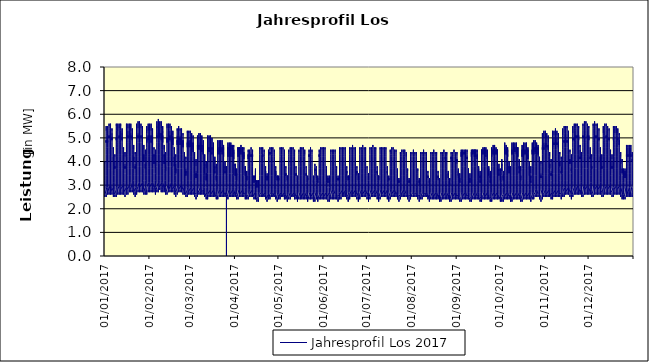
| Category | Jahresprofil Los 2017 |
|---|---|
| 01/01/2017 | 2.9 |
| 01/01/2017 | 2.8 |
| 01/01/2017 | 2.7 |
| 01/01/2017 | 2.6 |
| 01/01/2017 | 2.6 |
| 01/01/2017 | 2.5 |
| 01/01/2017 | 2.5 |
| 01/01/2017 | 2.6 |
| 01/01/2017 | 2.6 |
| 01/01/2017 | 2.8 |
| 01/01/2017 | 2.9 |
| 01/01/2017 | 3.2 |
| 01/01/2017 | 3.3 |
| 01/01/2017 | 3.3 |
| 01/01/2017 | 3.3 |
| 01/01/2017 | 3.3 |
| 01/01/2017 | 3.7 |
| 01/01/2017 | 3.9 |
| 01/01/2017 | 4 |
| 01/01/2017 | 3.9 |
| 01/01/2017 | 3.6 |
| 01/01/2017 | 3.4 |
| 01/01/2017 | 3.2 |
| 01/01/2017 | 3 |
| 01/01/2017 | 2.8 |
| 02/01/2017 | 2.6 |
| 02/01/2017 | 2.5 |
| 02/01/2017 | 2.5 |
| 02/01/2017 | 2.6 |
| 02/01/2017 | 2.8 |
| 02/01/2017 | 3.4 |
| 02/01/2017 | 3.9 |
| 02/01/2017 | 4.3 |
| 02/01/2017 | 4.6 |
| 02/01/2017 | 4.8 |
| 02/01/2017 | 4.8 |
| 02/01/2017 | 4.9 |
| 02/01/2017 | 4.8 |
| 02/01/2017 | 4.8 |
| 02/01/2017 | 4.9 |
| 02/01/2017 | 5.2 |
| 02/01/2017 | 5.5 |
| 02/01/2017 | 5.3 |
| 02/01/2017 | 5.1 |
| 02/01/2017 | 4.5 |
| 02/01/2017 | 4 |
| 02/01/2017 | 3.6 |
| 02/01/2017 | 3.3 |
| 02/01/2017 | 2.9 |
| 03/01/2017 | 2.7 |
| 03/01/2017 | 2.6 |
| 03/01/2017 | 2.6 |
| 03/01/2017 | 2.7 |
| 03/01/2017 | 2.9 |
| 03/01/2017 | 3.4 |
| 03/01/2017 | 4 |
| 03/01/2017 | 4.4 |
| 03/01/2017 | 4.6 |
| 03/01/2017 | 4.8 |
| 03/01/2017 | 4.9 |
| 03/01/2017 | 4.9 |
| 03/01/2017 | 4.9 |
| 03/01/2017 | 4.8 |
| 03/01/2017 | 4.9 |
| 03/01/2017 | 5.3 |
| 03/01/2017 | 5.5 |
| 03/01/2017 | 5.4 |
| 03/01/2017 | 5.2 |
| 03/01/2017 | 4.6 |
| 03/01/2017 | 4 |
| 03/01/2017 | 3.7 |
| 03/01/2017 | 3.3 |
| 03/01/2017 | 3 |
| 04/01/2017 | 2.7 |
| 04/01/2017 | 2.6 |
| 04/01/2017 | 2.6 |
| 04/01/2017 | 2.7 |
| 04/01/2017 | 3 |
| 04/01/2017 | 3.6 |
| 04/01/2017 | 4.3 |
| 04/01/2017 | 4.6 |
| 04/01/2017 | 4.8 |
| 04/01/2017 | 4.9 |
| 04/01/2017 | 5 |
| 04/01/2017 | 5.1 |
| 04/01/2017 | 5 |
| 04/01/2017 | 5 |
| 04/01/2017 | 5.1 |
| 04/01/2017 | 5.4 |
| 04/01/2017 | 5.6 |
| 04/01/2017 | 5.5 |
| 04/01/2017 | 5.3 |
| 04/01/2017 | 4.7 |
| 04/01/2017 | 4.1 |
| 04/01/2017 | 3.7 |
| 04/01/2017 | 3.3 |
| 04/01/2017 | 3 |
| 05/01/2017 | 2.7 |
| 05/01/2017 | 2.6 |
| 05/01/2017 | 2.6 |
| 05/01/2017 | 2.7 |
| 05/01/2017 | 3 |
| 05/01/2017 | 3.6 |
| 05/01/2017 | 4.2 |
| 05/01/2017 | 4.6 |
| 05/01/2017 | 4.8 |
| 05/01/2017 | 4.9 |
| 05/01/2017 | 5 |
| 05/01/2017 | 5 |
| 05/01/2017 | 5 |
| 05/01/2017 | 5 |
| 05/01/2017 | 5 |
| 05/01/2017 | 5.4 |
| 05/01/2017 | 5.6 |
| 05/01/2017 | 5.5 |
| 05/01/2017 | 5.3 |
| 05/01/2017 | 4.7 |
| 05/01/2017 | 4.1 |
| 05/01/2017 | 3.7 |
| 05/01/2017 | 3.3 |
| 05/01/2017 | 3 |
| 06/01/2017 | 2.7 |
| 06/01/2017 | 2.6 |
| 06/01/2017 | 2.6 |
| 06/01/2017 | 2.7 |
| 06/01/2017 | 3 |
| 06/01/2017 | 3.6 |
| 06/01/2017 | 4.2 |
| 06/01/2017 | 4.6 |
| 06/01/2017 | 4.8 |
| 06/01/2017 | 4.9 |
| 06/01/2017 | 5 |
| 06/01/2017 | 5 |
| 06/01/2017 | 4.9 |
| 06/01/2017 | 4.9 |
| 06/01/2017 | 4.9 |
| 06/01/2017 | 5.2 |
| 06/01/2017 | 5.4 |
| 06/01/2017 | 5.3 |
| 06/01/2017 | 5.1 |
| 06/01/2017 | 4.5 |
| 06/01/2017 | 4 |
| 06/01/2017 | 3.6 |
| 06/01/2017 | 3.3 |
| 06/01/2017 | 2.9 |
| 07/01/2017 | 2.7 |
| 07/01/2017 | 2.6 |
| 07/01/2017 | 2.6 |
| 07/01/2017 | 2.5 |
| 07/01/2017 | 2.6 |
| 07/01/2017 | 2.8 |
| 07/01/2017 | 3.1 |
| 07/01/2017 | 3.4 |
| 07/01/2017 | 3.8 |
| 07/01/2017 | 4 |
| 07/01/2017 | 4.2 |
| 07/01/2017 | 4.2 |
| 07/01/2017 | 4.1 |
| 07/01/2017 | 4 |
| 07/01/2017 | 4.1 |
| 07/01/2017 | 4.3 |
| 07/01/2017 | 4.6 |
| 07/01/2017 | 4.6 |
| 07/01/2017 | 4.5 |
| 07/01/2017 | 4 |
| 07/01/2017 | 3.6 |
| 07/01/2017 | 3.4 |
| 07/01/2017 | 3.1 |
| 07/01/2017 | 2.8 |
| 08/01/2017 | 2.6 |
| 08/01/2017 | 2.5 |
| 08/01/2017 | 2.5 |
| 08/01/2017 | 2.5 |
| 08/01/2017 | 2.5 |
| 08/01/2017 | 2.6 |
| 08/01/2017 | 2.8 |
| 08/01/2017 | 3 |
| 08/01/2017 | 3.3 |
| 08/01/2017 | 3.5 |
| 08/01/2017 | 3.7 |
| 08/01/2017 | 3.8 |
| 08/01/2017 | 3.7 |
| 08/01/2017 | 3.7 |
| 08/01/2017 | 3.7 |
| 08/01/2017 | 4 |
| 08/01/2017 | 4.3 |
| 08/01/2017 | 4.3 |
| 08/01/2017 | 4.2 |
| 08/01/2017 | 3.9 |
| 08/01/2017 | 3.6 |
| 08/01/2017 | 3.4 |
| 08/01/2017 | 3.1 |
| 08/01/2017 | 2.8 |
| 09/01/2017 | 2.6 |
| 09/01/2017 | 2.6 |
| 09/01/2017 | 2.5 |
| 09/01/2017 | 2.6 |
| 09/01/2017 | 2.9 |
| 09/01/2017 | 3.6 |
| 09/01/2017 | 4.2 |
| 09/01/2017 | 4.6 |
| 09/01/2017 | 4.7 |
| 09/01/2017 | 4.9 |
| 09/01/2017 | 5 |
| 09/01/2017 | 5 |
| 09/01/2017 | 5 |
| 09/01/2017 | 4.9 |
| 09/01/2017 | 5 |
| 09/01/2017 | 5.3 |
| 09/01/2017 | 5.6 |
| 09/01/2017 | 5.5 |
| 09/01/2017 | 5.3 |
| 09/01/2017 | 4.7 |
| 09/01/2017 | 4.1 |
| 09/01/2017 | 3.7 |
| 09/01/2017 | 3.3 |
| 09/01/2017 | 3 |
| 10/01/2017 | 2.7 |
| 10/01/2017 | 2.6 |
| 10/01/2017 | 2.6 |
| 10/01/2017 | 2.7 |
| 10/01/2017 | 3 |
| 10/01/2017 | 3.6 |
| 10/01/2017 | 4.3 |
| 10/01/2017 | 4.6 |
| 10/01/2017 | 4.8 |
| 10/01/2017 | 4.9 |
| 10/01/2017 | 5 |
| 10/01/2017 | 5 |
| 10/01/2017 | 5 |
| 10/01/2017 | 5 |
| 10/01/2017 | 5 |
| 10/01/2017 | 5.4 |
| 10/01/2017 | 5.6 |
| 10/01/2017 | 5.6 |
| 10/01/2017 | 5.3 |
| 10/01/2017 | 4.7 |
| 10/01/2017 | 4.2 |
| 10/01/2017 | 3.7 |
| 10/01/2017 | 3.3 |
| 10/01/2017 | 3 |
| 11/01/2017 | 2.8 |
| 11/01/2017 | 2.7 |
| 11/01/2017 | 2.6 |
| 11/01/2017 | 2.7 |
| 11/01/2017 | 3 |
| 11/01/2017 | 3.7 |
| 11/01/2017 | 4.3 |
| 11/01/2017 | 4.7 |
| 11/01/2017 | 4.9 |
| 11/01/2017 | 5 |
| 11/01/2017 | 5.1 |
| 11/01/2017 | 5.1 |
| 11/01/2017 | 5 |
| 11/01/2017 | 5 |
| 11/01/2017 | 5.1 |
| 11/01/2017 | 5.3 |
| 11/01/2017 | 5.6 |
| 11/01/2017 | 5.6 |
| 11/01/2017 | 5.4 |
| 11/01/2017 | 4.7 |
| 11/01/2017 | 4.2 |
| 11/01/2017 | 3.8 |
| 11/01/2017 | 3.3 |
| 11/01/2017 | 3 |
| 12/01/2017 | 2.8 |
| 12/01/2017 | 2.7 |
| 12/01/2017 | 2.6 |
| 12/01/2017 | 2.7 |
| 12/01/2017 | 3 |
| 12/01/2017 | 3.6 |
| 12/01/2017 | 4.3 |
| 12/01/2017 | 4.7 |
| 12/01/2017 | 4.8 |
| 12/01/2017 | 5 |
| 12/01/2017 | 5 |
| 12/01/2017 | 5.1 |
| 12/01/2017 | 5 |
| 12/01/2017 | 5 |
| 12/01/2017 | 5 |
| 12/01/2017 | 5.3 |
| 12/01/2017 | 5.6 |
| 12/01/2017 | 5.5 |
| 12/01/2017 | 5.3 |
| 12/01/2017 | 4.7 |
| 12/01/2017 | 4.2 |
| 12/01/2017 | 3.8 |
| 12/01/2017 | 3.3 |
| 12/01/2017 | 3 |
| 13/01/2017 | 2.8 |
| 13/01/2017 | 2.7 |
| 13/01/2017 | 2.6 |
| 13/01/2017 | 2.7 |
| 13/01/2017 | 3 |
| 13/01/2017 | 3.6 |
| 13/01/2017 | 4.3 |
| 13/01/2017 | 4.6 |
| 13/01/2017 | 4.8 |
| 13/01/2017 | 5 |
| 13/01/2017 | 5 |
| 13/01/2017 | 5 |
| 13/01/2017 | 4.9 |
| 13/01/2017 | 4.9 |
| 13/01/2017 | 4.9 |
| 13/01/2017 | 5.2 |
| 13/01/2017 | 5.4 |
| 13/01/2017 | 5.4 |
| 13/01/2017 | 5.1 |
| 13/01/2017 | 4.5 |
| 13/01/2017 | 4 |
| 13/01/2017 | 3.7 |
| 13/01/2017 | 3.3 |
| 13/01/2017 | 3 |
| 14/01/2017 | 2.8 |
| 14/01/2017 | 2.7 |
| 14/01/2017 | 2.6 |
| 14/01/2017 | 2.6 |
| 14/01/2017 | 2.6 |
| 14/01/2017 | 2.8 |
| 14/01/2017 | 3.1 |
| 14/01/2017 | 3.5 |
| 14/01/2017 | 3.8 |
| 14/01/2017 | 4.1 |
| 14/01/2017 | 4.2 |
| 14/01/2017 | 4.2 |
| 14/01/2017 | 4.1 |
| 14/01/2017 | 4 |
| 14/01/2017 | 4 |
| 14/01/2017 | 4.3 |
| 14/01/2017 | 4.6 |
| 14/01/2017 | 4.6 |
| 14/01/2017 | 4.5 |
| 14/01/2017 | 4.1 |
| 14/01/2017 | 3.7 |
| 14/01/2017 | 3.4 |
| 14/01/2017 | 3.1 |
| 14/01/2017 | 2.9 |
| 15/01/2017 | 2.7 |
| 15/01/2017 | 2.6 |
| 15/01/2017 | 2.5 |
| 15/01/2017 | 2.5 |
| 15/01/2017 | 2.5 |
| 15/01/2017 | 2.6 |
| 15/01/2017 | 2.8 |
| 15/01/2017 | 3.1 |
| 15/01/2017 | 3.3 |
| 15/01/2017 | 3.5 |
| 15/01/2017 | 3.7 |
| 15/01/2017 | 3.8 |
| 15/01/2017 | 3.7 |
| 15/01/2017 | 3.7 |
| 15/01/2017 | 3.7 |
| 15/01/2017 | 3.9 |
| 15/01/2017 | 4.3 |
| 15/01/2017 | 4.4 |
| 15/01/2017 | 4.2 |
| 15/01/2017 | 3.9 |
| 15/01/2017 | 3.6 |
| 15/01/2017 | 3.5 |
| 15/01/2017 | 3.2 |
| 15/01/2017 | 2.9 |
| 16/01/2017 | 2.7 |
| 16/01/2017 | 2.6 |
| 16/01/2017 | 2.6 |
| 16/01/2017 | 2.7 |
| 16/01/2017 | 3 |
| 16/01/2017 | 3.6 |
| 16/01/2017 | 4.3 |
| 16/01/2017 | 4.6 |
| 16/01/2017 | 4.8 |
| 16/01/2017 | 4.9 |
| 16/01/2017 | 5 |
| 16/01/2017 | 5 |
| 16/01/2017 | 5 |
| 16/01/2017 | 5 |
| 16/01/2017 | 5 |
| 16/01/2017 | 5.2 |
| 16/01/2017 | 5.6 |
| 16/01/2017 | 5.6 |
| 16/01/2017 | 5.3 |
| 16/01/2017 | 4.7 |
| 16/01/2017 | 4.2 |
| 16/01/2017 | 3.8 |
| 16/01/2017 | 3.3 |
| 16/01/2017 | 3 |
| 17/01/2017 | 2.8 |
| 17/01/2017 | 2.7 |
| 17/01/2017 | 2.6 |
| 17/01/2017 | 2.7 |
| 17/01/2017 | 3 |
| 17/01/2017 | 3.7 |
| 17/01/2017 | 4.3 |
| 17/01/2017 | 4.7 |
| 17/01/2017 | 4.9 |
| 17/01/2017 | 5 |
| 17/01/2017 | 5.1 |
| 17/01/2017 | 5.1 |
| 17/01/2017 | 5 |
| 17/01/2017 | 5 |
| 17/01/2017 | 5 |
| 17/01/2017 | 5.3 |
| 17/01/2017 | 5.6 |
| 17/01/2017 | 5.6 |
| 17/01/2017 | 5.4 |
| 17/01/2017 | 4.8 |
| 17/01/2017 | 4.2 |
| 17/01/2017 | 3.8 |
| 17/01/2017 | 3.4 |
| 17/01/2017 | 3 |
| 18/01/2017 | 2.8 |
| 18/01/2017 | 2.7 |
| 18/01/2017 | 2.7 |
| 18/01/2017 | 2.8 |
| 18/01/2017 | 3.1 |
| 18/01/2017 | 3.7 |
| 18/01/2017 | 4.4 |
| 18/01/2017 | 4.7 |
| 18/01/2017 | 4.9 |
| 18/01/2017 | 5 |
| 18/01/2017 | 5.1 |
| 18/01/2017 | 5.1 |
| 18/01/2017 | 5.1 |
| 18/01/2017 | 5 |
| 18/01/2017 | 5 |
| 18/01/2017 | 5.3 |
| 18/01/2017 | 5.6 |
| 18/01/2017 | 5.6 |
| 18/01/2017 | 5.4 |
| 18/01/2017 | 4.8 |
| 18/01/2017 | 4.2 |
| 18/01/2017 | 3.8 |
| 18/01/2017 | 3.4 |
| 18/01/2017 | 3 |
| 19/01/2017 | 2.8 |
| 19/01/2017 | 2.7 |
| 19/01/2017 | 2.7 |
| 19/01/2017 | 2.8 |
| 19/01/2017 | 3.1 |
| 19/01/2017 | 3.7 |
| 19/01/2017 | 4.4 |
| 19/01/2017 | 4.7 |
| 19/01/2017 | 4.9 |
| 19/01/2017 | 5 |
| 19/01/2017 | 5.1 |
| 19/01/2017 | 5.1 |
| 19/01/2017 | 5 |
| 19/01/2017 | 5 |
| 19/01/2017 | 5 |
| 19/01/2017 | 5.2 |
| 19/01/2017 | 5.6 |
| 19/01/2017 | 5.6 |
| 19/01/2017 | 5.3 |
| 19/01/2017 | 4.7 |
| 19/01/2017 | 4.2 |
| 19/01/2017 | 3.8 |
| 19/01/2017 | 3.4 |
| 19/01/2017 | 3.1 |
| 20/01/2017 | 2.8 |
| 20/01/2017 | 2.7 |
| 20/01/2017 | 2.7 |
| 20/01/2017 | 2.8 |
| 20/01/2017 | 3 |
| 20/01/2017 | 3.7 |
| 20/01/2017 | 4.3 |
| 20/01/2017 | 4.7 |
| 20/01/2017 | 4.9 |
| 20/01/2017 | 5 |
| 20/01/2017 | 5.1 |
| 20/01/2017 | 5.1 |
| 20/01/2017 | 5 |
| 20/01/2017 | 4.9 |
| 20/01/2017 | 4.9 |
| 20/01/2017 | 5.1 |
| 20/01/2017 | 5.4 |
| 20/01/2017 | 5.4 |
| 20/01/2017 | 5.1 |
| 20/01/2017 | 4.5 |
| 20/01/2017 | 4 |
| 20/01/2017 | 3.7 |
| 20/01/2017 | 3.3 |
| 20/01/2017 | 3 |
| 21/01/2017 | 2.8 |
| 21/01/2017 | 2.7 |
| 21/01/2017 | 2.6 |
| 21/01/2017 | 2.6 |
| 21/01/2017 | 2.7 |
| 21/01/2017 | 2.9 |
| 21/01/2017 | 3.2 |
| 21/01/2017 | 3.5 |
| 21/01/2017 | 3.9 |
| 21/01/2017 | 4.1 |
| 21/01/2017 | 4.2 |
| 21/01/2017 | 4.2 |
| 21/01/2017 | 4.1 |
| 21/01/2017 | 4 |
| 21/01/2017 | 4 |
| 21/01/2017 | 4.2 |
| 21/01/2017 | 4.6 |
| 21/01/2017 | 4.7 |
| 21/01/2017 | 4.5 |
| 21/01/2017 | 4.1 |
| 21/01/2017 | 3.7 |
| 21/01/2017 | 3.4 |
| 21/01/2017 | 3.2 |
| 21/01/2017 | 2.9 |
| 22/01/2017 | 2.7 |
| 22/01/2017 | 2.6 |
| 22/01/2017 | 2.6 |
| 22/01/2017 | 2.5 |
| 22/01/2017 | 2.5 |
| 22/01/2017 | 2.7 |
| 22/01/2017 | 2.9 |
| 22/01/2017 | 3.1 |
| 22/01/2017 | 3.4 |
| 22/01/2017 | 3.6 |
| 22/01/2017 | 3.8 |
| 22/01/2017 | 3.8 |
| 22/01/2017 | 3.7 |
| 22/01/2017 | 3.7 |
| 22/01/2017 | 3.7 |
| 22/01/2017 | 3.9 |
| 22/01/2017 | 4.2 |
| 22/01/2017 | 4.4 |
| 22/01/2017 | 4.3 |
| 22/01/2017 | 3.9 |
| 22/01/2017 | 3.7 |
| 22/01/2017 | 3.5 |
| 22/01/2017 | 3.2 |
| 22/01/2017 | 2.9 |
| 23/01/2017 | 2.7 |
| 23/01/2017 | 2.6 |
| 23/01/2017 | 2.6 |
| 23/01/2017 | 2.7 |
| 23/01/2017 | 3 |
| 23/01/2017 | 3.7 |
| 23/01/2017 | 4.3 |
| 23/01/2017 | 4.7 |
| 23/01/2017 | 4.9 |
| 23/01/2017 | 5 |
| 23/01/2017 | 5.1 |
| 23/01/2017 | 5.1 |
| 23/01/2017 | 5 |
| 23/01/2017 | 5 |
| 23/01/2017 | 5 |
| 23/01/2017 | 5.1 |
| 23/01/2017 | 5.5 |
| 23/01/2017 | 5.6 |
| 23/01/2017 | 5.4 |
| 23/01/2017 | 4.7 |
| 23/01/2017 | 4.2 |
| 23/01/2017 | 3.8 |
| 23/01/2017 | 3.4 |
| 23/01/2017 | 3 |
| 24/01/2017 | 2.8 |
| 24/01/2017 | 2.7 |
| 24/01/2017 | 2.7 |
| 24/01/2017 | 2.8 |
| 24/01/2017 | 3.1 |
| 24/01/2017 | 3.8 |
| 24/01/2017 | 4.4 |
| 24/01/2017 | 4.8 |
| 24/01/2017 | 4.9 |
| 24/01/2017 | 5.1 |
| 24/01/2017 | 5.1 |
| 24/01/2017 | 5.1 |
| 24/01/2017 | 5 |
| 24/01/2017 | 5 |
| 24/01/2017 | 5 |
| 24/01/2017 | 5.2 |
| 24/01/2017 | 5.6 |
| 24/01/2017 | 5.7 |
| 24/01/2017 | 5.4 |
| 24/01/2017 | 4.8 |
| 24/01/2017 | 4.2 |
| 24/01/2017 | 3.8 |
| 24/01/2017 | 3.4 |
| 24/01/2017 | 3.1 |
| 25/01/2017 | 2.8 |
| 25/01/2017 | 2.7 |
| 25/01/2017 | 2.7 |
| 25/01/2017 | 2.8 |
| 25/01/2017 | 3.1 |
| 25/01/2017 | 3.8 |
| 25/01/2017 | 4.5 |
| 25/01/2017 | 4.8 |
| 25/01/2017 | 5 |
| 25/01/2017 | 5.1 |
| 25/01/2017 | 5.2 |
| 25/01/2017 | 5.2 |
| 25/01/2017 | 5.1 |
| 25/01/2017 | 5 |
| 25/01/2017 | 5 |
| 25/01/2017 | 5.2 |
| 25/01/2017 | 5.6 |
| 25/01/2017 | 5.7 |
| 25/01/2017 | 5.4 |
| 25/01/2017 | 4.8 |
| 25/01/2017 | 4.2 |
| 25/01/2017 | 3.8 |
| 25/01/2017 | 3.4 |
| 25/01/2017 | 3.1 |
| 26/01/2017 | 2.9 |
| 26/01/2017 | 2.7 |
| 26/01/2017 | 2.7 |
| 26/01/2017 | 2.8 |
| 26/01/2017 | 3.1 |
| 26/01/2017 | 3.8 |
| 26/01/2017 | 4.4 |
| 26/01/2017 | 4.8 |
| 26/01/2017 | 5 |
| 26/01/2017 | 5.1 |
| 26/01/2017 | 5.1 |
| 26/01/2017 | 5.1 |
| 26/01/2017 | 5 |
| 26/01/2017 | 5 |
| 26/01/2017 | 5 |
| 26/01/2017 | 5.1 |
| 26/01/2017 | 5.5 |
| 26/01/2017 | 5.6 |
| 26/01/2017 | 5.4 |
| 26/01/2017 | 4.8 |
| 26/01/2017 | 4.2 |
| 26/01/2017 | 3.8 |
| 26/01/2017 | 3.4 |
| 26/01/2017 | 3.1 |
| 27/01/2017 | 2.9 |
| 27/01/2017 | 2.7 |
| 27/01/2017 | 2.7 |
| 27/01/2017 | 2.8 |
| 27/01/2017 | 3.1 |
| 27/01/2017 | 3.8 |
| 27/01/2017 | 4.4 |
| 27/01/2017 | 4.8 |
| 27/01/2017 | 5 |
| 27/01/2017 | 5.1 |
| 27/01/2017 | 5.1 |
| 27/01/2017 | 5.1 |
| 27/01/2017 | 5 |
| 27/01/2017 | 4.9 |
| 27/01/2017 | 4.9 |
| 27/01/2017 | 5 |
| 27/01/2017 | 5.4 |
| 27/01/2017 | 5.5 |
| 27/01/2017 | 5.2 |
| 27/01/2017 | 4.6 |
| 27/01/2017 | 4.1 |
| 27/01/2017 | 3.7 |
| 27/01/2017 | 3.4 |
| 27/01/2017 | 3.1 |
| 28/01/2017 | 2.8 |
| 28/01/2017 | 2.7 |
| 28/01/2017 | 2.7 |
| 28/01/2017 | 2.6 |
| 28/01/2017 | 2.7 |
| 28/01/2017 | 2.9 |
| 28/01/2017 | 3.2 |
| 28/01/2017 | 3.6 |
| 28/01/2017 | 3.9 |
| 28/01/2017 | 4.2 |
| 28/01/2017 | 4.3 |
| 28/01/2017 | 4.3 |
| 28/01/2017 | 4.1 |
| 28/01/2017 | 4 |
| 28/01/2017 | 4 |
| 28/01/2017 | 4.1 |
| 28/01/2017 | 4.6 |
| 28/01/2017 | 4.7 |
| 28/01/2017 | 4.5 |
| 28/01/2017 | 4.1 |
| 28/01/2017 | 3.7 |
| 28/01/2017 | 3.5 |
| 28/01/2017 | 3.2 |
| 28/01/2017 | 2.9 |
| 29/01/2017 | 2.7 |
| 29/01/2017 | 2.6 |
| 29/01/2017 | 2.6 |
| 29/01/2017 | 2.6 |
| 29/01/2017 | 2.6 |
| 29/01/2017 | 2.7 |
| 29/01/2017 | 2.9 |
| 29/01/2017 | 3.2 |
| 29/01/2017 | 3.4 |
| 29/01/2017 | 3.6 |
| 29/01/2017 | 3.8 |
| 29/01/2017 | 3.9 |
| 29/01/2017 | 3.8 |
| 29/01/2017 | 3.7 |
| 29/01/2017 | 3.7 |
| 29/01/2017 | 3.8 |
| 29/01/2017 | 4.2 |
| 29/01/2017 | 4.5 |
| 29/01/2017 | 4.3 |
| 29/01/2017 | 4 |
| 29/01/2017 | 3.7 |
| 29/01/2017 | 3.5 |
| 29/01/2017 | 3.2 |
| 29/01/2017 | 3 |
| 30/01/2017 | 2.7 |
| 30/01/2017 | 2.6 |
| 30/01/2017 | 2.6 |
| 30/01/2017 | 2.7 |
| 30/01/2017 | 3 |
| 30/01/2017 | 3.6 |
| 30/01/2017 | 4.2 |
| 30/01/2017 | 4.6 |
| 30/01/2017 | 4.8 |
| 30/01/2017 | 5 |
| 30/01/2017 | 5 |
| 30/01/2017 | 5 |
| 30/01/2017 | 4.9 |
| 30/01/2017 | 4.9 |
| 30/01/2017 | 4.8 |
| 30/01/2017 | 4.9 |
| 30/01/2017 | 5.4 |
| 30/01/2017 | 5.5 |
| 30/01/2017 | 5.2 |
| 30/01/2017 | 4.6 |
| 30/01/2017 | 4.1 |
| 30/01/2017 | 3.8 |
| 30/01/2017 | 3.4 |
| 30/01/2017 | 3.1 |
| 31/01/2017 | 2.9 |
| 31/01/2017 | 2.7 |
| 31/01/2017 | 2.7 |
| 31/01/2017 | 2.8 |
| 31/01/2017 | 3.1 |
| 31/01/2017 | 3.7 |
| 31/01/2017 | 4.3 |
| 31/01/2017 | 4.7 |
| 31/01/2017 | 4.9 |
| 31/01/2017 | 5 |
| 31/01/2017 | 5.1 |
| 31/01/2017 | 5 |
| 31/01/2017 | 5 |
| 31/01/2017 | 4.9 |
| 31/01/2017 | 4.9 |
| 31/01/2017 | 5 |
| 31/01/2017 | 5.5 |
| 31/01/2017 | 5.6 |
| 31/01/2017 | 5.3 |
| 31/01/2017 | 4.7 |
| 31/01/2017 | 4.2 |
| 31/01/2017 | 3.8 |
| 31/01/2017 | 3.4 |
| 31/01/2017 | 3.1 |
| 01/02/2017 | 2.9 |
| 01/02/2017 | 2.8 |
| 01/02/2017 | 2.7 |
| 01/02/2017 | 2.8 |
| 01/02/2017 | 3.1 |
| 01/02/2017 | 3.7 |
| 01/02/2017 | 4.3 |
| 01/02/2017 | 4.7 |
| 01/02/2017 | 4.9 |
| 01/02/2017 | 5.1 |
| 01/02/2017 | 5.1 |
| 01/02/2017 | 5.1 |
| 01/02/2017 | 5 |
| 01/02/2017 | 4.9 |
| 01/02/2017 | 4.9 |
| 01/02/2017 | 5 |
| 01/02/2017 | 5.5 |
| 01/02/2017 | 5.6 |
| 01/02/2017 | 5.3 |
| 01/02/2017 | 4.7 |
| 01/02/2017 | 4.2 |
| 01/02/2017 | 3.8 |
| 01/02/2017 | 3.4 |
| 01/02/2017 | 3.1 |
| 02/02/2017 | 2.9 |
| 02/02/2017 | 2.8 |
| 02/02/2017 | 2.7 |
| 02/02/2017 | 2.8 |
| 02/02/2017 | 3.1 |
| 02/02/2017 | 3.7 |
| 02/02/2017 | 4.3 |
| 02/02/2017 | 4.7 |
| 02/02/2017 | 4.9 |
| 02/02/2017 | 5.1 |
| 02/02/2017 | 5.1 |
| 02/02/2017 | 5.1 |
| 02/02/2017 | 5 |
| 02/02/2017 | 4.9 |
| 02/02/2017 | 4.8 |
| 02/02/2017 | 4.9 |
| 02/02/2017 | 5.4 |
| 02/02/2017 | 5.6 |
| 02/02/2017 | 5.3 |
| 02/02/2017 | 4.7 |
| 02/02/2017 | 4.2 |
| 02/02/2017 | 3.8 |
| 02/02/2017 | 3.4 |
| 02/02/2017 | 3.1 |
| 03/02/2017 | 2.9 |
| 03/02/2017 | 2.8 |
| 03/02/2017 | 2.7 |
| 03/02/2017 | 2.8 |
| 03/02/2017 | 3.1 |
| 03/02/2017 | 3.7 |
| 03/02/2017 | 4.3 |
| 03/02/2017 | 4.7 |
| 03/02/2017 | 4.9 |
| 03/02/2017 | 5.1 |
| 03/02/2017 | 5.1 |
| 03/02/2017 | 5.1 |
| 03/02/2017 | 4.9 |
| 03/02/2017 | 4.8 |
| 03/02/2017 | 4.7 |
| 03/02/2017 | 4.8 |
| 03/02/2017 | 5.3 |
| 03/02/2017 | 5.4 |
| 03/02/2017 | 5.1 |
| 03/02/2017 | 4.5 |
| 03/02/2017 | 4 |
| 03/02/2017 | 3.7 |
| 03/02/2017 | 3.4 |
| 03/02/2017 | 3.1 |
| 04/02/2017 | 2.9 |
| 04/02/2017 | 2.8 |
| 04/02/2017 | 2.7 |
| 04/02/2017 | 2.7 |
| 04/02/2017 | 2.7 |
| 04/02/2017 | 2.9 |
| 04/02/2017 | 3.1 |
| 04/02/2017 | 3.5 |
| 04/02/2017 | 3.9 |
| 04/02/2017 | 4.2 |
| 04/02/2017 | 4.3 |
| 04/02/2017 | 4.2 |
| 04/02/2017 | 4.1 |
| 04/02/2017 | 3.9 |
| 04/02/2017 | 3.9 |
| 04/02/2017 | 4 |
| 04/02/2017 | 4.4 |
| 04/02/2017 | 4.6 |
| 04/02/2017 | 4.5 |
| 04/02/2017 | 4 |
| 04/02/2017 | 3.7 |
| 04/02/2017 | 3.5 |
| 04/02/2017 | 3.2 |
| 04/02/2017 | 3 |
| 05/02/2017 | 2.8 |
| 05/02/2017 | 2.7 |
| 05/02/2017 | 2.6 |
| 05/02/2017 | 2.6 |
| 05/02/2017 | 2.6 |
| 05/02/2017 | 2.7 |
| 05/02/2017 | 2.9 |
| 05/02/2017 | 3.2 |
| 05/02/2017 | 3.5 |
| 05/02/2017 | 3.7 |
| 05/02/2017 | 3.8 |
| 05/02/2017 | 3.9 |
| 05/02/2017 | 3.8 |
| 05/02/2017 | 3.7 |
| 05/02/2017 | 3.7 |
| 05/02/2017 | 3.7 |
| 05/02/2017 | 4.2 |
| 05/02/2017 | 4.5 |
| 05/02/2017 | 4.3 |
| 05/02/2017 | 4 |
| 05/02/2017 | 3.7 |
| 05/02/2017 | 3.5 |
| 05/02/2017 | 3.2 |
| 05/02/2017 | 3 |
| 06/02/2017 | 2.8 |
| 06/02/2017 | 2.7 |
| 06/02/2017 | 2.7 |
| 06/02/2017 | 2.8 |
| 06/02/2017 | 3.1 |
| 06/02/2017 | 3.8 |
| 06/02/2017 | 4.5 |
| 06/02/2017 | 4.8 |
| 06/02/2017 | 5 |
| 06/02/2017 | 5.1 |
| 06/02/2017 | 5.1 |
| 06/02/2017 | 5.1 |
| 06/02/2017 | 5 |
| 06/02/2017 | 5 |
| 06/02/2017 | 5 |
| 06/02/2017 | 5 |
| 06/02/2017 | 5.5 |
| 06/02/2017 | 5.7 |
| 06/02/2017 | 5.4 |
| 06/02/2017 | 4.8 |
| 06/02/2017 | 4.3 |
| 06/02/2017 | 3.8 |
| 06/02/2017 | 3.4 |
| 06/02/2017 | 3.1 |
| 07/02/2017 | 2.9 |
| 07/02/2017 | 2.8 |
| 07/02/2017 | 2.7 |
| 07/02/2017 | 2.9 |
| 07/02/2017 | 3.2 |
| 07/02/2017 | 3.9 |
| 07/02/2017 | 4.5 |
| 07/02/2017 | 4.9 |
| 07/02/2017 | 5.1 |
| 07/02/2017 | 5.1 |
| 07/02/2017 | 5.2 |
| 07/02/2017 | 5.2 |
| 07/02/2017 | 5.1 |
| 07/02/2017 | 5 |
| 07/02/2017 | 5 |
| 07/02/2017 | 5 |
| 07/02/2017 | 5.6 |
| 07/02/2017 | 5.8 |
| 07/02/2017 | 5.5 |
| 07/02/2017 | 4.8 |
| 07/02/2017 | 4.3 |
| 07/02/2017 | 3.9 |
| 07/02/2017 | 3.4 |
| 07/02/2017 | 3.1 |
| 08/02/2017 | 2.9 |
| 08/02/2017 | 2.8 |
| 08/02/2017 | 2.8 |
| 08/02/2017 | 2.9 |
| 08/02/2017 | 3.2 |
| 08/02/2017 | 3.9 |
| 08/02/2017 | 4.6 |
| 08/02/2017 | 4.9 |
| 08/02/2017 | 5.1 |
| 08/02/2017 | 5.2 |
| 08/02/2017 | 5.2 |
| 08/02/2017 | 5.2 |
| 08/02/2017 | 5.1 |
| 08/02/2017 | 5 |
| 08/02/2017 | 5 |
| 08/02/2017 | 5 |
| 08/02/2017 | 5.5 |
| 08/02/2017 | 5.7 |
| 08/02/2017 | 5.5 |
| 08/02/2017 | 4.8 |
| 08/02/2017 | 4.3 |
| 08/02/2017 | 3.9 |
| 08/02/2017 | 3.4 |
| 08/02/2017 | 3.1 |
| 09/02/2017 | 2.9 |
| 09/02/2017 | 2.8 |
| 09/02/2017 | 2.7 |
| 09/02/2017 | 2.8 |
| 09/02/2017 | 3.2 |
| 09/02/2017 | 3.9 |
| 09/02/2017 | 4.5 |
| 09/02/2017 | 4.9 |
| 09/02/2017 | 5 |
| 09/02/2017 | 5.1 |
| 09/02/2017 | 5.2 |
| 09/02/2017 | 5.1 |
| 09/02/2017 | 5 |
| 09/02/2017 | 5 |
| 09/02/2017 | 4.9 |
| 09/02/2017 | 5 |
| 09/02/2017 | 5.5 |
| 09/02/2017 | 5.7 |
| 09/02/2017 | 5.4 |
| 09/02/2017 | 4.8 |
| 09/02/2017 | 4.2 |
| 09/02/2017 | 3.8 |
| 09/02/2017 | 3.4 |
| 09/02/2017 | 3.1 |
| 10/02/2017 | 2.9 |
| 10/02/2017 | 2.8 |
| 10/02/2017 | 2.7 |
| 10/02/2017 | 2.8 |
| 10/02/2017 | 3.1 |
| 10/02/2017 | 3.8 |
| 10/02/2017 | 4.5 |
| 10/02/2017 | 4.8 |
| 10/02/2017 | 5 |
| 10/02/2017 | 5.1 |
| 10/02/2017 | 5.1 |
| 10/02/2017 | 5.1 |
| 10/02/2017 | 5 |
| 10/02/2017 | 4.9 |
| 10/02/2017 | 4.8 |
| 10/02/2017 | 4.8 |
| 10/02/2017 | 5.3 |
| 10/02/2017 | 5.5 |
| 10/02/2017 | 5.2 |
| 10/02/2017 | 4.6 |
| 10/02/2017 | 4.1 |
| 10/02/2017 | 3.7 |
| 10/02/2017 | 3.4 |
| 10/02/2017 | 3.1 |
| 11/02/2017 | 2.9 |
| 11/02/2017 | 2.7 |
| 11/02/2017 | 2.7 |
| 11/02/2017 | 2.7 |
| 11/02/2017 | 2.7 |
| 11/02/2017 | 3 |
| 11/02/2017 | 3.3 |
| 11/02/2017 | 3.6 |
| 11/02/2017 | 4 |
| 11/02/2017 | 4.2 |
| 11/02/2017 | 4.3 |
| 11/02/2017 | 4.2 |
| 11/02/2017 | 4.1 |
| 11/02/2017 | 4 |
| 11/02/2017 | 3.9 |
| 11/02/2017 | 4 |
| 11/02/2017 | 4.4 |
| 11/02/2017 | 4.7 |
| 11/02/2017 | 4.5 |
| 11/02/2017 | 4.1 |
| 11/02/2017 | 3.7 |
| 11/02/2017 | 3.5 |
| 11/02/2017 | 3.2 |
| 11/02/2017 | 2.9 |
| 12/02/2017 | 2.7 |
| 12/02/2017 | 2.6 |
| 12/02/2017 | 2.6 |
| 12/02/2017 | 2.6 |
| 12/02/2017 | 2.6 |
| 12/02/2017 | 2.7 |
| 12/02/2017 | 2.9 |
| 12/02/2017 | 3.2 |
| 12/02/2017 | 3.4 |
| 12/02/2017 | 3.6 |
| 12/02/2017 | 3.8 |
| 12/02/2017 | 3.8 |
| 12/02/2017 | 3.7 |
| 12/02/2017 | 3.6 |
| 12/02/2017 | 3.6 |
| 12/02/2017 | 3.6 |
| 12/02/2017 | 4.1 |
| 12/02/2017 | 4.4 |
| 12/02/2017 | 4.3 |
| 12/02/2017 | 3.9 |
| 12/02/2017 | 3.7 |
| 12/02/2017 | 3.5 |
| 12/02/2017 | 3.2 |
| 12/02/2017 | 2.9 |
| 13/02/2017 | 2.7 |
| 13/02/2017 | 2.6 |
| 13/02/2017 | 2.6 |
| 13/02/2017 | 2.7 |
| 13/02/2017 | 3 |
| 13/02/2017 | 3.8 |
| 13/02/2017 | 4.4 |
| 13/02/2017 | 4.7 |
| 13/02/2017 | 4.9 |
| 13/02/2017 | 5 |
| 13/02/2017 | 5 |
| 13/02/2017 | 5 |
| 13/02/2017 | 4.9 |
| 13/02/2017 | 4.9 |
| 13/02/2017 | 4.8 |
| 13/02/2017 | 4.9 |
| 13/02/2017 | 5.3 |
| 13/02/2017 | 5.6 |
| 13/02/2017 | 5.4 |
| 13/02/2017 | 4.7 |
| 13/02/2017 | 4.2 |
| 13/02/2017 | 3.8 |
| 13/02/2017 | 3.3 |
| 13/02/2017 | 3 |
| 14/02/2017 | 2.8 |
| 14/02/2017 | 2.7 |
| 14/02/2017 | 2.7 |
| 14/02/2017 | 2.8 |
| 14/02/2017 | 3.1 |
| 14/02/2017 | 3.8 |
| 14/02/2017 | 4.4 |
| 14/02/2017 | 4.8 |
| 14/02/2017 | 5 |
| 14/02/2017 | 5 |
| 14/02/2017 | 5.1 |
| 14/02/2017 | 5 |
| 14/02/2017 | 5 |
| 14/02/2017 | 4.9 |
| 14/02/2017 | 4.8 |
| 14/02/2017 | 4.9 |
| 14/02/2017 | 5.4 |
| 14/02/2017 | 5.6 |
| 14/02/2017 | 5.4 |
| 14/02/2017 | 4.8 |
| 14/02/2017 | 4.2 |
| 14/02/2017 | 3.8 |
| 14/02/2017 | 3.4 |
| 14/02/2017 | 3.1 |
| 15/02/2017 | 2.8 |
| 15/02/2017 | 2.7 |
| 15/02/2017 | 2.7 |
| 15/02/2017 | 2.8 |
| 15/02/2017 | 3.1 |
| 15/02/2017 | 3.8 |
| 15/02/2017 | 4.4 |
| 15/02/2017 | 4.8 |
| 15/02/2017 | 5 |
| 15/02/2017 | 5.1 |
| 15/02/2017 | 5.1 |
| 15/02/2017 | 5.1 |
| 15/02/2017 | 5 |
| 15/02/2017 | 4.9 |
| 15/02/2017 | 4.9 |
| 15/02/2017 | 4.9 |
| 15/02/2017 | 5.3 |
| 15/02/2017 | 5.6 |
| 15/02/2017 | 5.4 |
| 15/02/2017 | 4.8 |
| 15/02/2017 | 4.2 |
| 15/02/2017 | 3.8 |
| 15/02/2017 | 3.4 |
| 15/02/2017 | 3.1 |
| 16/02/2017 | 2.8 |
| 16/02/2017 | 2.7 |
| 16/02/2017 | 2.7 |
| 16/02/2017 | 2.8 |
| 16/02/2017 | 3.1 |
| 16/02/2017 | 3.8 |
| 16/02/2017 | 4.4 |
| 16/02/2017 | 4.8 |
| 16/02/2017 | 4.9 |
| 16/02/2017 | 5 |
| 16/02/2017 | 5.1 |
| 16/02/2017 | 5 |
| 16/02/2017 | 4.9 |
| 16/02/2017 | 4.9 |
| 16/02/2017 | 4.8 |
| 16/02/2017 | 4.8 |
| 16/02/2017 | 5.2 |
| 16/02/2017 | 5.5 |
| 16/02/2017 | 5.3 |
| 16/02/2017 | 4.7 |
| 16/02/2017 | 4.2 |
| 16/02/2017 | 3.8 |
| 16/02/2017 | 3.3 |
| 16/02/2017 | 3 |
| 17/02/2017 | 2.8 |
| 17/02/2017 | 2.7 |
| 17/02/2017 | 2.7 |
| 17/02/2017 | 2.8 |
| 17/02/2017 | 3.1 |
| 17/02/2017 | 3.7 |
| 17/02/2017 | 4.4 |
| 17/02/2017 | 4.7 |
| 17/02/2017 | 4.9 |
| 17/02/2017 | 5 |
| 17/02/2017 | 5 |
| 17/02/2017 | 5 |
| 17/02/2017 | 4.9 |
| 17/02/2017 | 4.8 |
| 17/02/2017 | 4.7 |
| 17/02/2017 | 4.7 |
| 17/02/2017 | 5.1 |
| 17/02/2017 | 5.3 |
| 17/02/2017 | 5.1 |
| 17/02/2017 | 4.5 |
| 17/02/2017 | 4 |
| 17/02/2017 | 3.6 |
| 17/02/2017 | 3.3 |
| 17/02/2017 | 3 |
| 18/02/2017 | 2.8 |
| 18/02/2017 | 2.7 |
| 18/02/2017 | 2.6 |
| 18/02/2017 | 2.6 |
| 18/02/2017 | 2.7 |
| 18/02/2017 | 2.9 |
| 18/02/2017 | 3.2 |
| 18/02/2017 | 3.5 |
| 18/02/2017 | 3.9 |
| 18/02/2017 | 4.1 |
| 18/02/2017 | 4.2 |
| 18/02/2017 | 4.1 |
| 18/02/2017 | 4 |
| 18/02/2017 | 3.9 |
| 18/02/2017 | 3.8 |
| 18/02/2017 | 3.9 |
| 18/02/2017 | 4.2 |
| 18/02/2017 | 4.6 |
| 18/02/2017 | 4.5 |
| 18/02/2017 | 4.1 |
| 18/02/2017 | 3.6 |
| 18/02/2017 | 3.4 |
| 18/02/2017 | 3.1 |
| 18/02/2017 | 2.9 |
| 19/02/2017 | 2.7 |
| 19/02/2017 | 2.6 |
| 19/02/2017 | 2.5 |
| 19/02/2017 | 2.5 |
| 19/02/2017 | 2.6 |
| 19/02/2017 | 2.7 |
| 19/02/2017 | 2.8 |
| 19/02/2017 | 3.1 |
| 19/02/2017 | 3.4 |
| 19/02/2017 | 3.5 |
| 19/02/2017 | 3.7 |
| 19/02/2017 | 3.7 |
| 19/02/2017 | 3.6 |
| 19/02/2017 | 3.5 |
| 19/02/2017 | 3.5 |
| 19/02/2017 | 3.5 |
| 19/02/2017 | 3.9 |
| 19/02/2017 | 4.3 |
| 19/02/2017 | 4.2 |
| 19/02/2017 | 3.9 |
| 19/02/2017 | 3.6 |
| 19/02/2017 | 3.4 |
| 19/02/2017 | 3.1 |
| 19/02/2017 | 2.9 |
| 20/02/2017 | 2.7 |
| 20/02/2017 | 2.6 |
| 20/02/2017 | 2.6 |
| 20/02/2017 | 2.7 |
| 20/02/2017 | 3 |
| 20/02/2017 | 3.7 |
| 20/02/2017 | 4.3 |
| 20/02/2017 | 4.6 |
| 20/02/2017 | 4.8 |
| 20/02/2017 | 4.9 |
| 20/02/2017 | 4.9 |
| 20/02/2017 | 4.9 |
| 20/02/2017 | 4.8 |
| 20/02/2017 | 4.8 |
| 20/02/2017 | 4.7 |
| 20/02/2017 | 4.7 |
| 20/02/2017 | 5.1 |
| 20/02/2017 | 5.4 |
| 20/02/2017 | 5.3 |
| 20/02/2017 | 4.7 |
| 20/02/2017 | 4.1 |
| 20/02/2017 | 3.7 |
| 20/02/2017 | 3.3 |
| 20/02/2017 | 3 |
| 21/02/2017 | 2.8 |
| 21/02/2017 | 2.7 |
| 21/02/2017 | 2.7 |
| 21/02/2017 | 2.8 |
| 21/02/2017 | 3.1 |
| 21/02/2017 | 3.7 |
| 21/02/2017 | 4.3 |
| 21/02/2017 | 4.7 |
| 21/02/2017 | 4.8 |
| 21/02/2017 | 4.9 |
| 21/02/2017 | 5 |
| 21/02/2017 | 4.9 |
| 21/02/2017 | 4.8 |
| 21/02/2017 | 4.8 |
| 21/02/2017 | 4.7 |
| 21/02/2017 | 4.8 |
| 21/02/2017 | 5.1 |
| 21/02/2017 | 5.5 |
| 21/02/2017 | 5.3 |
| 21/02/2017 | 4.7 |
| 21/02/2017 | 4.1 |
| 21/02/2017 | 3.7 |
| 21/02/2017 | 3.3 |
| 21/02/2017 | 3 |
| 22/02/2017 | 2.8 |
| 22/02/2017 | 2.7 |
| 22/02/2017 | 2.7 |
| 22/02/2017 | 2.8 |
| 22/02/2017 | 3.1 |
| 22/02/2017 | 3.7 |
| 22/02/2017 | 4.3 |
| 22/02/2017 | 4.7 |
| 22/02/2017 | 4.9 |
| 22/02/2017 | 5 |
| 22/02/2017 | 5 |
| 22/02/2017 | 5 |
| 22/02/2017 | 4.9 |
| 22/02/2017 | 4.8 |
| 22/02/2017 | 4.7 |
| 22/02/2017 | 4.7 |
| 22/02/2017 | 5.1 |
| 22/02/2017 | 5.4 |
| 22/02/2017 | 5.3 |
| 22/02/2017 | 4.7 |
| 22/02/2017 | 4.1 |
| 22/02/2017 | 3.7 |
| 22/02/2017 | 3.3 |
| 22/02/2017 | 3 |
| 23/02/2017 | 2.8 |
| 23/02/2017 | 2.7 |
| 23/02/2017 | 2.7 |
| 23/02/2017 | 2.8 |
| 23/02/2017 | 3.1 |
| 23/02/2017 | 3.7 |
| 23/02/2017 | 4.3 |
| 23/02/2017 | 4.7 |
| 23/02/2017 | 4.8 |
| 23/02/2017 | 4.9 |
| 23/02/2017 | 4.9 |
| 23/02/2017 | 4.9 |
| 23/02/2017 | 4.8 |
| 23/02/2017 | 4.7 |
| 23/02/2017 | 4.7 |
| 23/02/2017 | 4.7 |
| 23/02/2017 | 5 |
| 23/02/2017 | 5.4 |
| 23/02/2017 | 5.3 |
| 23/02/2017 | 4.7 |
| 23/02/2017 | 4.1 |
| 23/02/2017 | 3.7 |
| 23/02/2017 | 3.3 |
| 23/02/2017 | 3 |
| 24/02/2017 | 2.8 |
| 24/02/2017 | 2.7 |
| 24/02/2017 | 2.6 |
| 24/02/2017 | 2.7 |
| 24/02/2017 | 3 |
| 24/02/2017 | 3.7 |
| 24/02/2017 | 4.3 |
| 24/02/2017 | 4.6 |
| 24/02/2017 | 4.8 |
| 24/02/2017 | 4.9 |
| 24/02/2017 | 4.9 |
| 24/02/2017 | 4.9 |
| 24/02/2017 | 4.7 |
| 24/02/2017 | 4.6 |
| 24/02/2017 | 4.6 |
| 24/02/2017 | 4.6 |
| 24/02/2017 | 4.9 |
| 24/02/2017 | 5.2 |
| 24/02/2017 | 5.1 |
| 24/02/2017 | 4.5 |
| 24/02/2017 | 3.9 |
| 24/02/2017 | 3.6 |
| 24/02/2017 | 3.2 |
| 24/02/2017 | 2.9 |
| 25/02/2017 | 2.7 |
| 25/02/2017 | 2.6 |
| 25/02/2017 | 2.6 |
| 25/02/2017 | 2.6 |
| 25/02/2017 | 2.7 |
| 25/02/2017 | 2.8 |
| 25/02/2017 | 3.1 |
| 25/02/2017 | 3.5 |
| 25/02/2017 | 3.8 |
| 25/02/2017 | 4 |
| 25/02/2017 | 4.1 |
| 25/02/2017 | 4 |
| 25/02/2017 | 3.9 |
| 25/02/2017 | 3.8 |
| 25/02/2017 | 3.7 |
| 25/02/2017 | 3.7 |
| 25/02/2017 | 4 |
| 25/02/2017 | 4.4 |
| 25/02/2017 | 4.4 |
| 25/02/2017 | 4 |
| 25/02/2017 | 3.6 |
| 25/02/2017 | 3.3 |
| 25/02/2017 | 3 |
| 25/02/2017 | 2.8 |
| 26/02/2017 | 2.6 |
| 26/02/2017 | 2.5 |
| 26/02/2017 | 2.5 |
| 26/02/2017 | 2.5 |
| 26/02/2017 | 2.5 |
| 26/02/2017 | 2.6 |
| 26/02/2017 | 2.8 |
| 26/02/2017 | 3 |
| 26/02/2017 | 3.3 |
| 26/02/2017 | 3.4 |
| 26/02/2017 | 3.6 |
| 26/02/2017 | 3.6 |
| 26/02/2017 | 3.5 |
| 26/02/2017 | 3.4 |
| 26/02/2017 | 3.4 |
| 26/02/2017 | 3.4 |
| 26/02/2017 | 3.7 |
| 26/02/2017 | 4.2 |
| 26/02/2017 | 4.1 |
| 26/02/2017 | 3.8 |
| 26/02/2017 | 3.5 |
| 26/02/2017 | 3.3 |
| 26/02/2017 | 3 |
| 26/02/2017 | 2.8 |
| 27/02/2017 | 2.6 |
| 27/02/2017 | 2.5 |
| 27/02/2017 | 2.5 |
| 27/02/2017 | 2.6 |
| 27/02/2017 | 2.9 |
| 27/02/2017 | 3.6 |
| 27/02/2017 | 4.2 |
| 27/02/2017 | 4.5 |
| 27/02/2017 | 4.7 |
| 27/02/2017 | 4.8 |
| 27/02/2017 | 4.8 |
| 27/02/2017 | 4.8 |
| 27/02/2017 | 4.7 |
| 27/02/2017 | 4.7 |
| 27/02/2017 | 4.6 |
| 27/02/2017 | 4.6 |
| 27/02/2017 | 4.9 |
| 27/02/2017 | 5.3 |
| 27/02/2017 | 5.2 |
| 27/02/2017 | 4.6 |
| 27/02/2017 | 4 |
| 27/02/2017 | 3.6 |
| 27/02/2017 | 3.2 |
| 27/02/2017 | 2.9 |
| 28/02/2017 | 2.7 |
| 28/02/2017 | 2.6 |
| 28/02/2017 | 2.6 |
| 28/02/2017 | 2.7 |
| 28/02/2017 | 3 |
| 28/02/2017 | 3.6 |
| 28/02/2017 | 4.2 |
| 28/02/2017 | 4.6 |
| 28/02/2017 | 4.7 |
| 28/02/2017 | 4.8 |
| 28/02/2017 | 4.8 |
| 28/02/2017 | 4.8 |
| 28/02/2017 | 4.7 |
| 28/02/2017 | 4.7 |
| 28/02/2017 | 4.6 |
| 28/02/2017 | 4.6 |
| 28/02/2017 | 4.9 |
| 28/02/2017 | 5.3 |
| 28/02/2017 | 5.2 |
| 28/02/2017 | 4.6 |
| 28/02/2017 | 4 |
| 28/02/2017 | 3.6 |
| 28/02/2017 | 3.2 |
| 28/02/2017 | 2.9 |
| 01/03/2017 | 2.7 |
| 01/03/2017 | 2.6 |
| 01/03/2017 | 2.6 |
| 01/03/2017 | 2.7 |
| 01/03/2017 | 3 |
| 01/03/2017 | 3.7 |
| 01/03/2017 | 4.2 |
| 01/03/2017 | 4.6 |
| 01/03/2017 | 4.8 |
| 01/03/2017 | 4.8 |
| 01/03/2017 | 4.9 |
| 01/03/2017 | 4.8 |
| 01/03/2017 | 4.8 |
| 01/03/2017 | 4.7 |
| 01/03/2017 | 4.6 |
| 01/03/2017 | 4.6 |
| 01/03/2017 | 4.9 |
| 01/03/2017 | 5.3 |
| 01/03/2017 | 5.2 |
| 01/03/2017 | 4.6 |
| 01/03/2017 | 4 |
| 01/03/2017 | 3.6 |
| 01/03/2017 | 3.2 |
| 01/03/2017 | 2.9 |
| 02/03/2017 | 2.7 |
| 02/03/2017 | 2.6 |
| 02/03/2017 | 2.6 |
| 02/03/2017 | 2.7 |
| 02/03/2017 | 3 |
| 02/03/2017 | 3.6 |
| 02/03/2017 | 4.2 |
| 02/03/2017 | 4.6 |
| 02/03/2017 | 4.7 |
| 02/03/2017 | 4.8 |
| 02/03/2017 | 4.8 |
| 02/03/2017 | 4.8 |
| 02/03/2017 | 4.7 |
| 02/03/2017 | 4.6 |
| 02/03/2017 | 4.6 |
| 02/03/2017 | 4.5 |
| 02/03/2017 | 4.8 |
| 02/03/2017 | 5.2 |
| 02/03/2017 | 5.2 |
| 02/03/2017 | 4.6 |
| 02/03/2017 | 4 |
| 02/03/2017 | 3.6 |
| 02/03/2017 | 3.2 |
| 02/03/2017 | 2.9 |
| 03/03/2017 | 2.7 |
| 03/03/2017 | 2.6 |
| 03/03/2017 | 2.6 |
| 03/03/2017 | 2.7 |
| 03/03/2017 | 3 |
| 03/03/2017 | 3.6 |
| 03/03/2017 | 4.2 |
| 03/03/2017 | 4.5 |
| 03/03/2017 | 4.7 |
| 03/03/2017 | 4.8 |
| 03/03/2017 | 4.8 |
| 03/03/2017 | 4.8 |
| 03/03/2017 | 4.6 |
| 03/03/2017 | 4.5 |
| 03/03/2017 | 4.4 |
| 03/03/2017 | 4.4 |
| 03/03/2017 | 4.7 |
| 03/03/2017 | 5.1 |
| 03/03/2017 | 5 |
| 03/03/2017 | 4.4 |
| 03/03/2017 | 3.8 |
| 03/03/2017 | 3.5 |
| 03/03/2017 | 3.1 |
| 03/03/2017 | 2.9 |
| 04/03/2017 | 2.7 |
| 04/03/2017 | 2.6 |
| 04/03/2017 | 2.5 |
| 04/03/2017 | 2.5 |
| 04/03/2017 | 2.6 |
| 04/03/2017 | 2.8 |
| 04/03/2017 | 3 |
| 04/03/2017 | 3.4 |
| 04/03/2017 | 3.7 |
| 04/03/2017 | 3.9 |
| 04/03/2017 | 4 |
| 04/03/2017 | 3.9 |
| 04/03/2017 | 3.8 |
| 04/03/2017 | 3.7 |
| 04/03/2017 | 3.6 |
| 04/03/2017 | 3.6 |
| 04/03/2017 | 3.9 |
| 04/03/2017 | 4.3 |
| 04/03/2017 | 4.4 |
| 04/03/2017 | 3.9 |
| 04/03/2017 | 3.5 |
| 04/03/2017 | 3.2 |
| 04/03/2017 | 3 |
| 04/03/2017 | 2.7 |
| 05/03/2017 | 2.6 |
| 05/03/2017 | 2.5 |
| 05/03/2017 | 2.5 |
| 05/03/2017 | 2.4 |
| 05/03/2017 | 2.5 |
| 05/03/2017 | 2.6 |
| 05/03/2017 | 2.7 |
| 05/03/2017 | 2.9 |
| 05/03/2017 | 3.2 |
| 05/03/2017 | 3.4 |
| 05/03/2017 | 3.5 |
| 05/03/2017 | 3.5 |
| 05/03/2017 | 3.4 |
| 05/03/2017 | 3.4 |
| 05/03/2017 | 3.3 |
| 05/03/2017 | 3.3 |
| 05/03/2017 | 3.6 |
| 05/03/2017 | 4 |
| 05/03/2017 | 4.1 |
| 05/03/2017 | 3.8 |
| 05/03/2017 | 3.5 |
| 05/03/2017 | 3.3 |
| 05/03/2017 | 3 |
| 05/03/2017 | 2.7 |
| 06/03/2017 | 2.6 |
| 06/03/2017 | 2.5 |
| 06/03/2017 | 2.5 |
| 06/03/2017 | 2.6 |
| 06/03/2017 | 2.9 |
| 06/03/2017 | 3.5 |
| 06/03/2017 | 4.1 |
| 06/03/2017 | 4.4 |
| 06/03/2017 | 4.6 |
| 06/03/2017 | 4.7 |
| 06/03/2017 | 4.7 |
| 06/03/2017 | 4.7 |
| 06/03/2017 | 4.6 |
| 06/03/2017 | 4.6 |
| 06/03/2017 | 4.5 |
| 06/03/2017 | 4.5 |
| 06/03/2017 | 4.7 |
| 06/03/2017 | 5.1 |
| 06/03/2017 | 5.1 |
| 06/03/2017 | 4.5 |
| 06/03/2017 | 4 |
| 06/03/2017 | 3.5 |
| 06/03/2017 | 3.1 |
| 06/03/2017 | 2.8 |
| 07/03/2017 | 2.7 |
| 07/03/2017 | 2.6 |
| 07/03/2017 | 2.6 |
| 07/03/2017 | 2.7 |
| 07/03/2017 | 3 |
| 07/03/2017 | 3.6 |
| 07/03/2017 | 4.1 |
| 07/03/2017 | 4.5 |
| 07/03/2017 | 4.6 |
| 07/03/2017 | 4.7 |
| 07/03/2017 | 4.7 |
| 07/03/2017 | 4.7 |
| 07/03/2017 | 4.6 |
| 07/03/2017 | 4.6 |
| 07/03/2017 | 4.5 |
| 07/03/2017 | 4.5 |
| 07/03/2017 | 4.7 |
| 07/03/2017 | 5.2 |
| 07/03/2017 | 5.2 |
| 07/03/2017 | 4.6 |
| 07/03/2017 | 4 |
| 07/03/2017 | 3.5 |
| 07/03/2017 | 3.1 |
| 07/03/2017 | 2.9 |
| 08/03/2017 | 2.7 |
| 08/03/2017 | 2.6 |
| 08/03/2017 | 2.6 |
| 08/03/2017 | 2.7 |
| 08/03/2017 | 3 |
| 08/03/2017 | 3.6 |
| 08/03/2017 | 4.1 |
| 08/03/2017 | 4.5 |
| 08/03/2017 | 4.7 |
| 08/03/2017 | 4.7 |
| 08/03/2017 | 4.8 |
| 08/03/2017 | 4.7 |
| 08/03/2017 | 4.7 |
| 08/03/2017 | 4.6 |
| 08/03/2017 | 4.5 |
| 08/03/2017 | 4.5 |
| 08/03/2017 | 4.7 |
| 08/03/2017 | 5.2 |
| 08/03/2017 | 5.2 |
| 08/03/2017 | 4.6 |
| 08/03/2017 | 4 |
| 08/03/2017 | 3.5 |
| 08/03/2017 | 3.1 |
| 08/03/2017 | 2.9 |
| 09/03/2017 | 2.7 |
| 09/03/2017 | 2.6 |
| 09/03/2017 | 2.6 |
| 09/03/2017 | 2.7 |
| 09/03/2017 | 3 |
| 09/03/2017 | 3.6 |
| 09/03/2017 | 4.1 |
| 09/03/2017 | 4.5 |
| 09/03/2017 | 4.6 |
| 09/03/2017 | 4.7 |
| 09/03/2017 | 4.7 |
| 09/03/2017 | 4.7 |
| 09/03/2017 | 4.6 |
| 09/03/2017 | 4.5 |
| 09/03/2017 | 4.4 |
| 09/03/2017 | 4.4 |
| 09/03/2017 | 4.6 |
| 09/03/2017 | 5.1 |
| 09/03/2017 | 5.1 |
| 09/03/2017 | 4.5 |
| 09/03/2017 | 3.9 |
| 09/03/2017 | 3.5 |
| 09/03/2017 | 3.1 |
| 09/03/2017 | 2.8 |
| 10/03/2017 | 2.7 |
| 10/03/2017 | 2.6 |
| 10/03/2017 | 2.6 |
| 10/03/2017 | 2.7 |
| 10/03/2017 | 2.9 |
| 10/03/2017 | 3.5 |
| 10/03/2017 | 4.1 |
| 10/03/2017 | 4.4 |
| 10/03/2017 | 4.6 |
| 10/03/2017 | 4.7 |
| 10/03/2017 | 4.7 |
| 10/03/2017 | 4.6 |
| 10/03/2017 | 4.5 |
| 10/03/2017 | 4.4 |
| 10/03/2017 | 4.3 |
| 10/03/2017 | 4.3 |
| 10/03/2017 | 4.5 |
| 10/03/2017 | 4.9 |
| 10/03/2017 | 4.9 |
| 10/03/2017 | 4.3 |
| 10/03/2017 | 3.8 |
| 10/03/2017 | 3.4 |
| 10/03/2017 | 3.1 |
| 10/03/2017 | 2.8 |
| 11/03/2017 | 2.6 |
| 11/03/2017 | 2.5 |
| 11/03/2017 | 2.5 |
| 11/03/2017 | 2.5 |
| 11/03/2017 | 2.6 |
| 11/03/2017 | 2.7 |
| 11/03/2017 | 2.9 |
| 11/03/2017 | 3.3 |
| 11/03/2017 | 3.6 |
| 11/03/2017 | 3.8 |
| 11/03/2017 | 3.9 |
| 11/03/2017 | 3.8 |
| 11/03/2017 | 3.7 |
| 11/03/2017 | 3.6 |
| 11/03/2017 | 3.5 |
| 11/03/2017 | 3.5 |
| 11/03/2017 | 3.7 |
| 11/03/2017 | 4.2 |
| 11/03/2017 | 4.3 |
| 11/03/2017 | 3.9 |
| 11/03/2017 | 3.4 |
| 11/03/2017 | 3.2 |
| 11/03/2017 | 2.9 |
| 11/03/2017 | 2.7 |
| 12/03/2017 | 2.5 |
| 12/03/2017 | 2.5 |
| 12/03/2017 | 2.4 |
| 12/03/2017 | 2.4 |
| 12/03/2017 | 2.4 |
| 12/03/2017 | 2.5 |
| 12/03/2017 | 2.6 |
| 12/03/2017 | 2.9 |
| 12/03/2017 | 3.1 |
| 12/03/2017 | 3.3 |
| 12/03/2017 | 3.4 |
| 12/03/2017 | 3.5 |
| 12/03/2017 | 3.4 |
| 12/03/2017 | 3.3 |
| 12/03/2017 | 3.2 |
| 12/03/2017 | 3.2 |
| 12/03/2017 | 3.4 |
| 12/03/2017 | 3.9 |
| 12/03/2017 | 4 |
| 12/03/2017 | 3.7 |
| 12/03/2017 | 3.4 |
| 12/03/2017 | 3.2 |
| 12/03/2017 | 2.9 |
| 12/03/2017 | 2.7 |
| 13/03/2017 | 2.5 |
| 13/03/2017 | 2.5 |
| 13/03/2017 | 2.4 |
| 13/03/2017 | 2.6 |
| 13/03/2017 | 2.9 |
| 13/03/2017 | 3.5 |
| 13/03/2017 | 4 |
| 13/03/2017 | 4.3 |
| 13/03/2017 | 4.5 |
| 13/03/2017 | 4.6 |
| 13/03/2017 | 4.6 |
| 13/03/2017 | 4.6 |
| 13/03/2017 | 4.5 |
| 13/03/2017 | 4.4 |
| 13/03/2017 | 4.4 |
| 13/03/2017 | 4.3 |
| 13/03/2017 | 4.5 |
| 13/03/2017 | 5 |
| 13/03/2017 | 5.1 |
| 13/03/2017 | 4.5 |
| 13/03/2017 | 3.9 |
| 13/03/2017 | 3.5 |
| 13/03/2017 | 3.1 |
| 13/03/2017 | 2.8 |
| 14/03/2017 | 2.6 |
| 14/03/2017 | 2.5 |
| 14/03/2017 | 2.5 |
| 14/03/2017 | 2.6 |
| 14/03/2017 | 2.9 |
| 14/03/2017 | 3.5 |
| 14/03/2017 | 4 |
| 14/03/2017 | 4.4 |
| 14/03/2017 | 4.5 |
| 14/03/2017 | 4.6 |
| 14/03/2017 | 4.6 |
| 14/03/2017 | 4.6 |
| 14/03/2017 | 4.5 |
| 14/03/2017 | 4.4 |
| 14/03/2017 | 4.4 |
| 14/03/2017 | 4.4 |
| 14/03/2017 | 4.5 |
| 14/03/2017 | 5 |
| 14/03/2017 | 5.1 |
| 14/03/2017 | 4.5 |
| 14/03/2017 | 3.9 |
| 14/03/2017 | 3.5 |
| 14/03/2017 | 3.1 |
| 14/03/2017 | 2.8 |
| 15/03/2017 | 2.6 |
| 15/03/2017 | 2.5 |
| 15/03/2017 | 2.5 |
| 15/03/2017 | 2.6 |
| 15/03/2017 | 2.9 |
| 15/03/2017 | 3.5 |
| 15/03/2017 | 4 |
| 15/03/2017 | 4.4 |
| 15/03/2017 | 4.6 |
| 15/03/2017 | 4.6 |
| 15/03/2017 | 4.6 |
| 15/03/2017 | 4.6 |
| 15/03/2017 | 4.5 |
| 15/03/2017 | 4.5 |
| 15/03/2017 | 4.4 |
| 15/03/2017 | 4.3 |
| 15/03/2017 | 4.5 |
| 15/03/2017 | 5 |
| 15/03/2017 | 5.1 |
| 15/03/2017 | 4.5 |
| 15/03/2017 | 3.9 |
| 15/03/2017 | 3.5 |
| 15/03/2017 | 3.1 |
| 15/03/2017 | 2.8 |
| 16/03/2017 | 2.6 |
| 16/03/2017 | 2.5 |
| 16/03/2017 | 2.5 |
| 16/03/2017 | 2.6 |
| 16/03/2017 | 2.9 |
| 16/03/2017 | 3.5 |
| 16/03/2017 | 4 |
| 16/03/2017 | 4.4 |
| 16/03/2017 | 4.5 |
| 16/03/2017 | 4.6 |
| 16/03/2017 | 4.6 |
| 16/03/2017 | 4.6 |
| 16/03/2017 | 4.5 |
| 16/03/2017 | 4.4 |
| 16/03/2017 | 4.3 |
| 16/03/2017 | 4.3 |
| 16/03/2017 | 4.4 |
| 16/03/2017 | 5 |
| 16/03/2017 | 5 |
| 16/03/2017 | 4.5 |
| 16/03/2017 | 3.9 |
| 16/03/2017 | 3.4 |
| 16/03/2017 | 3.1 |
| 16/03/2017 | 2.8 |
| 17/03/2017 | 2.6 |
| 17/03/2017 | 2.5 |
| 17/03/2017 | 2.5 |
| 17/03/2017 | 2.6 |
| 17/03/2017 | 2.9 |
| 17/03/2017 | 3.5 |
| 17/03/2017 | 4 |
| 17/03/2017 | 4.3 |
| 17/03/2017 | 4.5 |
| 17/03/2017 | 4.6 |
| 17/03/2017 | 4.6 |
| 17/03/2017 | 4.6 |
| 17/03/2017 | 4.4 |
| 17/03/2017 | 4.3 |
| 17/03/2017 | 4.2 |
| 17/03/2017 | 4.2 |
| 17/03/2017 | 4.3 |
| 17/03/2017 | 4.8 |
| 17/03/2017 | 4.8 |
| 17/03/2017 | 4.3 |
| 17/03/2017 | 3.7 |
| 17/03/2017 | 3.3 |
| 17/03/2017 | 3 |
| 17/03/2017 | 2.8 |
| 18/03/2017 | 2.6 |
| 18/03/2017 | 2.5 |
| 18/03/2017 | 2.5 |
| 18/03/2017 | 2.5 |
| 18/03/2017 | 2.5 |
| 18/03/2017 | 2.7 |
| 18/03/2017 | 2.9 |
| 18/03/2017 | 3.2 |
| 18/03/2017 | 3.6 |
| 18/03/2017 | 3.7 |
| 18/03/2017 | 3.8 |
| 18/03/2017 | 3.8 |
| 18/03/2017 | 3.7 |
| 18/03/2017 | 3.6 |
| 18/03/2017 | 3.5 |
| 18/03/2017 | 3.5 |
| 18/03/2017 | 3.6 |
| 18/03/2017 | 4.1 |
| 18/03/2017 | 4.2 |
| 18/03/2017 | 3.8 |
| 18/03/2017 | 3.4 |
| 18/03/2017 | 3.1 |
| 18/03/2017 | 2.9 |
| 18/03/2017 | 2.6 |
| 19/03/2017 | 2.5 |
| 19/03/2017 | 2.4 |
| 19/03/2017 | 2.4 |
| 19/03/2017 | 2.4 |
| 19/03/2017 | 2.4 |
| 19/03/2017 | 2.5 |
| 19/03/2017 | 2.6 |
| 19/03/2017 | 2.8 |
| 19/03/2017 | 3.1 |
| 19/03/2017 | 3.2 |
| 19/03/2017 | 3.4 |
| 19/03/2017 | 3.4 |
| 19/03/2017 | 3.3 |
| 19/03/2017 | 3.2 |
| 19/03/2017 | 3.2 |
| 19/03/2017 | 3.2 |
| 19/03/2017 | 3.4 |
| 19/03/2017 | 3.8 |
| 19/03/2017 | 3.9 |
| 19/03/2017 | 3.7 |
| 19/03/2017 | 3.4 |
| 19/03/2017 | 3.1 |
| 19/03/2017 | 2.9 |
| 19/03/2017 | 2.6 |
| 20/03/2017 | 2.5 |
| 20/03/2017 | 2.4 |
| 20/03/2017 | 2.4 |
| 20/03/2017 | 2.5 |
| 20/03/2017 | 2.8 |
| 20/03/2017 | 3.4 |
| 20/03/2017 | 3.9 |
| 20/03/2017 | 4.3 |
| 20/03/2017 | 4.4 |
| 20/03/2017 | 4.5 |
| 20/03/2017 | 4.5 |
| 20/03/2017 | 4.5 |
| 20/03/2017 | 4.5 |
| 20/03/2017 | 4.4 |
| 20/03/2017 | 4.3 |
| 20/03/2017 | 4.3 |
| 20/03/2017 | 4.4 |
| 20/03/2017 | 4.9 |
| 20/03/2017 | 4.9 |
| 20/03/2017 | 4.4 |
| 20/03/2017 | 3.8 |
| 20/03/2017 | 3.4 |
| 20/03/2017 | 3 |
| 20/03/2017 | 2.8 |
| 21/03/2017 | 2.6 |
| 21/03/2017 | 2.5 |
| 21/03/2017 | 2.5 |
| 21/03/2017 | 2.6 |
| 21/03/2017 | 2.9 |
| 21/03/2017 | 3.5 |
| 21/03/2017 | 4 |
| 21/03/2017 | 4.3 |
| 21/03/2017 | 4.5 |
| 21/03/2017 | 4.6 |
| 21/03/2017 | 4.6 |
| 21/03/2017 | 4.5 |
| 21/03/2017 | 4.5 |
| 21/03/2017 | 4.4 |
| 21/03/2017 | 4.3 |
| 21/03/2017 | 4.4 |
| 21/03/2017 | 4.5 |
| 21/03/2017 | 4.9 |
| 21/03/2017 | 4.9 |
| 21/03/2017 | 4.4 |
| 21/03/2017 | 3.9 |
| 21/03/2017 | 3.4 |
| 21/03/2017 | 3 |
| 21/03/2017 | 2.8 |
| 22/03/2017 | 2.6 |
| 22/03/2017 | 2.5 |
| 22/03/2017 | 2.5 |
| 22/03/2017 | 2.6 |
| 22/03/2017 | 2.9 |
| 22/03/2017 | 3.5 |
| 22/03/2017 | 4 |
| 22/03/2017 | 4.4 |
| 22/03/2017 | 4.5 |
| 22/03/2017 | 4.6 |
| 22/03/2017 | 4.6 |
| 22/03/2017 | 4.6 |
| 22/03/2017 | 4.5 |
| 22/03/2017 | 4.5 |
| 22/03/2017 | 4.4 |
| 22/03/2017 | 4.4 |
| 22/03/2017 | 4.5 |
| 22/03/2017 | 4.9 |
| 22/03/2017 | 4.9 |
| 22/03/2017 | 4.4 |
| 22/03/2017 | 3.9 |
| 22/03/2017 | 3.4 |
| 22/03/2017 | 3 |
| 22/03/2017 | 2.8 |
| 23/03/2017 | 2.6 |
| 23/03/2017 | 2.5 |
| 23/03/2017 | 2.5 |
| 23/03/2017 | 2.6 |
| 23/03/2017 | 2.9 |
| 23/03/2017 | 3.5 |
| 23/03/2017 | 4 |
| 23/03/2017 | 4.3 |
| 23/03/2017 | 4.5 |
| 23/03/2017 | 4.6 |
| 23/03/2017 | 4.6 |
| 23/03/2017 | 4.6 |
| 23/03/2017 | 4.5 |
| 23/03/2017 | 4.4 |
| 23/03/2017 | 4.3 |
| 23/03/2017 | 4.3 |
| 23/03/2017 | 4.5 |
| 23/03/2017 | 4.8 |
| 23/03/2017 | 4.9 |
| 23/03/2017 | 4.4 |
| 23/03/2017 | 3.9 |
| 23/03/2017 | 3.4 |
| 23/03/2017 | 3 |
| 23/03/2017 | 2.8 |
| 24/03/2017 | 2.6 |
| 24/03/2017 | 2.5 |
| 24/03/2017 | 2.5 |
| 24/03/2017 | 2.6 |
| 24/03/2017 | 2.9 |
| 24/03/2017 | 3.4 |
| 24/03/2017 | 3.9 |
| 24/03/2017 | 4.3 |
| 24/03/2017 | 4.5 |
| 24/03/2017 | 4.6 |
| 24/03/2017 | 4.6 |
| 24/03/2017 | 4.5 |
| 24/03/2017 | 4.4 |
| 24/03/2017 | 4.3 |
| 24/03/2017 | 4.2 |
| 24/03/2017 | 4.2 |
| 24/03/2017 | 4.4 |
| 24/03/2017 | 4.7 |
| 24/03/2017 | 4.7 |
| 24/03/2017 | 4.2 |
| 24/03/2017 | 3.7 |
| 24/03/2017 | 3.3 |
| 24/03/2017 | 3 |
| 24/03/2017 | 2.7 |
| 25/03/2017 | 2.6 |
| 25/03/2017 | 2.5 |
| 25/03/2017 | 2.5 |
| 25/03/2017 | 2.5 |
| 25/03/2017 | 2.5 |
| 25/03/2017 | 2.7 |
| 25/03/2017 | 2.9 |
| 25/03/2017 | 3.2 |
| 25/03/2017 | 3.5 |
| 25/03/2017 | 3.7 |
| 25/03/2017 | 3.8 |
| 25/03/2017 | 3.7 |
| 25/03/2017 | 3.6 |
| 25/03/2017 | 3.5 |
| 25/03/2017 | 3.5 |
| 25/03/2017 | 3.5 |
| 25/03/2017 | 3.6 |
| 25/03/2017 | 4 |
| 25/03/2017 | 4 |
| 25/03/2017 | 3.8 |
| 25/03/2017 | 3.4 |
| 25/03/2017 | 3.1 |
| 25/03/2017 | 2.8 |
| 25/03/2017 | 2.7 |
| 26/03/2017 | 2.5 |
| 26/03/2017 | 0 |
| 26/03/2017 | 2.4 |
| 26/03/2017 | 2.4 |
| 26/03/2017 | 2.4 |
| 26/03/2017 | 2.5 |
| 26/03/2017 | 2.6 |
| 26/03/2017 | 2.9 |
| 26/03/2017 | 3.1 |
| 26/03/2017 | 3.3 |
| 26/03/2017 | 3.4 |
| 26/03/2017 | 3.5 |
| 26/03/2017 | 3.4 |
| 26/03/2017 | 3.3 |
| 26/03/2017 | 3.2 |
| 26/03/2017 | 3.2 |
| 26/03/2017 | 3.2 |
| 26/03/2017 | 3.6 |
| 26/03/2017 | 3.8 |
| 26/03/2017 | 3.7 |
| 26/03/2017 | 3.4 |
| 26/03/2017 | 3.2 |
| 26/03/2017 | 2.9 |
| 26/03/2017 | 2.7 |
| 27/03/2017 | 2.5 |
| 27/03/2017 | 2.4 |
| 27/03/2017 | 2.4 |
| 27/03/2017 | 2.5 |
| 27/03/2017 | 2.8 |
| 27/03/2017 | 3.4 |
| 27/03/2017 | 4 |
| 27/03/2017 | 4.3 |
| 27/03/2017 | 4.5 |
| 27/03/2017 | 4.6 |
| 27/03/2017 | 4.6 |
| 27/03/2017 | 4.6 |
| 27/03/2017 | 4.5 |
| 27/03/2017 | 4.4 |
| 27/03/2017 | 4.4 |
| 27/03/2017 | 4.3 |
| 27/03/2017 | 4.2 |
| 27/03/2017 | 4.6 |
| 27/03/2017 | 4.8 |
| 27/03/2017 | 4.5 |
| 27/03/2017 | 3.9 |
| 27/03/2017 | 3.5 |
| 27/03/2017 | 3.1 |
| 27/03/2017 | 2.8 |
| 28/03/2017 | 2.6 |
| 28/03/2017 | 2.5 |
| 28/03/2017 | 2.5 |
| 28/03/2017 | 2.6 |
| 28/03/2017 | 2.9 |
| 28/03/2017 | 3.5 |
| 28/03/2017 | 4 |
| 28/03/2017 | 4.4 |
| 28/03/2017 | 4.5 |
| 28/03/2017 | 4.6 |
| 28/03/2017 | 4.7 |
| 28/03/2017 | 4.7 |
| 28/03/2017 | 4.6 |
| 28/03/2017 | 4.5 |
| 28/03/2017 | 4.4 |
| 28/03/2017 | 4.3 |
| 28/03/2017 | 4.2 |
| 28/03/2017 | 4.6 |
| 28/03/2017 | 4.8 |
| 28/03/2017 | 4.5 |
| 28/03/2017 | 4 |
| 28/03/2017 | 3.5 |
| 28/03/2017 | 3.1 |
| 28/03/2017 | 2.8 |
| 29/03/2017 | 2.6 |
| 29/03/2017 | 2.5 |
| 29/03/2017 | 2.5 |
| 29/03/2017 | 2.6 |
| 29/03/2017 | 2.9 |
| 29/03/2017 | 3.5 |
| 29/03/2017 | 4 |
| 29/03/2017 | 4.4 |
| 29/03/2017 | 4.6 |
| 29/03/2017 | 4.7 |
| 29/03/2017 | 4.7 |
| 29/03/2017 | 4.7 |
| 29/03/2017 | 4.6 |
| 29/03/2017 | 4.5 |
| 29/03/2017 | 4.4 |
| 29/03/2017 | 4.3 |
| 29/03/2017 | 4.2 |
| 29/03/2017 | 4.6 |
| 29/03/2017 | 4.8 |
| 29/03/2017 | 4.5 |
| 29/03/2017 | 4 |
| 29/03/2017 | 3.5 |
| 29/03/2017 | 3.1 |
| 29/03/2017 | 2.8 |
| 30/03/2017 | 2.6 |
| 30/03/2017 | 2.5 |
| 30/03/2017 | 2.5 |
| 30/03/2017 | 2.6 |
| 30/03/2017 | 2.9 |
| 30/03/2017 | 3.5 |
| 30/03/2017 | 4 |
| 30/03/2017 | 4.4 |
| 30/03/2017 | 4.5 |
| 30/03/2017 | 4.6 |
| 30/03/2017 | 4.7 |
| 30/03/2017 | 4.7 |
| 30/03/2017 | 4.6 |
| 30/03/2017 | 4.5 |
| 30/03/2017 | 4.4 |
| 30/03/2017 | 4.3 |
| 30/03/2017 | 4.2 |
| 30/03/2017 | 4.6 |
| 30/03/2017 | 4.7 |
| 30/03/2017 | 4.5 |
| 30/03/2017 | 3.9 |
| 30/03/2017 | 3.5 |
| 30/03/2017 | 3.1 |
| 30/03/2017 | 2.8 |
| 31/03/2017 | 2.6 |
| 31/03/2017 | 2.5 |
| 31/03/2017 | 2.5 |
| 31/03/2017 | 2.6 |
| 31/03/2017 | 2.9 |
| 31/03/2017 | 3.4 |
| 31/03/2017 | 4 |
| 31/03/2017 | 4.3 |
| 31/03/2017 | 4.5 |
| 31/03/2017 | 4.6 |
| 31/03/2017 | 4.7 |
| 31/03/2017 | 4.6 |
| 31/03/2017 | 4.5 |
| 31/03/2017 | 4.4 |
| 31/03/2017 | 4.3 |
| 31/03/2017 | 4.2 |
| 31/03/2017 | 4.1 |
| 31/03/2017 | 4.4 |
| 31/03/2017 | 4.5 |
| 31/03/2017 | 4.3 |
| 31/03/2017 | 3.8 |
| 31/03/2017 | 3.4 |
| 31/03/2017 | 3.1 |
| 31/03/2017 | 2.8 |
| 01/04/2017 | 2.6 |
| 01/04/2017 | 2.5 |
| 01/04/2017 | 2.5 |
| 01/04/2017 | 2.5 |
| 01/04/2017 | 2.5 |
| 01/04/2017 | 2.7 |
| 01/04/2017 | 2.9 |
| 01/04/2017 | 3.2 |
| 01/04/2017 | 3.6 |
| 01/04/2017 | 3.8 |
| 01/04/2017 | 3.9 |
| 01/04/2017 | 3.8 |
| 01/04/2017 | 3.7 |
| 01/04/2017 | 3.6 |
| 01/04/2017 | 3.5 |
| 01/04/2017 | 3.4 |
| 01/04/2017 | 3.4 |
| 01/04/2017 | 3.7 |
| 01/04/2017 | 3.9 |
| 01/04/2017 | 3.8 |
| 01/04/2017 | 3.5 |
| 01/04/2017 | 3.2 |
| 01/04/2017 | 2.9 |
| 01/04/2017 | 2.6 |
| 02/04/2017 | 2.5 |
| 02/04/2017 | 2.4 |
| 02/04/2017 | 2.4 |
| 02/04/2017 | 2.4 |
| 02/04/2017 | 2.4 |
| 02/04/2017 | 2.5 |
| 02/04/2017 | 2.6 |
| 02/04/2017 | 2.8 |
| 02/04/2017 | 3.1 |
| 02/04/2017 | 3.3 |
| 02/04/2017 | 3.4 |
| 02/04/2017 | 3.5 |
| 02/04/2017 | 3.4 |
| 02/04/2017 | 3.3 |
| 02/04/2017 | 3.2 |
| 02/04/2017 | 3.2 |
| 02/04/2017 | 3.2 |
| 02/04/2017 | 3.5 |
| 02/04/2017 | 3.7 |
| 02/04/2017 | 3.7 |
| 02/04/2017 | 3.4 |
| 02/04/2017 | 3.2 |
| 02/04/2017 | 2.9 |
| 02/04/2017 | 2.7 |
| 03/04/2017 | 2.5 |
| 03/04/2017 | 2.4 |
| 03/04/2017 | 2.4 |
| 03/04/2017 | 2.5 |
| 03/04/2017 | 2.8 |
| 03/04/2017 | 3.4 |
| 03/04/2017 | 3.9 |
| 03/04/2017 | 4.3 |
| 03/04/2017 | 4.4 |
| 03/04/2017 | 4.6 |
| 03/04/2017 | 4.6 |
| 03/04/2017 | 4.6 |
| 03/04/2017 | 4.5 |
| 03/04/2017 | 4.4 |
| 03/04/2017 | 4.4 |
| 03/04/2017 | 4.3 |
| 03/04/2017 | 4.2 |
| 03/04/2017 | 4.5 |
| 03/04/2017 | 4.6 |
| 03/04/2017 | 4.4 |
| 03/04/2017 | 3.9 |
| 03/04/2017 | 3.5 |
| 03/04/2017 | 3.1 |
| 03/04/2017 | 2.8 |
| 04/04/2017 | 2.6 |
| 04/04/2017 | 2.5 |
| 04/04/2017 | 2.5 |
| 04/04/2017 | 2.6 |
| 04/04/2017 | 2.9 |
| 04/04/2017 | 3.4 |
| 04/04/2017 | 4 |
| 04/04/2017 | 4.3 |
| 04/04/2017 | 4.5 |
| 04/04/2017 | 4.6 |
| 04/04/2017 | 4.6 |
| 04/04/2017 | 4.6 |
| 04/04/2017 | 4.5 |
| 04/04/2017 | 4.4 |
| 04/04/2017 | 4.4 |
| 04/04/2017 | 4.3 |
| 04/04/2017 | 4.3 |
| 04/04/2017 | 4.5 |
| 04/04/2017 | 4.6 |
| 04/04/2017 | 4.5 |
| 04/04/2017 | 4 |
| 04/04/2017 | 3.5 |
| 04/04/2017 | 3.1 |
| 04/04/2017 | 2.8 |
| 05/04/2017 | 2.6 |
| 05/04/2017 | 2.5 |
| 05/04/2017 | 2.5 |
| 05/04/2017 | 2.6 |
| 05/04/2017 | 2.9 |
| 05/04/2017 | 3.5 |
| 05/04/2017 | 4 |
| 05/04/2017 | 4.4 |
| 05/04/2017 | 4.5 |
| 05/04/2017 | 4.6 |
| 05/04/2017 | 4.7 |
| 05/04/2017 | 4.7 |
| 05/04/2017 | 4.6 |
| 05/04/2017 | 4.5 |
| 05/04/2017 | 4.4 |
| 05/04/2017 | 4.3 |
| 05/04/2017 | 4.3 |
| 05/04/2017 | 4.5 |
| 05/04/2017 | 4.6 |
| 05/04/2017 | 4.4 |
| 05/04/2017 | 4 |
| 05/04/2017 | 3.5 |
| 05/04/2017 | 3.1 |
| 05/04/2017 | 2.8 |
| 06/04/2017 | 2.6 |
| 06/04/2017 | 2.5 |
| 06/04/2017 | 2.5 |
| 06/04/2017 | 2.6 |
| 06/04/2017 | 2.9 |
| 06/04/2017 | 3.4 |
| 06/04/2017 | 4 |
| 06/04/2017 | 4.3 |
| 06/04/2017 | 4.5 |
| 06/04/2017 | 4.6 |
| 06/04/2017 | 4.6 |
| 06/04/2017 | 4.6 |
| 06/04/2017 | 4.5 |
| 06/04/2017 | 4.4 |
| 06/04/2017 | 4.4 |
| 06/04/2017 | 4.3 |
| 06/04/2017 | 4.2 |
| 06/04/2017 | 4.5 |
| 06/04/2017 | 4.6 |
| 06/04/2017 | 4.4 |
| 06/04/2017 | 3.9 |
| 06/04/2017 | 3.5 |
| 06/04/2017 | 3.1 |
| 06/04/2017 | 2.8 |
| 07/04/2017 | 2.6 |
| 07/04/2017 | 2.5 |
| 07/04/2017 | 2.5 |
| 07/04/2017 | 2.6 |
| 07/04/2017 | 2.9 |
| 07/04/2017 | 3.4 |
| 07/04/2017 | 3.9 |
| 07/04/2017 | 4.3 |
| 07/04/2017 | 4.5 |
| 07/04/2017 | 4.6 |
| 07/04/2017 | 4.6 |
| 07/04/2017 | 4.6 |
| 07/04/2017 | 4.5 |
| 07/04/2017 | 4.4 |
| 07/04/2017 | 4.3 |
| 07/04/2017 | 4.2 |
| 07/04/2017 | 4.1 |
| 07/04/2017 | 4.3 |
| 07/04/2017 | 4.4 |
| 07/04/2017 | 4.2 |
| 07/04/2017 | 3.8 |
| 07/04/2017 | 3.4 |
| 07/04/2017 | 3 |
| 07/04/2017 | 2.7 |
| 08/04/2017 | 2.6 |
| 08/04/2017 | 2.5 |
| 08/04/2017 | 2.4 |
| 08/04/2017 | 2.5 |
| 08/04/2017 | 2.5 |
| 08/04/2017 | 2.6 |
| 08/04/2017 | 2.9 |
| 08/04/2017 | 3.2 |
| 08/04/2017 | 3.5 |
| 08/04/2017 | 3.8 |
| 08/04/2017 | 3.8 |
| 08/04/2017 | 3.8 |
| 08/04/2017 | 3.7 |
| 08/04/2017 | 3.6 |
| 08/04/2017 | 3.5 |
| 08/04/2017 | 3.4 |
| 08/04/2017 | 3.4 |
| 08/04/2017 | 3.6 |
| 08/04/2017 | 3.8 |
| 08/04/2017 | 3.8 |
| 08/04/2017 | 3.5 |
| 08/04/2017 | 3.1 |
| 08/04/2017 | 2.9 |
| 08/04/2017 | 2.6 |
| 09/04/2017 | 2.5 |
| 09/04/2017 | 2.4 |
| 09/04/2017 | 2.4 |
| 09/04/2017 | 2.4 |
| 09/04/2017 | 2.4 |
| 09/04/2017 | 2.4 |
| 09/04/2017 | 2.6 |
| 09/04/2017 | 2.8 |
| 09/04/2017 | 3.1 |
| 09/04/2017 | 3.2 |
| 09/04/2017 | 3.4 |
| 09/04/2017 | 3.4 |
| 09/04/2017 | 3.4 |
| 09/04/2017 | 3.2 |
| 09/04/2017 | 3.2 |
| 09/04/2017 | 3.2 |
| 09/04/2017 | 3.2 |
| 09/04/2017 | 3.4 |
| 09/04/2017 | 3.5 |
| 09/04/2017 | 3.6 |
| 09/04/2017 | 3.4 |
| 09/04/2017 | 3.2 |
| 09/04/2017 | 2.9 |
| 09/04/2017 | 2.6 |
| 10/04/2017 | 2.5 |
| 10/04/2017 | 2.4 |
| 10/04/2017 | 2.4 |
| 10/04/2017 | 2.5 |
| 10/04/2017 | 2.8 |
| 10/04/2017 | 3.2 |
| 10/04/2017 | 3.7 |
| 10/04/2017 | 4.1 |
| 10/04/2017 | 4.3 |
| 10/04/2017 | 4.4 |
| 10/04/2017 | 4.5 |
| 10/04/2017 | 4.5 |
| 10/04/2017 | 4.4 |
| 10/04/2017 | 4.3 |
| 10/04/2017 | 4.2 |
| 10/04/2017 | 4.2 |
| 10/04/2017 | 4.1 |
| 10/04/2017 | 4.3 |
| 10/04/2017 | 4.3 |
| 10/04/2017 | 4.2 |
| 10/04/2017 | 3.8 |
| 10/04/2017 | 3.4 |
| 10/04/2017 | 3 |
| 10/04/2017 | 2.7 |
| 11/04/2017 | 2.6 |
| 11/04/2017 | 2.5 |
| 11/04/2017 | 2.5 |
| 11/04/2017 | 2.6 |
| 11/04/2017 | 2.8 |
| 11/04/2017 | 3.3 |
| 11/04/2017 | 3.7 |
| 11/04/2017 | 4.1 |
| 11/04/2017 | 4.3 |
| 11/04/2017 | 4.5 |
| 11/04/2017 | 4.5 |
| 11/04/2017 | 4.5 |
| 11/04/2017 | 4.4 |
| 11/04/2017 | 4.3 |
| 11/04/2017 | 4.2 |
| 11/04/2017 | 4.2 |
| 11/04/2017 | 4.2 |
| 11/04/2017 | 4.3 |
| 11/04/2017 | 4.4 |
| 11/04/2017 | 4.3 |
| 11/04/2017 | 3.9 |
| 11/04/2017 | 3.4 |
| 11/04/2017 | 3 |
| 11/04/2017 | 2.8 |
| 12/04/2017 | 2.6 |
| 12/04/2017 | 2.5 |
| 12/04/2017 | 2.5 |
| 12/04/2017 | 2.6 |
| 12/04/2017 | 2.8 |
| 12/04/2017 | 3.3 |
| 12/04/2017 | 3.8 |
| 12/04/2017 | 4.2 |
| 12/04/2017 | 4.4 |
| 12/04/2017 | 4.5 |
| 12/04/2017 | 4.6 |
| 12/04/2017 | 4.6 |
| 12/04/2017 | 4.5 |
| 12/04/2017 | 4.4 |
| 12/04/2017 | 4.3 |
| 12/04/2017 | 4.2 |
| 12/04/2017 | 4.2 |
| 12/04/2017 | 4.3 |
| 12/04/2017 | 4.3 |
| 12/04/2017 | 4.2 |
| 12/04/2017 | 3.9 |
| 12/04/2017 | 3.4 |
| 12/04/2017 | 3 |
| 12/04/2017 | 2.8 |
| 13/04/2017 | 2.6 |
| 13/04/2017 | 2.5 |
| 13/04/2017 | 2.5 |
| 13/04/2017 | 2.6 |
| 13/04/2017 | 2.8 |
| 13/04/2017 | 3.3 |
| 13/04/2017 | 3.8 |
| 13/04/2017 | 4.1 |
| 13/04/2017 | 4.3 |
| 13/04/2017 | 4.5 |
| 13/04/2017 | 4.5 |
| 13/04/2017 | 4.5 |
| 13/04/2017 | 4.4 |
| 13/04/2017 | 4.3 |
| 13/04/2017 | 4.2 |
| 13/04/2017 | 4.2 |
| 13/04/2017 | 4.2 |
| 13/04/2017 | 4.2 |
| 13/04/2017 | 4.3 |
| 13/04/2017 | 4.2 |
| 13/04/2017 | 3.8 |
| 13/04/2017 | 3.4 |
| 13/04/2017 | 3 |
| 13/04/2017 | 2.7 |
| 14/04/2017 | 2.5 |
| 14/04/2017 | 2.4 |
| 14/04/2017 | 2.4 |
| 14/04/2017 | 2.4 |
| 14/04/2017 | 2.4 |
| 14/04/2017 | 2.4 |
| 14/04/2017 | 2.5 |
| 14/04/2017 | 2.8 |
| 14/04/2017 | 3.1 |
| 14/04/2017 | 3.3 |
| 14/04/2017 | 3.4 |
| 14/04/2017 | 3.4 |
| 14/04/2017 | 3.3 |
| 14/04/2017 | 3.2 |
| 14/04/2017 | 3.1 |
| 14/04/2017 | 3.1 |
| 14/04/2017 | 3.1 |
| 14/04/2017 | 3.2 |
| 14/04/2017 | 3.3 |
| 14/04/2017 | 3.4 |
| 14/04/2017 | 3.2 |
| 14/04/2017 | 3 |
| 14/04/2017 | 2.8 |
| 14/04/2017 | 2.7 |
| 15/04/2017 | 2.5 |
| 15/04/2017 | 2.5 |
| 15/04/2017 | 2.4 |
| 15/04/2017 | 2.4 |
| 15/04/2017 | 2.5 |
| 15/04/2017 | 2.5 |
| 15/04/2017 | 2.7 |
| 15/04/2017 | 3.1 |
| 15/04/2017 | 3.4 |
| 15/04/2017 | 3.7 |
| 15/04/2017 | 3.7 |
| 15/04/2017 | 3.7 |
| 15/04/2017 | 3.6 |
| 15/04/2017 | 3.5 |
| 15/04/2017 | 3.4 |
| 15/04/2017 | 3.4 |
| 15/04/2017 | 3.4 |
| 15/04/2017 | 3.5 |
| 15/04/2017 | 3.6 |
| 15/04/2017 | 3.6 |
| 15/04/2017 | 3.4 |
| 15/04/2017 | 3.1 |
| 15/04/2017 | 2.8 |
| 15/04/2017 | 2.5 |
| 16/04/2017 | 2.4 |
| 16/04/2017 | 2.3 |
| 16/04/2017 | 2.3 |
| 16/04/2017 | 2.3 |
| 16/04/2017 | 2.3 |
| 16/04/2017 | 2.4 |
| 16/04/2017 | 2.5 |
| 16/04/2017 | 2.7 |
| 16/04/2017 | 3 |
| 16/04/2017 | 3.1 |
| 16/04/2017 | 3.2 |
| 16/04/2017 | 3.2 |
| 16/04/2017 | 3.1 |
| 16/04/2017 | 3 |
| 16/04/2017 | 2.9 |
| 16/04/2017 | 2.9 |
| 16/04/2017 | 2.9 |
| 16/04/2017 | 3.1 |
| 16/04/2017 | 3.2 |
| 16/04/2017 | 3.2 |
| 16/04/2017 | 3.1 |
| 16/04/2017 | 3 |
| 16/04/2017 | 2.7 |
| 16/04/2017 | 2.5 |
| 17/04/2017 | 2.4 |
| 17/04/2017 | 2.3 |
| 17/04/2017 | 2.3 |
| 17/04/2017 | 2.3 |
| 17/04/2017 | 2.3 |
| 17/04/2017 | 2.4 |
| 17/04/2017 | 2.5 |
| 17/04/2017 | 2.7 |
| 17/04/2017 | 3 |
| 17/04/2017 | 3.1 |
| 17/04/2017 | 3.2 |
| 17/04/2017 | 3.2 |
| 17/04/2017 | 3.1 |
| 17/04/2017 | 3 |
| 17/04/2017 | 2.9 |
| 17/04/2017 | 2.9 |
| 17/04/2017 | 3 |
| 17/04/2017 | 3.1 |
| 17/04/2017 | 3.2 |
| 17/04/2017 | 3.2 |
| 17/04/2017 | 3.1 |
| 17/04/2017 | 2.9 |
| 17/04/2017 | 2.7 |
| 17/04/2017 | 2.7 |
| 18/04/2017 | 2.5 |
| 18/04/2017 | 2.5 |
| 18/04/2017 | 2.5 |
| 18/04/2017 | 2.6 |
| 18/04/2017 | 2.8 |
| 18/04/2017 | 3.4 |
| 18/04/2017 | 3.9 |
| 18/04/2017 | 4.3 |
| 18/04/2017 | 4.4 |
| 18/04/2017 | 4.5 |
| 18/04/2017 | 4.5 |
| 18/04/2017 | 4.6 |
| 18/04/2017 | 4.5 |
| 18/04/2017 | 4.4 |
| 18/04/2017 | 4.4 |
| 18/04/2017 | 4.3 |
| 18/04/2017 | 4.3 |
| 18/04/2017 | 4.3 |
| 18/04/2017 | 4.3 |
| 18/04/2017 | 4.3 |
| 18/04/2017 | 3.9 |
| 18/04/2017 | 3.4 |
| 18/04/2017 | 3 |
| 18/04/2017 | 2.7 |
| 19/04/2017 | 2.6 |
| 19/04/2017 | 2.5 |
| 19/04/2017 | 2.5 |
| 19/04/2017 | 2.6 |
| 19/04/2017 | 2.9 |
| 19/04/2017 | 3.4 |
| 19/04/2017 | 3.9 |
| 19/04/2017 | 4.3 |
| 19/04/2017 | 4.5 |
| 19/04/2017 | 4.6 |
| 19/04/2017 | 4.6 |
| 19/04/2017 | 4.6 |
| 19/04/2017 | 4.5 |
| 19/04/2017 | 4.5 |
| 19/04/2017 | 4.4 |
| 19/04/2017 | 4.3 |
| 19/04/2017 | 4.3 |
| 19/04/2017 | 4.3 |
| 19/04/2017 | 4.3 |
| 19/04/2017 | 4.3 |
| 19/04/2017 | 3.9 |
| 19/04/2017 | 3.4 |
| 19/04/2017 | 3 |
| 19/04/2017 | 2.7 |
| 20/04/2017 | 2.6 |
| 20/04/2017 | 2.5 |
| 20/04/2017 | 2.5 |
| 20/04/2017 | 2.6 |
| 20/04/2017 | 2.8 |
| 20/04/2017 | 3.4 |
| 20/04/2017 | 3.9 |
| 20/04/2017 | 4.3 |
| 20/04/2017 | 4.4 |
| 20/04/2017 | 4.5 |
| 20/04/2017 | 4.6 |
| 20/04/2017 | 4.6 |
| 20/04/2017 | 4.5 |
| 20/04/2017 | 4.4 |
| 20/04/2017 | 4.3 |
| 20/04/2017 | 4.3 |
| 20/04/2017 | 4.3 |
| 20/04/2017 | 4.2 |
| 20/04/2017 | 4.3 |
| 20/04/2017 | 4.2 |
| 20/04/2017 | 3.9 |
| 20/04/2017 | 3.4 |
| 20/04/2017 | 3 |
| 20/04/2017 | 2.7 |
| 21/04/2017 | 2.5 |
| 21/04/2017 | 2.5 |
| 21/04/2017 | 2.5 |
| 21/04/2017 | 2.6 |
| 21/04/2017 | 2.8 |
| 21/04/2017 | 3.3 |
| 21/04/2017 | 3.9 |
| 21/04/2017 | 4.2 |
| 21/04/2017 | 4.4 |
| 21/04/2017 | 4.5 |
| 21/04/2017 | 4.5 |
| 21/04/2017 | 4.5 |
| 21/04/2017 | 4.4 |
| 21/04/2017 | 4.3 |
| 21/04/2017 | 4.2 |
| 21/04/2017 | 4.2 |
| 21/04/2017 | 4.2 |
| 21/04/2017 | 4.1 |
| 21/04/2017 | 4.1 |
| 21/04/2017 | 4.1 |
| 21/04/2017 | 3.8 |
| 21/04/2017 | 3.3 |
| 21/04/2017 | 3 |
| 21/04/2017 | 2.7 |
| 22/04/2017 | 2.5 |
| 22/04/2017 | 2.5 |
| 22/04/2017 | 2.4 |
| 22/04/2017 | 2.4 |
| 22/04/2017 | 2.5 |
| 22/04/2017 | 2.6 |
| 22/04/2017 | 2.8 |
| 22/04/2017 | 3.2 |
| 22/04/2017 | 3.5 |
| 22/04/2017 | 3.7 |
| 22/04/2017 | 3.8 |
| 22/04/2017 | 3.8 |
| 22/04/2017 | 3.7 |
| 22/04/2017 | 3.5 |
| 22/04/2017 | 3.5 |
| 22/04/2017 | 3.5 |
| 22/04/2017 | 3.5 |
| 22/04/2017 | 3.5 |
| 22/04/2017 | 3.6 |
| 22/04/2017 | 3.6 |
| 22/04/2017 | 3.4 |
| 22/04/2017 | 3.1 |
| 22/04/2017 | 2.8 |
| 22/04/2017 | 2.6 |
| 23/04/2017 | 2.4 |
| 23/04/2017 | 2.4 |
| 23/04/2017 | 2.3 |
| 23/04/2017 | 2.3 |
| 23/04/2017 | 2.4 |
| 23/04/2017 | 2.4 |
| 23/04/2017 | 2.5 |
| 23/04/2017 | 2.8 |
| 23/04/2017 | 3 |
| 23/04/2017 | 3.2 |
| 23/04/2017 | 3.3 |
| 23/04/2017 | 3.4 |
| 23/04/2017 | 3.3 |
| 23/04/2017 | 3.2 |
| 23/04/2017 | 3.2 |
| 23/04/2017 | 3.2 |
| 23/04/2017 | 3.2 |
| 23/04/2017 | 3.3 |
| 23/04/2017 | 3.3 |
| 23/04/2017 | 3.5 |
| 23/04/2017 | 3.4 |
| 23/04/2017 | 3.1 |
| 23/04/2017 | 2.9 |
| 23/04/2017 | 2.6 |
| 24/04/2017 | 2.4 |
| 24/04/2017 | 2.4 |
| 24/04/2017 | 2.4 |
| 24/04/2017 | 2.5 |
| 24/04/2017 | 2.8 |
| 24/04/2017 | 3.3 |
| 24/04/2017 | 3.8 |
| 24/04/2017 | 4.2 |
| 24/04/2017 | 4.4 |
| 24/04/2017 | 4.5 |
| 24/04/2017 | 4.5 |
| 24/04/2017 | 4.5 |
| 24/04/2017 | 4.5 |
| 24/04/2017 | 4.4 |
| 24/04/2017 | 4.3 |
| 24/04/2017 | 4.3 |
| 24/04/2017 | 4.3 |
| 24/04/2017 | 4.2 |
| 24/04/2017 | 4.2 |
| 24/04/2017 | 4.2 |
| 24/04/2017 | 3.9 |
| 24/04/2017 | 3.4 |
| 24/04/2017 | 3 |
| 24/04/2017 | 2.7 |
| 25/04/2017 | 2.5 |
| 25/04/2017 | 2.5 |
| 25/04/2017 | 2.4 |
| 25/04/2017 | 2.6 |
| 25/04/2017 | 2.8 |
| 25/04/2017 | 3.3 |
| 25/04/2017 | 3.9 |
| 25/04/2017 | 4.2 |
| 25/04/2017 | 4.4 |
| 25/04/2017 | 4.5 |
| 25/04/2017 | 4.5 |
| 25/04/2017 | 4.6 |
| 25/04/2017 | 4.5 |
| 25/04/2017 | 4.4 |
| 25/04/2017 | 4.3 |
| 25/04/2017 | 4.3 |
| 25/04/2017 | 4.4 |
| 25/04/2017 | 4.3 |
| 25/04/2017 | 4.3 |
| 25/04/2017 | 4.2 |
| 25/04/2017 | 3.9 |
| 25/04/2017 | 3.4 |
| 25/04/2017 | 3 |
| 25/04/2017 | 2.7 |
| 26/04/2017 | 2.6 |
| 26/04/2017 | 2.5 |
| 26/04/2017 | 2.5 |
| 26/04/2017 | 2.6 |
| 26/04/2017 | 2.8 |
| 26/04/2017 | 3.4 |
| 26/04/2017 | 3.9 |
| 26/04/2017 | 4.3 |
| 26/04/2017 | 4.4 |
| 26/04/2017 | 4.5 |
| 26/04/2017 | 4.6 |
| 26/04/2017 | 4.6 |
| 26/04/2017 | 4.5 |
| 26/04/2017 | 4.5 |
| 26/04/2017 | 4.4 |
| 26/04/2017 | 4.3 |
| 26/04/2017 | 4.3 |
| 26/04/2017 | 4.3 |
| 26/04/2017 | 4.3 |
| 26/04/2017 | 4.2 |
| 26/04/2017 | 3.9 |
| 26/04/2017 | 3.4 |
| 26/04/2017 | 3 |
| 26/04/2017 | 2.7 |
| 27/04/2017 | 2.6 |
| 27/04/2017 | 2.5 |
| 27/04/2017 | 2.5 |
| 27/04/2017 | 2.6 |
| 27/04/2017 | 2.8 |
| 27/04/2017 | 3.3 |
| 27/04/2017 | 3.9 |
| 27/04/2017 | 4.2 |
| 27/04/2017 | 4.4 |
| 27/04/2017 | 4.5 |
| 27/04/2017 | 4.5 |
| 27/04/2017 | 4.6 |
| 27/04/2017 | 4.5 |
| 27/04/2017 | 4.4 |
| 27/04/2017 | 4.3 |
| 27/04/2017 | 4.3 |
| 27/04/2017 | 4.3 |
| 27/04/2017 | 4.2 |
| 27/04/2017 | 4.2 |
| 27/04/2017 | 4.2 |
| 27/04/2017 | 3.9 |
| 27/04/2017 | 3.4 |
| 27/04/2017 | 3 |
| 27/04/2017 | 2.7 |
| 28/04/2017 | 2.5 |
| 28/04/2017 | 2.5 |
| 28/04/2017 | 2.5 |
| 28/04/2017 | 2.6 |
| 28/04/2017 | 2.8 |
| 28/04/2017 | 3.3 |
| 28/04/2017 | 3.8 |
| 28/04/2017 | 4.2 |
| 28/04/2017 | 4.4 |
| 28/04/2017 | 4.5 |
| 28/04/2017 | 4.5 |
| 28/04/2017 | 4.5 |
| 28/04/2017 | 4.4 |
| 28/04/2017 | 4.3 |
| 28/04/2017 | 4.2 |
| 28/04/2017 | 4.2 |
| 28/04/2017 | 4.2 |
| 28/04/2017 | 4.1 |
| 28/04/2017 | 4.1 |
| 28/04/2017 | 4 |
| 28/04/2017 | 3.7 |
| 28/04/2017 | 3.3 |
| 28/04/2017 | 3 |
| 28/04/2017 | 2.7 |
| 29/04/2017 | 2.5 |
| 29/04/2017 | 2.4 |
| 29/04/2017 | 2.4 |
| 29/04/2017 | 2.4 |
| 29/04/2017 | 2.5 |
| 29/04/2017 | 2.6 |
| 29/04/2017 | 2.8 |
| 29/04/2017 | 3.2 |
| 29/04/2017 | 3.5 |
| 29/04/2017 | 3.7 |
| 29/04/2017 | 3.8 |
| 29/04/2017 | 3.8 |
| 29/04/2017 | 3.7 |
| 29/04/2017 | 3.5 |
| 29/04/2017 | 3.5 |
| 29/04/2017 | 3.4 |
| 29/04/2017 | 3.5 |
| 29/04/2017 | 3.5 |
| 29/04/2017 | 3.5 |
| 29/04/2017 | 3.6 |
| 29/04/2017 | 3.4 |
| 29/04/2017 | 3.1 |
| 29/04/2017 | 2.8 |
| 29/04/2017 | 2.6 |
| 30/04/2017 | 2.4 |
| 30/04/2017 | 2.4 |
| 30/04/2017 | 2.3 |
| 30/04/2017 | 2.3 |
| 30/04/2017 | 2.3 |
| 30/04/2017 | 2.4 |
| 30/04/2017 | 2.5 |
| 30/04/2017 | 2.8 |
| 30/04/2017 | 3 |
| 30/04/2017 | 3.2 |
| 30/04/2017 | 3.3 |
| 30/04/2017 | 3.4 |
| 30/04/2017 | 3.3 |
| 30/04/2017 | 3.2 |
| 30/04/2017 | 3.2 |
| 30/04/2017 | 3.2 |
| 30/04/2017 | 3.2 |
| 30/04/2017 | 3.3 |
| 30/04/2017 | 3.3 |
| 30/04/2017 | 3.4 |
| 30/04/2017 | 3.3 |
| 30/04/2017 | 3.1 |
| 30/04/2017 | 2.9 |
| 30/04/2017 | 2.7 |
| 01/05/2017 | 2.5 |
| 01/05/2017 | 2.4 |
| 01/05/2017 | 2.4 |
| 01/05/2017 | 2.4 |
| 01/05/2017 | 2.4 |
| 01/05/2017 | 2.5 |
| 01/05/2017 | 2.6 |
| 01/05/2017 | 2.9 |
| 01/05/2017 | 3.1 |
| 01/05/2017 | 3.3 |
| 01/05/2017 | 3.4 |
| 01/05/2017 | 3.4 |
| 01/05/2017 | 3.3 |
| 01/05/2017 | 3.2 |
| 01/05/2017 | 3.2 |
| 01/05/2017 | 3.2 |
| 01/05/2017 | 3.2 |
| 01/05/2017 | 3.2 |
| 01/05/2017 | 3.3 |
| 01/05/2017 | 3.3 |
| 01/05/2017 | 3.2 |
| 01/05/2017 | 3 |
| 01/05/2017 | 2.8 |
| 01/05/2017 | 2.7 |
| 02/05/2017 | 2.5 |
| 02/05/2017 | 2.4 |
| 02/05/2017 | 2.4 |
| 02/05/2017 | 2.6 |
| 02/05/2017 | 2.8 |
| 02/05/2017 | 3.3 |
| 02/05/2017 | 3.9 |
| 02/05/2017 | 4.2 |
| 02/05/2017 | 4.4 |
| 02/05/2017 | 4.5 |
| 02/05/2017 | 4.5 |
| 02/05/2017 | 4.6 |
| 02/05/2017 | 4.5 |
| 02/05/2017 | 4.4 |
| 02/05/2017 | 4.4 |
| 02/05/2017 | 4.3 |
| 02/05/2017 | 4.3 |
| 02/05/2017 | 4.3 |
| 02/05/2017 | 4.3 |
| 02/05/2017 | 4.2 |
| 02/05/2017 | 3.9 |
| 02/05/2017 | 3.4 |
| 02/05/2017 | 3 |
| 02/05/2017 | 2.7 |
| 03/05/2017 | 2.5 |
| 03/05/2017 | 2.5 |
| 03/05/2017 | 2.5 |
| 03/05/2017 | 2.6 |
| 03/05/2017 | 2.8 |
| 03/05/2017 | 3.3 |
| 03/05/2017 | 3.9 |
| 03/05/2017 | 4.3 |
| 03/05/2017 | 4.4 |
| 03/05/2017 | 4.5 |
| 03/05/2017 | 4.6 |
| 03/05/2017 | 4.6 |
| 03/05/2017 | 4.5 |
| 03/05/2017 | 4.5 |
| 03/05/2017 | 4.4 |
| 03/05/2017 | 4.3 |
| 03/05/2017 | 4.3 |
| 03/05/2017 | 4.3 |
| 03/05/2017 | 4.3 |
| 03/05/2017 | 4.1 |
| 03/05/2017 | 3.9 |
| 03/05/2017 | 3.4 |
| 03/05/2017 | 3 |
| 03/05/2017 | 2.7 |
| 04/05/2017 | 2.5 |
| 04/05/2017 | 2.5 |
| 04/05/2017 | 2.5 |
| 04/05/2017 | 2.6 |
| 04/05/2017 | 2.8 |
| 04/05/2017 | 3.3 |
| 04/05/2017 | 3.9 |
| 04/05/2017 | 4.2 |
| 04/05/2017 | 4.4 |
| 04/05/2017 | 4.5 |
| 04/05/2017 | 4.5 |
| 04/05/2017 | 4.6 |
| 04/05/2017 | 4.5 |
| 04/05/2017 | 4.4 |
| 04/05/2017 | 4.3 |
| 04/05/2017 | 4.3 |
| 04/05/2017 | 4.3 |
| 04/05/2017 | 4.3 |
| 04/05/2017 | 4.2 |
| 04/05/2017 | 4.1 |
| 04/05/2017 | 3.8 |
| 04/05/2017 | 3.4 |
| 04/05/2017 | 3 |
| 04/05/2017 | 2.7 |
| 05/05/2017 | 2.5 |
| 05/05/2017 | 2.5 |
| 05/05/2017 | 2.4 |
| 05/05/2017 | 2.6 |
| 05/05/2017 | 2.8 |
| 05/05/2017 | 3.3 |
| 05/05/2017 | 3.8 |
| 05/05/2017 | 4.2 |
| 05/05/2017 | 4.4 |
| 05/05/2017 | 4.5 |
| 05/05/2017 | 4.5 |
| 05/05/2017 | 4.5 |
| 05/05/2017 | 4.4 |
| 05/05/2017 | 4.3 |
| 05/05/2017 | 4.2 |
| 05/05/2017 | 4.2 |
| 05/05/2017 | 4.2 |
| 05/05/2017 | 4.1 |
| 05/05/2017 | 4.1 |
| 05/05/2017 | 3.9 |
| 05/05/2017 | 3.7 |
| 05/05/2017 | 3.3 |
| 05/05/2017 | 3 |
| 05/05/2017 | 2.7 |
| 06/05/2017 | 2.5 |
| 06/05/2017 | 2.4 |
| 06/05/2017 | 2.4 |
| 06/05/2017 | 2.4 |
| 06/05/2017 | 2.5 |
| 06/05/2017 | 2.6 |
| 06/05/2017 | 2.8 |
| 06/05/2017 | 3.1 |
| 06/05/2017 | 3.5 |
| 06/05/2017 | 3.7 |
| 06/05/2017 | 3.8 |
| 06/05/2017 | 3.8 |
| 06/05/2017 | 3.7 |
| 06/05/2017 | 3.5 |
| 06/05/2017 | 3.5 |
| 06/05/2017 | 3.4 |
| 06/05/2017 | 3.5 |
| 06/05/2017 | 3.5 |
| 06/05/2017 | 3.5 |
| 06/05/2017 | 3.5 |
| 06/05/2017 | 3.4 |
| 06/05/2017 | 3.1 |
| 06/05/2017 | 2.8 |
| 06/05/2017 | 2.6 |
| 07/05/2017 | 2.4 |
| 07/05/2017 | 2.4 |
| 07/05/2017 | 2.3 |
| 07/05/2017 | 2.3 |
| 07/05/2017 | 2.3 |
| 07/05/2017 | 2.4 |
| 07/05/2017 | 2.5 |
| 07/05/2017 | 2.7 |
| 07/05/2017 | 3 |
| 07/05/2017 | 3.2 |
| 07/05/2017 | 3.3 |
| 07/05/2017 | 3.4 |
| 07/05/2017 | 3.3 |
| 07/05/2017 | 3.2 |
| 07/05/2017 | 3.2 |
| 07/05/2017 | 3.2 |
| 07/05/2017 | 3.2 |
| 07/05/2017 | 3.3 |
| 07/05/2017 | 3.3 |
| 07/05/2017 | 3.4 |
| 07/05/2017 | 3.3 |
| 07/05/2017 | 3.1 |
| 07/05/2017 | 2.8 |
| 07/05/2017 | 2.6 |
| 08/05/2017 | 2.4 |
| 08/05/2017 | 2.4 |
| 08/05/2017 | 2.4 |
| 08/05/2017 | 2.5 |
| 08/05/2017 | 2.7 |
| 08/05/2017 | 3.3 |
| 08/05/2017 | 3.8 |
| 08/05/2017 | 4.2 |
| 08/05/2017 | 4.3 |
| 08/05/2017 | 4.4 |
| 08/05/2017 | 4.5 |
| 08/05/2017 | 4.5 |
| 08/05/2017 | 4.5 |
| 08/05/2017 | 4.4 |
| 08/05/2017 | 4.3 |
| 08/05/2017 | 4.3 |
| 08/05/2017 | 4.3 |
| 08/05/2017 | 4.2 |
| 08/05/2017 | 4.2 |
| 08/05/2017 | 4.1 |
| 08/05/2017 | 3.8 |
| 08/05/2017 | 3.4 |
| 08/05/2017 | 3 |
| 08/05/2017 | 2.7 |
| 09/05/2017 | 2.5 |
| 09/05/2017 | 2.4 |
| 09/05/2017 | 2.4 |
| 09/05/2017 | 2.5 |
| 09/05/2017 | 2.8 |
| 09/05/2017 | 3.3 |
| 09/05/2017 | 3.8 |
| 09/05/2017 | 4.2 |
| 09/05/2017 | 4.4 |
| 09/05/2017 | 4.5 |
| 09/05/2017 | 4.5 |
| 09/05/2017 | 4.6 |
| 09/05/2017 | 4.5 |
| 09/05/2017 | 4.4 |
| 09/05/2017 | 4.4 |
| 09/05/2017 | 4.3 |
| 09/05/2017 | 4.3 |
| 09/05/2017 | 4.3 |
| 09/05/2017 | 4.3 |
| 09/05/2017 | 4.1 |
| 09/05/2017 | 3.8 |
| 09/05/2017 | 3.4 |
| 09/05/2017 | 3 |
| 09/05/2017 | 2.7 |
| 10/05/2017 | 2.5 |
| 10/05/2017 | 2.5 |
| 10/05/2017 | 2.5 |
| 10/05/2017 | 2.6 |
| 10/05/2017 | 2.8 |
| 10/05/2017 | 3.3 |
| 10/05/2017 | 3.9 |
| 10/05/2017 | 4.2 |
| 10/05/2017 | 4.4 |
| 10/05/2017 | 4.5 |
| 10/05/2017 | 4.6 |
| 10/05/2017 | 4.6 |
| 10/05/2017 | 4.5 |
| 10/05/2017 | 4.5 |
| 10/05/2017 | 4.4 |
| 10/05/2017 | 4.3 |
| 10/05/2017 | 4.3 |
| 10/05/2017 | 4.3 |
| 10/05/2017 | 4.3 |
| 10/05/2017 | 4.1 |
| 10/05/2017 | 3.8 |
| 10/05/2017 | 3.4 |
| 10/05/2017 | 3 |
| 10/05/2017 | 2.7 |
| 11/05/2017 | 2.5 |
| 11/05/2017 | 2.5 |
| 11/05/2017 | 2.5 |
| 11/05/2017 | 2.6 |
| 11/05/2017 | 2.8 |
| 11/05/2017 | 3.3 |
| 11/05/2017 | 3.9 |
| 11/05/2017 | 4.2 |
| 11/05/2017 | 4.4 |
| 11/05/2017 | 4.5 |
| 11/05/2017 | 4.5 |
| 11/05/2017 | 4.6 |
| 11/05/2017 | 4.5 |
| 11/05/2017 | 4.4 |
| 11/05/2017 | 4.3 |
| 11/05/2017 | 4.3 |
| 11/05/2017 | 4.3 |
| 11/05/2017 | 4.3 |
| 11/05/2017 | 4.2 |
| 11/05/2017 | 4 |
| 11/05/2017 | 3.8 |
| 11/05/2017 | 3.4 |
| 11/05/2017 | 3 |
| 11/05/2017 | 2.7 |
| 12/05/2017 | 2.5 |
| 12/05/2017 | 2.5 |
| 12/05/2017 | 2.4 |
| 12/05/2017 | 2.5 |
| 12/05/2017 | 2.8 |
| 12/05/2017 | 3.3 |
| 12/05/2017 | 3.8 |
| 12/05/2017 | 4.2 |
| 12/05/2017 | 4.4 |
| 12/05/2017 | 4.5 |
| 12/05/2017 | 4.5 |
| 12/05/2017 | 4.5 |
| 12/05/2017 | 4.4 |
| 12/05/2017 | 4.3 |
| 12/05/2017 | 4.2 |
| 12/05/2017 | 4.2 |
| 12/05/2017 | 4.2 |
| 12/05/2017 | 4.1 |
| 12/05/2017 | 4.1 |
| 12/05/2017 | 3.9 |
| 12/05/2017 | 3.6 |
| 12/05/2017 | 3.3 |
| 12/05/2017 | 3 |
| 12/05/2017 | 2.7 |
| 13/05/2017 | 2.5 |
| 13/05/2017 | 2.4 |
| 13/05/2017 | 2.4 |
| 13/05/2017 | 2.4 |
| 13/05/2017 | 2.4 |
| 13/05/2017 | 2.5 |
| 13/05/2017 | 2.8 |
| 13/05/2017 | 3.1 |
| 13/05/2017 | 3.5 |
| 13/05/2017 | 3.7 |
| 13/05/2017 | 3.8 |
| 13/05/2017 | 3.8 |
| 13/05/2017 | 3.7 |
| 13/05/2017 | 3.5 |
| 13/05/2017 | 3.5 |
| 13/05/2017 | 3.4 |
| 13/05/2017 | 3.5 |
| 13/05/2017 | 3.5 |
| 13/05/2017 | 3.5 |
| 13/05/2017 | 3.4 |
| 13/05/2017 | 3.3 |
| 13/05/2017 | 3.1 |
| 13/05/2017 | 2.8 |
| 13/05/2017 | 2.6 |
| 14/05/2017 | 2.4 |
| 14/05/2017 | 2.4 |
| 14/05/2017 | 2.3 |
| 14/05/2017 | 2.3 |
| 14/05/2017 | 2.3 |
| 14/05/2017 | 2.3 |
| 14/05/2017 | 2.5 |
| 14/05/2017 | 2.7 |
| 14/05/2017 | 3 |
| 14/05/2017 | 3.2 |
| 14/05/2017 | 3.3 |
| 14/05/2017 | 3.4 |
| 14/05/2017 | 3.3 |
| 14/05/2017 | 3.2 |
| 14/05/2017 | 3.2 |
| 14/05/2017 | 3.2 |
| 14/05/2017 | 3.2 |
| 14/05/2017 | 3.3 |
| 14/05/2017 | 3.3 |
| 14/05/2017 | 3.3 |
| 14/05/2017 | 3.3 |
| 14/05/2017 | 3.1 |
| 14/05/2017 | 2.8 |
| 14/05/2017 | 2.6 |
| 15/05/2017 | 2.4 |
| 15/05/2017 | 2.4 |
| 15/05/2017 | 2.4 |
| 15/05/2017 | 2.5 |
| 15/05/2017 | 2.7 |
| 15/05/2017 | 3.2 |
| 15/05/2017 | 3.8 |
| 15/05/2017 | 4.1 |
| 15/05/2017 | 4.3 |
| 15/05/2017 | 4.4 |
| 15/05/2017 | 4.5 |
| 15/05/2017 | 4.5 |
| 15/05/2017 | 4.5 |
| 15/05/2017 | 4.4 |
| 15/05/2017 | 4.3 |
| 15/05/2017 | 4.3 |
| 15/05/2017 | 4.3 |
| 15/05/2017 | 4.3 |
| 15/05/2017 | 4.2 |
| 15/05/2017 | 4 |
| 15/05/2017 | 3.8 |
| 15/05/2017 | 3.4 |
| 15/05/2017 | 3 |
| 15/05/2017 | 2.7 |
| 16/05/2017 | 2.5 |
| 16/05/2017 | 2.4 |
| 16/05/2017 | 2.4 |
| 16/05/2017 | 2.5 |
| 16/05/2017 | 2.8 |
| 16/05/2017 | 3.3 |
| 16/05/2017 | 3.8 |
| 16/05/2017 | 4.2 |
| 16/05/2017 | 4.4 |
| 16/05/2017 | 4.5 |
| 16/05/2017 | 4.5 |
| 16/05/2017 | 4.6 |
| 16/05/2017 | 4.5 |
| 16/05/2017 | 4.4 |
| 16/05/2017 | 4.4 |
| 16/05/2017 | 4.3 |
| 16/05/2017 | 4.3 |
| 16/05/2017 | 4.3 |
| 16/05/2017 | 4.2 |
| 16/05/2017 | 4 |
| 16/05/2017 | 3.8 |
| 16/05/2017 | 3.4 |
| 16/05/2017 | 3 |
| 16/05/2017 | 2.7 |
| 17/05/2017 | 2.5 |
| 17/05/2017 | 2.5 |
| 17/05/2017 | 2.4 |
| 17/05/2017 | 2.6 |
| 17/05/2017 | 2.8 |
| 17/05/2017 | 3.3 |
| 17/05/2017 | 3.9 |
| 17/05/2017 | 4.2 |
| 17/05/2017 | 4.4 |
| 17/05/2017 | 4.5 |
| 17/05/2017 | 4.6 |
| 17/05/2017 | 4.6 |
| 17/05/2017 | 4.5 |
| 17/05/2017 | 4.5 |
| 17/05/2017 | 4.4 |
| 17/05/2017 | 4.3 |
| 17/05/2017 | 4.3 |
| 17/05/2017 | 4.3 |
| 17/05/2017 | 4.3 |
| 17/05/2017 | 4 |
| 17/05/2017 | 3.8 |
| 17/05/2017 | 3.4 |
| 17/05/2017 | 3 |
| 17/05/2017 | 2.7 |
| 18/05/2017 | 2.5 |
| 18/05/2017 | 2.5 |
| 18/05/2017 | 2.4 |
| 18/05/2017 | 2.5 |
| 18/05/2017 | 2.8 |
| 18/05/2017 | 3.3 |
| 18/05/2017 | 3.8 |
| 18/05/2017 | 4.2 |
| 18/05/2017 | 4.4 |
| 18/05/2017 | 4.5 |
| 18/05/2017 | 4.6 |
| 18/05/2017 | 4.6 |
| 18/05/2017 | 4.5 |
| 18/05/2017 | 4.4 |
| 18/05/2017 | 4.3 |
| 18/05/2017 | 4.3 |
| 18/05/2017 | 4.3 |
| 18/05/2017 | 4.3 |
| 18/05/2017 | 4.2 |
| 18/05/2017 | 4 |
| 18/05/2017 | 3.7 |
| 18/05/2017 | 3.4 |
| 18/05/2017 | 3 |
| 18/05/2017 | 2.7 |
| 19/05/2017 | 2.5 |
| 19/05/2017 | 2.5 |
| 19/05/2017 | 2.4 |
| 19/05/2017 | 2.5 |
| 19/05/2017 | 2.7 |
| 19/05/2017 | 3.3 |
| 19/05/2017 | 3.8 |
| 19/05/2017 | 4.2 |
| 19/05/2017 | 4.4 |
| 19/05/2017 | 4.5 |
| 19/05/2017 | 4.5 |
| 19/05/2017 | 4.5 |
| 19/05/2017 | 4.5 |
| 19/05/2017 | 4.3 |
| 19/05/2017 | 4.2 |
| 19/05/2017 | 4.2 |
| 19/05/2017 | 4.1 |
| 19/05/2017 | 4.1 |
| 19/05/2017 | 4 |
| 19/05/2017 | 3.8 |
| 19/05/2017 | 3.6 |
| 19/05/2017 | 3.3 |
| 19/05/2017 | 3 |
| 19/05/2017 | 2.7 |
| 20/05/2017 | 2.5 |
| 20/05/2017 | 2.4 |
| 20/05/2017 | 2.4 |
| 20/05/2017 | 2.4 |
| 20/05/2017 | 2.4 |
| 20/05/2017 | 2.5 |
| 20/05/2017 | 2.8 |
| 20/05/2017 | 3.1 |
| 20/05/2017 | 3.4 |
| 20/05/2017 | 3.7 |
| 20/05/2017 | 3.8 |
| 20/05/2017 | 3.8 |
| 20/05/2017 | 3.7 |
| 20/05/2017 | 3.6 |
| 20/05/2017 | 3.5 |
| 20/05/2017 | 3.4 |
| 20/05/2017 | 3.5 |
| 20/05/2017 | 3.5 |
| 20/05/2017 | 3.5 |
| 20/05/2017 | 3.4 |
| 20/05/2017 | 3.3 |
| 20/05/2017 | 3.1 |
| 20/05/2017 | 2.8 |
| 20/05/2017 | 2.6 |
| 21/05/2017 | 2.4 |
| 21/05/2017 | 2.4 |
| 21/05/2017 | 2.3 |
| 21/05/2017 | 2.3 |
| 21/05/2017 | 2.3 |
| 21/05/2017 | 2.3 |
| 21/05/2017 | 2.5 |
| 21/05/2017 | 2.7 |
| 21/05/2017 | 3 |
| 21/05/2017 | 3.2 |
| 21/05/2017 | 3.3 |
| 21/05/2017 | 3.4 |
| 21/05/2017 | 3.3 |
| 21/05/2017 | 3.2 |
| 21/05/2017 | 3.2 |
| 21/05/2017 | 3.2 |
| 21/05/2017 | 3.2 |
| 21/05/2017 | 3.3 |
| 21/05/2017 | 3.3 |
| 21/05/2017 | 3.3 |
| 21/05/2017 | 3.2 |
| 21/05/2017 | 3.1 |
| 21/05/2017 | 2.8 |
| 21/05/2017 | 2.6 |
| 22/05/2017 | 2.4 |
| 22/05/2017 | 2.4 |
| 22/05/2017 | 2.4 |
| 22/05/2017 | 2.5 |
| 22/05/2017 | 2.7 |
| 22/05/2017 | 3.2 |
| 22/05/2017 | 3.8 |
| 22/05/2017 | 4.1 |
| 22/05/2017 | 4.3 |
| 22/05/2017 | 4.4 |
| 22/05/2017 | 4.5 |
| 22/05/2017 | 4.5 |
| 22/05/2017 | 4.5 |
| 22/05/2017 | 4.4 |
| 22/05/2017 | 4.3 |
| 22/05/2017 | 4.2 |
| 22/05/2017 | 4.2 |
| 22/05/2017 | 4.3 |
| 22/05/2017 | 4.2 |
| 22/05/2017 | 3.9 |
| 22/05/2017 | 3.7 |
| 22/05/2017 | 3.4 |
| 22/05/2017 | 3 |
| 22/05/2017 | 2.7 |
| 23/05/2017 | 2.5 |
| 23/05/2017 | 2.4 |
| 23/05/2017 | 2.4 |
| 23/05/2017 | 2.5 |
| 23/05/2017 | 2.7 |
| 23/05/2017 | 3.3 |
| 23/05/2017 | 3.8 |
| 23/05/2017 | 4.2 |
| 23/05/2017 | 4.4 |
| 23/05/2017 | 4.5 |
| 23/05/2017 | 4.5 |
| 23/05/2017 | 4.6 |
| 23/05/2017 | 4.5 |
| 23/05/2017 | 4.4 |
| 23/05/2017 | 4.4 |
| 23/05/2017 | 4.3 |
| 23/05/2017 | 4.3 |
| 23/05/2017 | 4.3 |
| 23/05/2017 | 4.2 |
| 23/05/2017 | 4 |
| 23/05/2017 | 3.7 |
| 23/05/2017 | 3.4 |
| 23/05/2017 | 3 |
| 23/05/2017 | 2.7 |
| 24/05/2017 | 2.5 |
| 24/05/2017 | 2.5 |
| 24/05/2017 | 2.4 |
| 24/05/2017 | 2.5 |
| 24/05/2017 | 2.7 |
| 24/05/2017 | 3.1 |
| 24/05/2017 | 3.7 |
| 24/05/2017 | 4.1 |
| 24/05/2017 | 4.3 |
| 24/05/2017 | 4.5 |
| 24/05/2017 | 4.5 |
| 24/05/2017 | 4.5 |
| 24/05/2017 | 4.4 |
| 24/05/2017 | 4.3 |
| 24/05/2017 | 4.3 |
| 24/05/2017 | 4.2 |
| 24/05/2017 | 4.2 |
| 24/05/2017 | 4.2 |
| 24/05/2017 | 4.1 |
| 24/05/2017 | 3.8 |
| 24/05/2017 | 3.6 |
| 24/05/2017 | 3.4 |
| 24/05/2017 | 3 |
| 24/05/2017 | 2.7 |
| 25/05/2017 | 2.5 |
| 25/05/2017 | 2.4 |
| 25/05/2017 | 2.4 |
| 25/05/2017 | 2.4 |
| 25/05/2017 | 2.3 |
| 25/05/2017 | 2.4 |
| 25/05/2017 | 2.6 |
| 25/05/2017 | 2.8 |
| 25/05/2017 | 3.1 |
| 25/05/2017 | 3.3 |
| 25/05/2017 | 3.4 |
| 25/05/2017 | 3.4 |
| 25/05/2017 | 3.4 |
| 25/05/2017 | 3.3 |
| 25/05/2017 | 3.2 |
| 25/05/2017 | 3.1 |
| 25/05/2017 | 3.1 |
| 25/05/2017 | 3.2 |
| 25/05/2017 | 3.2 |
| 25/05/2017 | 3.1 |
| 25/05/2017 | 3.1 |
| 25/05/2017 | 3 |
| 25/05/2017 | 2.8 |
| 25/05/2017 | 2.6 |
| 26/05/2017 | 2.4 |
| 26/05/2017 | 2.3 |
| 26/05/2017 | 2.3 |
| 26/05/2017 | 2.4 |
| 26/05/2017 | 2.5 |
| 26/05/2017 | 2.7 |
| 26/05/2017 | 3 |
| 26/05/2017 | 3.4 |
| 26/05/2017 | 3.7 |
| 26/05/2017 | 3.8 |
| 26/05/2017 | 3.9 |
| 26/05/2017 | 3.9 |
| 26/05/2017 | 3.8 |
| 26/05/2017 | 3.7 |
| 26/05/2017 | 3.6 |
| 26/05/2017 | 3.6 |
| 26/05/2017 | 3.7 |
| 26/05/2017 | 3.7 |
| 26/05/2017 | 3.7 |
| 26/05/2017 | 3.5 |
| 26/05/2017 | 3.4 |
| 26/05/2017 | 3.2 |
| 26/05/2017 | 2.9 |
| 26/05/2017 | 2.7 |
| 27/05/2017 | 2.5 |
| 27/05/2017 | 2.4 |
| 27/05/2017 | 2.4 |
| 27/05/2017 | 2.4 |
| 27/05/2017 | 2.4 |
| 27/05/2017 | 2.5 |
| 27/05/2017 | 2.8 |
| 27/05/2017 | 3.1 |
| 27/05/2017 | 3.4 |
| 27/05/2017 | 3.7 |
| 27/05/2017 | 3.8 |
| 27/05/2017 | 3.8 |
| 27/05/2017 | 3.7 |
| 27/05/2017 | 3.6 |
| 27/05/2017 | 3.5 |
| 27/05/2017 | 3.4 |
| 27/05/2017 | 3.4 |
| 27/05/2017 | 3.5 |
| 27/05/2017 | 3.5 |
| 27/05/2017 | 3.3 |
| 27/05/2017 | 3.2 |
| 27/05/2017 | 3.1 |
| 27/05/2017 | 2.8 |
| 27/05/2017 | 2.6 |
| 28/05/2017 | 2.4 |
| 28/05/2017 | 2.4 |
| 28/05/2017 | 2.3 |
| 28/05/2017 | 2.3 |
| 28/05/2017 | 2.3 |
| 28/05/2017 | 2.3 |
| 28/05/2017 | 2.5 |
| 28/05/2017 | 2.7 |
| 28/05/2017 | 3 |
| 28/05/2017 | 3.2 |
| 28/05/2017 | 3.3 |
| 28/05/2017 | 3.4 |
| 28/05/2017 | 3.3 |
| 28/05/2017 | 3.2 |
| 28/05/2017 | 3.2 |
| 28/05/2017 | 3.1 |
| 28/05/2017 | 3.2 |
| 28/05/2017 | 3.3 |
| 28/05/2017 | 3.3 |
| 28/05/2017 | 3.2 |
| 28/05/2017 | 3.2 |
| 28/05/2017 | 3.1 |
| 28/05/2017 | 2.8 |
| 28/05/2017 | 2.6 |
| 29/05/2017 | 2.4 |
| 29/05/2017 | 2.4 |
| 29/05/2017 | 2.4 |
| 29/05/2017 | 2.5 |
| 29/05/2017 | 2.7 |
| 29/05/2017 | 3.2 |
| 29/05/2017 | 3.7 |
| 29/05/2017 | 4.1 |
| 29/05/2017 | 4.3 |
| 29/05/2017 | 4.4 |
| 29/05/2017 | 4.5 |
| 29/05/2017 | 4.5 |
| 29/05/2017 | 4.5 |
| 29/05/2017 | 4.4 |
| 29/05/2017 | 4.3 |
| 29/05/2017 | 4.2 |
| 29/05/2017 | 4.2 |
| 29/05/2017 | 4.3 |
| 29/05/2017 | 4.2 |
| 29/05/2017 | 3.9 |
| 29/05/2017 | 3.7 |
| 29/05/2017 | 3.4 |
| 29/05/2017 | 3 |
| 29/05/2017 | 2.7 |
| 30/05/2017 | 2.5 |
| 30/05/2017 | 2.4 |
| 30/05/2017 | 2.4 |
| 30/05/2017 | 2.5 |
| 30/05/2017 | 2.7 |
| 30/05/2017 | 3.3 |
| 30/05/2017 | 3.8 |
| 30/05/2017 | 4.2 |
| 30/05/2017 | 4.4 |
| 30/05/2017 | 4.5 |
| 30/05/2017 | 4.5 |
| 30/05/2017 | 4.6 |
| 30/05/2017 | 4.5 |
| 30/05/2017 | 4.4 |
| 30/05/2017 | 4.4 |
| 30/05/2017 | 4.3 |
| 30/05/2017 | 4.3 |
| 30/05/2017 | 4.3 |
| 30/05/2017 | 4.2 |
| 30/05/2017 | 3.9 |
| 30/05/2017 | 3.7 |
| 30/05/2017 | 3.4 |
| 30/05/2017 | 3 |
| 30/05/2017 | 2.7 |
| 31/05/2017 | 2.5 |
| 31/05/2017 | 2.5 |
| 31/05/2017 | 2.4 |
| 31/05/2017 | 2.5 |
| 31/05/2017 | 2.7 |
| 31/05/2017 | 3.3 |
| 31/05/2017 | 3.8 |
| 31/05/2017 | 4.2 |
| 31/05/2017 | 4.4 |
| 31/05/2017 | 4.5 |
| 31/05/2017 | 4.6 |
| 31/05/2017 | 4.6 |
| 31/05/2017 | 4.6 |
| 31/05/2017 | 4.5 |
| 31/05/2017 | 4.4 |
| 31/05/2017 | 4.3 |
| 31/05/2017 | 4.3 |
| 31/05/2017 | 4.3 |
| 31/05/2017 | 4.2 |
| 31/05/2017 | 3.9 |
| 31/05/2017 | 3.7 |
| 31/05/2017 | 3.4 |
| 31/05/2017 | 3 |
| 31/05/2017 | 2.7 |
| 01/06/2017 | 2.5 |
| 01/06/2017 | 2.5 |
| 01/06/2017 | 2.4 |
| 01/06/2017 | 2.5 |
| 01/06/2017 | 2.7 |
| 01/06/2017 | 3.3 |
| 01/06/2017 | 3.8 |
| 01/06/2017 | 4.2 |
| 01/06/2017 | 4.4 |
| 01/06/2017 | 4.5 |
| 01/06/2017 | 4.6 |
| 01/06/2017 | 4.6 |
| 01/06/2017 | 4.5 |
| 01/06/2017 | 4.4 |
| 01/06/2017 | 4.4 |
| 01/06/2017 | 4.3 |
| 01/06/2017 | 4.3 |
| 01/06/2017 | 4.3 |
| 01/06/2017 | 4.2 |
| 01/06/2017 | 3.9 |
| 01/06/2017 | 3.7 |
| 01/06/2017 | 3.4 |
| 01/06/2017 | 3 |
| 01/06/2017 | 2.7 |
| 02/06/2017 | 2.5 |
| 02/06/2017 | 2.5 |
| 02/06/2017 | 2.4 |
| 02/06/2017 | 2.5 |
| 02/06/2017 | 2.7 |
| 02/06/2017 | 3.2 |
| 02/06/2017 | 3.8 |
| 02/06/2017 | 4.2 |
| 02/06/2017 | 4.4 |
| 02/06/2017 | 4.5 |
| 02/06/2017 | 4.6 |
| 02/06/2017 | 4.6 |
| 02/06/2017 | 4.5 |
| 02/06/2017 | 4.4 |
| 02/06/2017 | 4.3 |
| 02/06/2017 | 4.2 |
| 02/06/2017 | 4.2 |
| 02/06/2017 | 4.2 |
| 02/06/2017 | 4 |
| 02/06/2017 | 3.7 |
| 02/06/2017 | 3.5 |
| 02/06/2017 | 3.3 |
| 02/06/2017 | 3 |
| 02/06/2017 | 2.7 |
| 03/06/2017 | 2.5 |
| 03/06/2017 | 2.4 |
| 03/06/2017 | 2.4 |
| 03/06/2017 | 2.4 |
| 03/06/2017 | 2.4 |
| 03/06/2017 | 2.5 |
| 03/06/2017 | 2.8 |
| 03/06/2017 | 3.1 |
| 03/06/2017 | 3.4 |
| 03/06/2017 | 3.7 |
| 03/06/2017 | 3.8 |
| 03/06/2017 | 3.8 |
| 03/06/2017 | 3.7 |
| 03/06/2017 | 3.6 |
| 03/06/2017 | 3.5 |
| 03/06/2017 | 3.5 |
| 03/06/2017 | 3.5 |
| 03/06/2017 | 3.5 |
| 03/06/2017 | 3.5 |
| 03/06/2017 | 3.3 |
| 03/06/2017 | 3.2 |
| 03/06/2017 | 3.1 |
| 03/06/2017 | 2.9 |
| 03/06/2017 | 2.7 |
| 04/06/2017 | 2.5 |
| 04/06/2017 | 2.4 |
| 04/06/2017 | 2.3 |
| 04/06/2017 | 2.3 |
| 04/06/2017 | 2.3 |
| 04/06/2017 | 2.4 |
| 04/06/2017 | 2.6 |
| 04/06/2017 | 2.9 |
| 04/06/2017 | 3.1 |
| 04/06/2017 | 3.2 |
| 04/06/2017 | 3.3 |
| 04/06/2017 | 3.4 |
| 04/06/2017 | 3.3 |
| 04/06/2017 | 3.2 |
| 04/06/2017 | 3.1 |
| 04/06/2017 | 3.1 |
| 04/06/2017 | 3.2 |
| 04/06/2017 | 3.3 |
| 04/06/2017 | 3.3 |
| 04/06/2017 | 3.3 |
| 04/06/2017 | 3.2 |
| 04/06/2017 | 3.2 |
| 04/06/2017 | 2.9 |
| 04/06/2017 | 2.7 |
| 05/06/2017 | 2.5 |
| 05/06/2017 | 2.4 |
| 05/06/2017 | 2.3 |
| 05/06/2017 | 2.3 |
| 05/06/2017 | 2.3 |
| 05/06/2017 | 2.4 |
| 05/06/2017 | 2.6 |
| 05/06/2017 | 2.9 |
| 05/06/2017 | 3.1 |
| 05/06/2017 | 3.2 |
| 05/06/2017 | 3.3 |
| 05/06/2017 | 3.4 |
| 05/06/2017 | 3.3 |
| 05/06/2017 | 3.2 |
| 05/06/2017 | 3.2 |
| 05/06/2017 | 3.1 |
| 05/06/2017 | 3.2 |
| 05/06/2017 | 3.3 |
| 05/06/2017 | 3.3 |
| 05/06/2017 | 3.3 |
| 05/06/2017 | 3.2 |
| 05/06/2017 | 3.2 |
| 05/06/2017 | 2.9 |
| 05/06/2017 | 2.7 |
| 06/06/2017 | 2.5 |
| 06/06/2017 | 2.4 |
| 06/06/2017 | 2.4 |
| 06/06/2017 | 2.5 |
| 06/06/2017 | 2.7 |
| 06/06/2017 | 3.1 |
| 06/06/2017 | 3.6 |
| 06/06/2017 | 4 |
| 06/06/2017 | 4.3 |
| 06/06/2017 | 4.4 |
| 06/06/2017 | 4.5 |
| 06/06/2017 | 4.5 |
| 06/06/2017 | 4.4 |
| 06/06/2017 | 4.3 |
| 06/06/2017 | 4.3 |
| 06/06/2017 | 4.2 |
| 06/06/2017 | 4.2 |
| 06/06/2017 | 4.2 |
| 06/06/2017 | 4.1 |
| 06/06/2017 | 3.8 |
| 06/06/2017 | 3.6 |
| 06/06/2017 | 3.4 |
| 06/06/2017 | 3 |
| 06/06/2017 | 2.8 |
| 07/06/2017 | 2.6 |
| 07/06/2017 | 2.5 |
| 07/06/2017 | 2.4 |
| 07/06/2017 | 2.5 |
| 07/06/2017 | 2.7 |
| 07/06/2017 | 3.1 |
| 07/06/2017 | 3.7 |
| 07/06/2017 | 4.1 |
| 07/06/2017 | 4.3 |
| 07/06/2017 | 4.5 |
| 07/06/2017 | 4.5 |
| 07/06/2017 | 4.5 |
| 07/06/2017 | 4.5 |
| 07/06/2017 | 4.4 |
| 07/06/2017 | 4.3 |
| 07/06/2017 | 4.2 |
| 07/06/2017 | 4.2 |
| 07/06/2017 | 4.2 |
| 07/06/2017 | 4.1 |
| 07/06/2017 | 3.8 |
| 07/06/2017 | 3.6 |
| 07/06/2017 | 3.4 |
| 07/06/2017 | 3 |
| 07/06/2017 | 2.8 |
| 08/06/2017 | 2.6 |
| 08/06/2017 | 2.5 |
| 08/06/2017 | 2.4 |
| 08/06/2017 | 2.5 |
| 08/06/2017 | 2.7 |
| 08/06/2017 | 3.1 |
| 08/06/2017 | 3.6 |
| 08/06/2017 | 4 |
| 08/06/2017 | 4.3 |
| 08/06/2017 | 4.4 |
| 08/06/2017 | 4.5 |
| 08/06/2017 | 4.5 |
| 08/06/2017 | 4.4 |
| 08/06/2017 | 4.3 |
| 08/06/2017 | 4.3 |
| 08/06/2017 | 4.2 |
| 08/06/2017 | 4.2 |
| 08/06/2017 | 4.2 |
| 08/06/2017 | 4.1 |
| 08/06/2017 | 3.8 |
| 08/06/2017 | 3.6 |
| 08/06/2017 | 3.4 |
| 08/06/2017 | 3 |
| 08/06/2017 | 2.8 |
| 09/06/2017 | 2.6 |
| 09/06/2017 | 2.5 |
| 09/06/2017 | 2.4 |
| 09/06/2017 | 2.5 |
| 09/06/2017 | 2.7 |
| 09/06/2017 | 3.1 |
| 09/06/2017 | 3.6 |
| 09/06/2017 | 4 |
| 09/06/2017 | 4.3 |
| 09/06/2017 | 4.5 |
| 09/06/2017 | 4.5 |
| 09/06/2017 | 4.5 |
| 09/06/2017 | 4.4 |
| 09/06/2017 | 4.3 |
| 09/06/2017 | 4.2 |
| 09/06/2017 | 4.1 |
| 09/06/2017 | 4.1 |
| 09/06/2017 | 4.1 |
| 09/06/2017 | 3.9 |
| 09/06/2017 | 3.7 |
| 09/06/2017 | 3.5 |
| 09/06/2017 | 3.3 |
| 09/06/2017 | 3 |
| 09/06/2017 | 2.7 |
| 10/06/2017 | 2.6 |
| 10/06/2017 | 2.5 |
| 10/06/2017 | 2.4 |
| 10/06/2017 | 2.4 |
| 10/06/2017 | 2.4 |
| 10/06/2017 | 2.5 |
| 10/06/2017 | 2.8 |
| 10/06/2017 | 3.1 |
| 10/06/2017 | 3.4 |
| 10/06/2017 | 3.7 |
| 10/06/2017 | 3.8 |
| 10/06/2017 | 3.8 |
| 10/06/2017 | 3.7 |
| 10/06/2017 | 3.6 |
| 10/06/2017 | 3.5 |
| 10/06/2017 | 3.5 |
| 10/06/2017 | 3.5 |
| 10/06/2017 | 3.5 |
| 10/06/2017 | 3.5 |
| 10/06/2017 | 3.4 |
| 10/06/2017 | 3.2 |
| 10/06/2017 | 3.1 |
| 10/06/2017 | 2.9 |
| 10/06/2017 | 2.6 |
| 11/06/2017 | 2.5 |
| 11/06/2017 | 2.4 |
| 11/06/2017 | 2.3 |
| 11/06/2017 | 2.3 |
| 11/06/2017 | 2.3 |
| 11/06/2017 | 2.3 |
| 11/06/2017 | 2.5 |
| 11/06/2017 | 2.7 |
| 11/06/2017 | 3 |
| 11/06/2017 | 3.2 |
| 11/06/2017 | 3.4 |
| 11/06/2017 | 3.4 |
| 11/06/2017 | 3.4 |
| 11/06/2017 | 3.3 |
| 11/06/2017 | 3.2 |
| 11/06/2017 | 3.2 |
| 11/06/2017 | 3.2 |
| 11/06/2017 | 3.3 |
| 11/06/2017 | 3.3 |
| 11/06/2017 | 3.2 |
| 11/06/2017 | 3.2 |
| 11/06/2017 | 3.1 |
| 11/06/2017 | 2.9 |
| 11/06/2017 | 2.6 |
| 12/06/2017 | 2.5 |
| 12/06/2017 | 2.4 |
| 12/06/2017 | 2.4 |
| 12/06/2017 | 2.5 |
| 12/06/2017 | 2.7 |
| 12/06/2017 | 3.2 |
| 12/06/2017 | 3.8 |
| 12/06/2017 | 4.1 |
| 12/06/2017 | 4.3 |
| 12/06/2017 | 4.5 |
| 12/06/2017 | 4.5 |
| 12/06/2017 | 4.6 |
| 12/06/2017 | 4.5 |
| 12/06/2017 | 4.5 |
| 12/06/2017 | 4.4 |
| 12/06/2017 | 4.3 |
| 12/06/2017 | 4.3 |
| 12/06/2017 | 4.3 |
| 12/06/2017 | 4.2 |
| 12/06/2017 | 3.9 |
| 12/06/2017 | 3.7 |
| 12/06/2017 | 3.4 |
| 12/06/2017 | 3 |
| 12/06/2017 | 2.8 |
| 13/06/2017 | 2.6 |
| 13/06/2017 | 2.5 |
| 13/06/2017 | 2.4 |
| 13/06/2017 | 2.5 |
| 13/06/2017 | 2.7 |
| 13/06/2017 | 3.3 |
| 13/06/2017 | 3.8 |
| 13/06/2017 | 4.2 |
| 13/06/2017 | 4.4 |
| 13/06/2017 | 4.5 |
| 13/06/2017 | 4.6 |
| 13/06/2017 | 4.6 |
| 13/06/2017 | 4.6 |
| 13/06/2017 | 4.5 |
| 13/06/2017 | 4.4 |
| 13/06/2017 | 4.4 |
| 13/06/2017 | 4.4 |
| 13/06/2017 | 4.4 |
| 13/06/2017 | 4.3 |
| 13/06/2017 | 4 |
| 13/06/2017 | 3.7 |
| 13/06/2017 | 3.4 |
| 13/06/2017 | 3.1 |
| 13/06/2017 | 2.8 |
| 14/06/2017 | 2.6 |
| 14/06/2017 | 2.5 |
| 14/06/2017 | 2.5 |
| 14/06/2017 | 2.5 |
| 14/06/2017 | 2.7 |
| 14/06/2017 | 3.3 |
| 14/06/2017 | 3.8 |
| 14/06/2017 | 4.2 |
| 14/06/2017 | 4.4 |
| 14/06/2017 | 4.6 |
| 14/06/2017 | 4.6 |
| 14/06/2017 | 4.6 |
| 14/06/2017 | 4.6 |
| 14/06/2017 | 4.5 |
| 14/06/2017 | 4.5 |
| 14/06/2017 | 4.4 |
| 14/06/2017 | 4.4 |
| 14/06/2017 | 4.4 |
| 14/06/2017 | 4.3 |
| 14/06/2017 | 4 |
| 14/06/2017 | 3.7 |
| 14/06/2017 | 3.4 |
| 14/06/2017 | 3.1 |
| 14/06/2017 | 2.8 |
| 15/06/2017 | 2.6 |
| 15/06/2017 | 2.5 |
| 15/06/2017 | 2.5 |
| 15/06/2017 | 2.5 |
| 15/06/2017 | 2.7 |
| 15/06/2017 | 3.3 |
| 15/06/2017 | 3.8 |
| 15/06/2017 | 4.2 |
| 15/06/2017 | 4.4 |
| 15/06/2017 | 4.5 |
| 15/06/2017 | 4.6 |
| 15/06/2017 | 4.6 |
| 15/06/2017 | 4.6 |
| 15/06/2017 | 4.5 |
| 15/06/2017 | 4.4 |
| 15/06/2017 | 4.3 |
| 15/06/2017 | 4.3 |
| 15/06/2017 | 4.3 |
| 15/06/2017 | 4.2 |
| 15/06/2017 | 3.9 |
| 15/06/2017 | 3.7 |
| 15/06/2017 | 3.4 |
| 15/06/2017 | 3.1 |
| 15/06/2017 | 2.8 |
| 16/06/2017 | 2.6 |
| 16/06/2017 | 2.5 |
| 16/06/2017 | 2.5 |
| 16/06/2017 | 2.5 |
| 16/06/2017 | 2.7 |
| 16/06/2017 | 3.2 |
| 16/06/2017 | 3.8 |
| 16/06/2017 | 4.2 |
| 16/06/2017 | 4.4 |
| 16/06/2017 | 4.5 |
| 16/06/2017 | 4.6 |
| 16/06/2017 | 4.6 |
| 16/06/2017 | 4.5 |
| 16/06/2017 | 4.4 |
| 16/06/2017 | 4.3 |
| 16/06/2017 | 4.2 |
| 16/06/2017 | 4.2 |
| 16/06/2017 | 4.2 |
| 16/06/2017 | 4.1 |
| 16/06/2017 | 3.8 |
| 16/06/2017 | 3.5 |
| 16/06/2017 | 3.3 |
| 16/06/2017 | 3 |
| 16/06/2017 | 2.8 |
| 17/06/2017 | 2.6 |
| 17/06/2017 | 2.5 |
| 17/06/2017 | 2.4 |
| 17/06/2017 | 2.4 |
| 17/06/2017 | 2.4 |
| 17/06/2017 | 2.5 |
| 17/06/2017 | 2.8 |
| 17/06/2017 | 3.1 |
| 17/06/2017 | 3.5 |
| 17/06/2017 | 3.7 |
| 17/06/2017 | 3.8 |
| 17/06/2017 | 3.8 |
| 17/06/2017 | 3.7 |
| 17/06/2017 | 3.6 |
| 17/06/2017 | 3.6 |
| 17/06/2017 | 3.5 |
| 17/06/2017 | 3.5 |
| 17/06/2017 | 3.6 |
| 17/06/2017 | 3.6 |
| 17/06/2017 | 3.4 |
| 17/06/2017 | 3.2 |
| 17/06/2017 | 3.1 |
| 17/06/2017 | 2.9 |
| 17/06/2017 | 2.6 |
| 18/06/2017 | 2.5 |
| 18/06/2017 | 2.4 |
| 18/06/2017 | 2.3 |
| 18/06/2017 | 2.3 |
| 18/06/2017 | 2.3 |
| 18/06/2017 | 2.3 |
| 18/06/2017 | 2.5 |
| 18/06/2017 | 2.7 |
| 18/06/2017 | 3 |
| 18/06/2017 | 3.2 |
| 18/06/2017 | 3.4 |
| 18/06/2017 | 3.4 |
| 18/06/2017 | 3.4 |
| 18/06/2017 | 3.3 |
| 18/06/2017 | 3.2 |
| 18/06/2017 | 3.2 |
| 18/06/2017 | 3.3 |
| 18/06/2017 | 3.4 |
| 18/06/2017 | 3.3 |
| 18/06/2017 | 3.3 |
| 18/06/2017 | 3.2 |
| 18/06/2017 | 3.2 |
| 18/06/2017 | 2.9 |
| 18/06/2017 | 2.7 |
| 19/06/2017 | 2.5 |
| 19/06/2017 | 2.4 |
| 19/06/2017 | 2.4 |
| 19/06/2017 | 2.5 |
| 19/06/2017 | 2.7 |
| 19/06/2017 | 3.2 |
| 19/06/2017 | 3.8 |
| 19/06/2017 | 4.1 |
| 19/06/2017 | 4.3 |
| 19/06/2017 | 4.5 |
| 19/06/2017 | 4.5 |
| 19/06/2017 | 4.6 |
| 19/06/2017 | 4.5 |
| 19/06/2017 | 4.5 |
| 19/06/2017 | 4.4 |
| 19/06/2017 | 4.3 |
| 19/06/2017 | 4.3 |
| 19/06/2017 | 4.3 |
| 19/06/2017 | 4.2 |
| 19/06/2017 | 3.9 |
| 19/06/2017 | 3.7 |
| 19/06/2017 | 3.4 |
| 19/06/2017 | 3.1 |
| 19/06/2017 | 2.8 |
| 20/06/2017 | 2.6 |
| 20/06/2017 | 2.5 |
| 20/06/2017 | 2.5 |
| 20/06/2017 | 2.5 |
| 20/06/2017 | 2.7 |
| 20/06/2017 | 3.3 |
| 20/06/2017 | 3.8 |
| 20/06/2017 | 4.2 |
| 20/06/2017 | 4.4 |
| 20/06/2017 | 4.5 |
| 20/06/2017 | 4.6 |
| 20/06/2017 | 4.6 |
| 20/06/2017 | 4.6 |
| 20/06/2017 | 4.5 |
| 20/06/2017 | 4.4 |
| 20/06/2017 | 4.4 |
| 20/06/2017 | 4.4 |
| 20/06/2017 | 4.4 |
| 20/06/2017 | 4.3 |
| 20/06/2017 | 4 |
| 20/06/2017 | 3.7 |
| 20/06/2017 | 3.4 |
| 20/06/2017 | 3.1 |
| 20/06/2017 | 2.8 |
| 21/06/2017 | 2.6 |
| 21/06/2017 | 2.5 |
| 21/06/2017 | 2.5 |
| 21/06/2017 | 2.6 |
| 21/06/2017 | 2.8 |
| 21/06/2017 | 3.3 |
| 21/06/2017 | 3.8 |
| 21/06/2017 | 4.2 |
| 21/06/2017 | 4.4 |
| 21/06/2017 | 4.6 |
| 21/06/2017 | 4.6 |
| 21/06/2017 | 4.7 |
| 21/06/2017 | 4.6 |
| 21/06/2017 | 4.5 |
| 21/06/2017 | 4.5 |
| 21/06/2017 | 4.4 |
| 21/06/2017 | 4.4 |
| 21/06/2017 | 4.4 |
| 21/06/2017 | 4.3 |
| 21/06/2017 | 4 |
| 21/06/2017 | 3.7 |
| 21/06/2017 | 3.5 |
| 21/06/2017 | 3.1 |
| 21/06/2017 | 2.8 |
| 22/06/2017 | 2.6 |
| 22/06/2017 | 2.5 |
| 22/06/2017 | 2.5 |
| 22/06/2017 | 2.6 |
| 22/06/2017 | 2.7 |
| 22/06/2017 | 3.3 |
| 22/06/2017 | 3.8 |
| 22/06/2017 | 4.2 |
| 22/06/2017 | 4.4 |
| 22/06/2017 | 4.5 |
| 22/06/2017 | 4.6 |
| 22/06/2017 | 4.6 |
| 22/06/2017 | 4.6 |
| 22/06/2017 | 4.5 |
| 22/06/2017 | 4.4 |
| 22/06/2017 | 4.4 |
| 22/06/2017 | 4.4 |
| 22/06/2017 | 4.3 |
| 22/06/2017 | 4.3 |
| 22/06/2017 | 3.9 |
| 22/06/2017 | 3.7 |
| 22/06/2017 | 3.5 |
| 22/06/2017 | 3.1 |
| 22/06/2017 | 2.8 |
| 23/06/2017 | 2.6 |
| 23/06/2017 | 2.5 |
| 23/06/2017 | 2.5 |
| 23/06/2017 | 2.5 |
| 23/06/2017 | 2.7 |
| 23/06/2017 | 3.2 |
| 23/06/2017 | 3.8 |
| 23/06/2017 | 4.2 |
| 23/06/2017 | 4.4 |
| 23/06/2017 | 4.6 |
| 23/06/2017 | 4.6 |
| 23/06/2017 | 4.6 |
| 23/06/2017 | 4.5 |
| 23/06/2017 | 4.4 |
| 23/06/2017 | 4.3 |
| 23/06/2017 | 4.3 |
| 23/06/2017 | 4.2 |
| 23/06/2017 | 4.2 |
| 23/06/2017 | 4.1 |
| 23/06/2017 | 3.8 |
| 23/06/2017 | 3.5 |
| 23/06/2017 | 3.4 |
| 23/06/2017 | 3.1 |
| 23/06/2017 | 2.8 |
| 24/06/2017 | 2.6 |
| 24/06/2017 | 2.5 |
| 24/06/2017 | 2.4 |
| 24/06/2017 | 2.4 |
| 24/06/2017 | 2.4 |
| 24/06/2017 | 2.5 |
| 24/06/2017 | 2.8 |
| 24/06/2017 | 3.1 |
| 24/06/2017 | 3.5 |
| 24/06/2017 | 3.7 |
| 24/06/2017 | 3.8 |
| 24/06/2017 | 3.8 |
| 24/06/2017 | 3.7 |
| 24/06/2017 | 3.6 |
| 24/06/2017 | 3.6 |
| 24/06/2017 | 3.5 |
| 24/06/2017 | 3.5 |
| 24/06/2017 | 3.6 |
| 24/06/2017 | 3.6 |
| 24/06/2017 | 3.4 |
| 24/06/2017 | 3.2 |
| 24/06/2017 | 3.1 |
| 24/06/2017 | 2.9 |
| 24/06/2017 | 2.7 |
| 25/06/2017 | 2.5 |
| 25/06/2017 | 2.4 |
| 25/06/2017 | 2.4 |
| 25/06/2017 | 2.3 |
| 25/06/2017 | 2.3 |
| 25/06/2017 | 2.3 |
| 25/06/2017 | 2.5 |
| 25/06/2017 | 2.7 |
| 25/06/2017 | 3 |
| 25/06/2017 | 3.2 |
| 25/06/2017 | 3.4 |
| 25/06/2017 | 3.5 |
| 25/06/2017 | 3.4 |
| 25/06/2017 | 3.3 |
| 25/06/2017 | 3.3 |
| 25/06/2017 | 3.2 |
| 25/06/2017 | 3.3 |
| 25/06/2017 | 3.4 |
| 25/06/2017 | 3.4 |
| 25/06/2017 | 3.3 |
| 25/06/2017 | 3.2 |
| 25/06/2017 | 3.2 |
| 25/06/2017 | 2.9 |
| 25/06/2017 | 2.7 |
| 26/06/2017 | 2.5 |
| 26/06/2017 | 2.4 |
| 26/06/2017 | 2.4 |
| 26/06/2017 | 2.5 |
| 26/06/2017 | 2.7 |
| 26/06/2017 | 3.2 |
| 26/06/2017 | 3.8 |
| 26/06/2017 | 4.1 |
| 26/06/2017 | 4.3 |
| 26/06/2017 | 4.5 |
| 26/06/2017 | 4.6 |
| 26/06/2017 | 4.6 |
| 26/06/2017 | 4.6 |
| 26/06/2017 | 4.5 |
| 26/06/2017 | 4.4 |
| 26/06/2017 | 4.4 |
| 26/06/2017 | 4.4 |
| 26/06/2017 | 4.3 |
| 26/06/2017 | 4.3 |
| 26/06/2017 | 3.9 |
| 26/06/2017 | 3.7 |
| 26/06/2017 | 3.4 |
| 26/06/2017 | 3.1 |
| 26/06/2017 | 2.8 |
| 27/06/2017 | 2.6 |
| 27/06/2017 | 2.5 |
| 27/06/2017 | 2.5 |
| 27/06/2017 | 2.5 |
| 27/06/2017 | 2.7 |
| 27/06/2017 | 3.3 |
| 27/06/2017 | 3.8 |
| 27/06/2017 | 4.2 |
| 27/06/2017 | 4.4 |
| 27/06/2017 | 4.5 |
| 27/06/2017 | 4.6 |
| 27/06/2017 | 4.6 |
| 27/06/2017 | 4.6 |
| 27/06/2017 | 4.5 |
| 27/06/2017 | 4.5 |
| 27/06/2017 | 4.4 |
| 27/06/2017 | 4.4 |
| 27/06/2017 | 4.4 |
| 27/06/2017 | 4.3 |
| 27/06/2017 | 4 |
| 27/06/2017 | 3.7 |
| 27/06/2017 | 3.5 |
| 27/06/2017 | 3.1 |
| 27/06/2017 | 2.8 |
| 28/06/2017 | 2.6 |
| 28/06/2017 | 2.5 |
| 28/06/2017 | 2.5 |
| 28/06/2017 | 2.6 |
| 28/06/2017 | 2.8 |
| 28/06/2017 | 3.3 |
| 28/06/2017 | 3.8 |
| 28/06/2017 | 4.2 |
| 28/06/2017 | 4.4 |
| 28/06/2017 | 4.6 |
| 28/06/2017 | 4.6 |
| 28/06/2017 | 4.7 |
| 28/06/2017 | 4.6 |
| 28/06/2017 | 4.6 |
| 28/06/2017 | 4.5 |
| 28/06/2017 | 4.4 |
| 28/06/2017 | 4.4 |
| 28/06/2017 | 4.4 |
| 28/06/2017 | 4.3 |
| 28/06/2017 | 4 |
| 28/06/2017 | 3.7 |
| 28/06/2017 | 3.5 |
| 28/06/2017 | 3.1 |
| 28/06/2017 | 2.8 |
| 29/06/2017 | 2.6 |
| 29/06/2017 | 2.5 |
| 29/06/2017 | 2.5 |
| 29/06/2017 | 2.6 |
| 29/06/2017 | 2.7 |
| 29/06/2017 | 3.3 |
| 29/06/2017 | 3.8 |
| 29/06/2017 | 4.2 |
| 29/06/2017 | 4.4 |
| 29/06/2017 | 4.6 |
| 29/06/2017 | 4.6 |
| 29/06/2017 | 4.6 |
| 29/06/2017 | 4.6 |
| 29/06/2017 | 4.5 |
| 29/06/2017 | 4.5 |
| 29/06/2017 | 4.4 |
| 29/06/2017 | 4.4 |
| 29/06/2017 | 4.3 |
| 29/06/2017 | 4.3 |
| 29/06/2017 | 4 |
| 29/06/2017 | 3.7 |
| 29/06/2017 | 3.5 |
| 29/06/2017 | 3.1 |
| 29/06/2017 | 2.8 |
| 30/06/2017 | 2.6 |
| 30/06/2017 | 2.5 |
| 30/06/2017 | 2.5 |
| 30/06/2017 | 2.6 |
| 30/06/2017 | 2.7 |
| 30/06/2017 | 3.3 |
| 30/06/2017 | 3.8 |
| 30/06/2017 | 4.2 |
| 30/06/2017 | 4.4 |
| 30/06/2017 | 4.6 |
| 30/06/2017 | 4.6 |
| 30/06/2017 | 4.6 |
| 30/06/2017 | 4.5 |
| 30/06/2017 | 4.4 |
| 30/06/2017 | 4.4 |
| 30/06/2017 | 4.3 |
| 30/06/2017 | 4.3 |
| 30/06/2017 | 4.2 |
| 30/06/2017 | 4.1 |
| 30/06/2017 | 3.8 |
| 30/06/2017 | 3.5 |
| 30/06/2017 | 3.4 |
| 30/06/2017 | 3.1 |
| 30/06/2017 | 2.8 |
| 01/07/2017 | 2.6 |
| 01/07/2017 | 2.5 |
| 01/07/2017 | 2.4 |
| 01/07/2017 | 2.4 |
| 01/07/2017 | 2.4 |
| 01/07/2017 | 2.5 |
| 01/07/2017 | 2.8 |
| 01/07/2017 | 3.1 |
| 01/07/2017 | 3.5 |
| 01/07/2017 | 3.7 |
| 01/07/2017 | 3.8 |
| 01/07/2017 | 3.8 |
| 01/07/2017 | 3.7 |
| 01/07/2017 | 3.6 |
| 01/07/2017 | 3.6 |
| 01/07/2017 | 3.6 |
| 01/07/2017 | 3.6 |
| 01/07/2017 | 3.6 |
| 01/07/2017 | 3.6 |
| 01/07/2017 | 3.4 |
| 01/07/2017 | 3.2 |
| 01/07/2017 | 3.1 |
| 01/07/2017 | 2.9 |
| 01/07/2017 | 2.7 |
| 02/07/2017 | 2.5 |
| 02/07/2017 | 2.4 |
| 02/07/2017 | 2.4 |
| 02/07/2017 | 2.3 |
| 02/07/2017 | 2.3 |
| 02/07/2017 | 2.3 |
| 02/07/2017 | 2.5 |
| 02/07/2017 | 2.7 |
| 02/07/2017 | 3 |
| 02/07/2017 | 3.2 |
| 02/07/2017 | 3.4 |
| 02/07/2017 | 3.5 |
| 02/07/2017 | 3.4 |
| 02/07/2017 | 3.3 |
| 02/07/2017 | 3.3 |
| 02/07/2017 | 3.3 |
| 02/07/2017 | 3.3 |
| 02/07/2017 | 3.4 |
| 02/07/2017 | 3.4 |
| 02/07/2017 | 3.3 |
| 02/07/2017 | 3.2 |
| 02/07/2017 | 3.2 |
| 02/07/2017 | 2.9 |
| 02/07/2017 | 2.7 |
| 03/07/2017 | 2.5 |
| 03/07/2017 | 2.4 |
| 03/07/2017 | 2.4 |
| 03/07/2017 | 2.5 |
| 03/07/2017 | 2.7 |
| 03/07/2017 | 3.2 |
| 03/07/2017 | 3.8 |
| 03/07/2017 | 4.1 |
| 03/07/2017 | 4.3 |
| 03/07/2017 | 4.5 |
| 03/07/2017 | 4.6 |
| 03/07/2017 | 4.6 |
| 03/07/2017 | 4.6 |
| 03/07/2017 | 4.5 |
| 03/07/2017 | 4.5 |
| 03/07/2017 | 4.4 |
| 03/07/2017 | 4.4 |
| 03/07/2017 | 4.3 |
| 03/07/2017 | 4.3 |
| 03/07/2017 | 4 |
| 03/07/2017 | 3.7 |
| 03/07/2017 | 3.4 |
| 03/07/2017 | 3.1 |
| 03/07/2017 | 2.8 |
| 04/07/2017 | 2.6 |
| 04/07/2017 | 2.5 |
| 04/07/2017 | 2.5 |
| 04/07/2017 | 2.6 |
| 04/07/2017 | 2.7 |
| 04/07/2017 | 3.3 |
| 04/07/2017 | 3.8 |
| 04/07/2017 | 4.2 |
| 04/07/2017 | 4.4 |
| 04/07/2017 | 4.5 |
| 04/07/2017 | 4.6 |
| 04/07/2017 | 4.6 |
| 04/07/2017 | 4.6 |
| 04/07/2017 | 4.5 |
| 04/07/2017 | 4.5 |
| 04/07/2017 | 4.4 |
| 04/07/2017 | 4.4 |
| 04/07/2017 | 4.4 |
| 04/07/2017 | 4.3 |
| 04/07/2017 | 4 |
| 04/07/2017 | 3.7 |
| 04/07/2017 | 3.5 |
| 04/07/2017 | 3.1 |
| 04/07/2017 | 2.8 |
| 05/07/2017 | 2.6 |
| 05/07/2017 | 2.5 |
| 05/07/2017 | 2.5 |
| 05/07/2017 | 2.6 |
| 05/07/2017 | 2.8 |
| 05/07/2017 | 3.3 |
| 05/07/2017 | 3.8 |
| 05/07/2017 | 4.2 |
| 05/07/2017 | 4.4 |
| 05/07/2017 | 4.6 |
| 05/07/2017 | 4.6 |
| 05/07/2017 | 4.7 |
| 05/07/2017 | 4.6 |
| 05/07/2017 | 4.6 |
| 05/07/2017 | 4.5 |
| 05/07/2017 | 4.4 |
| 05/07/2017 | 4.4 |
| 05/07/2017 | 4.4 |
| 05/07/2017 | 4.3 |
| 05/07/2017 | 4 |
| 05/07/2017 | 3.7 |
| 05/07/2017 | 3.5 |
| 05/07/2017 | 3.1 |
| 05/07/2017 | 2.8 |
| 06/07/2017 | 2.6 |
| 06/07/2017 | 2.5 |
| 06/07/2017 | 2.5 |
| 06/07/2017 | 2.6 |
| 06/07/2017 | 2.8 |
| 06/07/2017 | 3.3 |
| 06/07/2017 | 3.8 |
| 06/07/2017 | 4.2 |
| 06/07/2017 | 4.4 |
| 06/07/2017 | 4.5 |
| 06/07/2017 | 4.6 |
| 06/07/2017 | 4.6 |
| 06/07/2017 | 4.6 |
| 06/07/2017 | 4.5 |
| 06/07/2017 | 4.5 |
| 06/07/2017 | 4.4 |
| 06/07/2017 | 4.4 |
| 06/07/2017 | 4.3 |
| 06/07/2017 | 4.3 |
| 06/07/2017 | 4 |
| 06/07/2017 | 3.7 |
| 06/07/2017 | 3.5 |
| 06/07/2017 | 3.1 |
| 06/07/2017 | 2.8 |
| 07/07/2017 | 2.6 |
| 07/07/2017 | 2.5 |
| 07/07/2017 | 2.5 |
| 07/07/2017 | 2.6 |
| 07/07/2017 | 2.7 |
| 07/07/2017 | 3.3 |
| 07/07/2017 | 3.8 |
| 07/07/2017 | 4.2 |
| 07/07/2017 | 4.4 |
| 07/07/2017 | 4.5 |
| 07/07/2017 | 4.6 |
| 07/07/2017 | 4.6 |
| 07/07/2017 | 4.5 |
| 07/07/2017 | 4.4 |
| 07/07/2017 | 4.4 |
| 07/07/2017 | 4.3 |
| 07/07/2017 | 4.3 |
| 07/07/2017 | 4.2 |
| 07/07/2017 | 4.1 |
| 07/07/2017 | 3.8 |
| 07/07/2017 | 3.5 |
| 07/07/2017 | 3.4 |
| 07/07/2017 | 3.1 |
| 07/07/2017 | 2.8 |
| 08/07/2017 | 2.6 |
| 08/07/2017 | 2.5 |
| 08/07/2017 | 2.4 |
| 08/07/2017 | 2.4 |
| 08/07/2017 | 2.4 |
| 08/07/2017 | 2.5 |
| 08/07/2017 | 2.8 |
| 08/07/2017 | 3.1 |
| 08/07/2017 | 3.5 |
| 08/07/2017 | 3.7 |
| 08/07/2017 | 3.8 |
| 08/07/2017 | 3.8 |
| 08/07/2017 | 3.7 |
| 08/07/2017 | 3.6 |
| 08/07/2017 | 3.6 |
| 08/07/2017 | 3.5 |
| 08/07/2017 | 3.6 |
| 08/07/2017 | 3.6 |
| 08/07/2017 | 3.6 |
| 08/07/2017 | 3.4 |
| 08/07/2017 | 3.2 |
| 08/07/2017 | 3.1 |
| 08/07/2017 | 2.9 |
| 08/07/2017 | 2.7 |
| 09/07/2017 | 2.5 |
| 09/07/2017 | 2.4 |
| 09/07/2017 | 2.4 |
| 09/07/2017 | 2.3 |
| 09/07/2017 | 2.3 |
| 09/07/2017 | 2.3 |
| 09/07/2017 | 2.5 |
| 09/07/2017 | 2.7 |
| 09/07/2017 | 3 |
| 09/07/2017 | 3.2 |
| 09/07/2017 | 3.4 |
| 09/07/2017 | 3.4 |
| 09/07/2017 | 3.4 |
| 09/07/2017 | 3.3 |
| 09/07/2017 | 3.3 |
| 09/07/2017 | 3.2 |
| 09/07/2017 | 3.3 |
| 09/07/2017 | 3.4 |
| 09/07/2017 | 3.3 |
| 09/07/2017 | 3.3 |
| 09/07/2017 | 3.2 |
| 09/07/2017 | 3.2 |
| 09/07/2017 | 2.9 |
| 09/07/2017 | 2.7 |
| 10/07/2017 | 2.5 |
| 10/07/2017 | 2.4 |
| 10/07/2017 | 2.4 |
| 10/07/2017 | 2.5 |
| 10/07/2017 | 2.7 |
| 10/07/2017 | 3.2 |
| 10/07/2017 | 3.8 |
| 10/07/2017 | 4.1 |
| 10/07/2017 | 4.3 |
| 10/07/2017 | 4.5 |
| 10/07/2017 | 4.5 |
| 10/07/2017 | 4.6 |
| 10/07/2017 | 4.5 |
| 10/07/2017 | 4.5 |
| 10/07/2017 | 4.4 |
| 10/07/2017 | 4.4 |
| 10/07/2017 | 4.4 |
| 10/07/2017 | 4.3 |
| 10/07/2017 | 4.2 |
| 10/07/2017 | 4 |
| 10/07/2017 | 3.7 |
| 10/07/2017 | 3.4 |
| 10/07/2017 | 3.1 |
| 10/07/2017 | 2.8 |
| 11/07/2017 | 2.6 |
| 11/07/2017 | 2.5 |
| 11/07/2017 | 2.5 |
| 11/07/2017 | 2.6 |
| 11/07/2017 | 2.8 |
| 11/07/2017 | 3.3 |
| 11/07/2017 | 3.8 |
| 11/07/2017 | 4.2 |
| 11/07/2017 | 4.4 |
| 11/07/2017 | 4.5 |
| 11/07/2017 | 4.6 |
| 11/07/2017 | 4.6 |
| 11/07/2017 | 4.6 |
| 11/07/2017 | 4.5 |
| 11/07/2017 | 4.5 |
| 11/07/2017 | 4.4 |
| 11/07/2017 | 4.4 |
| 11/07/2017 | 4.4 |
| 11/07/2017 | 4.3 |
| 11/07/2017 | 4 |
| 11/07/2017 | 3.7 |
| 11/07/2017 | 3.4 |
| 11/07/2017 | 3.1 |
| 11/07/2017 | 2.8 |
| 12/07/2017 | 2.6 |
| 12/07/2017 | 2.5 |
| 12/07/2017 | 2.5 |
| 12/07/2017 | 2.6 |
| 12/07/2017 | 2.8 |
| 12/07/2017 | 3.3 |
| 12/07/2017 | 3.8 |
| 12/07/2017 | 4.2 |
| 12/07/2017 | 4.4 |
| 12/07/2017 | 4.6 |
| 12/07/2017 | 4.6 |
| 12/07/2017 | 4.6 |
| 12/07/2017 | 4.6 |
| 12/07/2017 | 4.5 |
| 12/07/2017 | 4.5 |
| 12/07/2017 | 4.4 |
| 12/07/2017 | 4.4 |
| 12/07/2017 | 4.4 |
| 12/07/2017 | 4.3 |
| 12/07/2017 | 4 |
| 12/07/2017 | 3.7 |
| 12/07/2017 | 3.5 |
| 12/07/2017 | 3.1 |
| 12/07/2017 | 2.8 |
| 13/07/2017 | 2.6 |
| 13/07/2017 | 2.5 |
| 13/07/2017 | 2.5 |
| 13/07/2017 | 2.6 |
| 13/07/2017 | 2.8 |
| 13/07/2017 | 3.3 |
| 13/07/2017 | 3.8 |
| 13/07/2017 | 4.2 |
| 13/07/2017 | 4.4 |
| 13/07/2017 | 4.5 |
| 13/07/2017 | 4.6 |
| 13/07/2017 | 4.6 |
| 13/07/2017 | 4.6 |
| 13/07/2017 | 4.5 |
| 13/07/2017 | 4.4 |
| 13/07/2017 | 4.4 |
| 13/07/2017 | 4.3 |
| 13/07/2017 | 4.3 |
| 13/07/2017 | 4.2 |
| 13/07/2017 | 4 |
| 13/07/2017 | 3.7 |
| 13/07/2017 | 3.4 |
| 13/07/2017 | 3.1 |
| 13/07/2017 | 2.8 |
| 14/07/2017 | 2.6 |
| 14/07/2017 | 2.5 |
| 14/07/2017 | 2.5 |
| 14/07/2017 | 2.6 |
| 14/07/2017 | 2.8 |
| 14/07/2017 | 3.3 |
| 14/07/2017 | 3.8 |
| 14/07/2017 | 4.2 |
| 14/07/2017 | 4.4 |
| 14/07/2017 | 4.5 |
| 14/07/2017 | 4.6 |
| 14/07/2017 | 4.6 |
| 14/07/2017 | 4.5 |
| 14/07/2017 | 4.4 |
| 14/07/2017 | 4.3 |
| 14/07/2017 | 4.3 |
| 14/07/2017 | 4.2 |
| 14/07/2017 | 4.2 |
| 14/07/2017 | 4.1 |
| 14/07/2017 | 3.8 |
| 14/07/2017 | 3.6 |
| 14/07/2017 | 3.3 |
| 14/07/2017 | 3 |
| 14/07/2017 | 2.8 |
| 15/07/2017 | 2.6 |
| 15/07/2017 | 2.5 |
| 15/07/2017 | 2.4 |
| 15/07/2017 | 2.4 |
| 15/07/2017 | 2.4 |
| 15/07/2017 | 2.5 |
| 15/07/2017 | 2.8 |
| 15/07/2017 | 3.1 |
| 15/07/2017 | 3.4 |
| 15/07/2017 | 3.7 |
| 15/07/2017 | 3.8 |
| 15/07/2017 | 3.8 |
| 15/07/2017 | 3.7 |
| 15/07/2017 | 3.6 |
| 15/07/2017 | 3.6 |
| 15/07/2017 | 3.5 |
| 15/07/2017 | 3.5 |
| 15/07/2017 | 3.6 |
| 15/07/2017 | 3.5 |
| 15/07/2017 | 3.4 |
| 15/07/2017 | 3.3 |
| 15/07/2017 | 3.1 |
| 15/07/2017 | 2.9 |
| 15/07/2017 | 2.6 |
| 16/07/2017 | 2.5 |
| 16/07/2017 | 2.4 |
| 16/07/2017 | 2.4 |
| 16/07/2017 | 2.3 |
| 16/07/2017 | 2.3 |
| 16/07/2017 | 2.3 |
| 16/07/2017 | 2.5 |
| 16/07/2017 | 2.7 |
| 16/07/2017 | 3 |
| 16/07/2017 | 3.2 |
| 16/07/2017 | 3.3 |
| 16/07/2017 | 3.4 |
| 16/07/2017 | 3.4 |
| 16/07/2017 | 3.3 |
| 16/07/2017 | 3.2 |
| 16/07/2017 | 3.2 |
| 16/07/2017 | 3.3 |
| 16/07/2017 | 3.3 |
| 16/07/2017 | 3.3 |
| 16/07/2017 | 3.3 |
| 16/07/2017 | 3.2 |
| 16/07/2017 | 3.1 |
| 16/07/2017 | 2.9 |
| 16/07/2017 | 2.7 |
| 17/07/2017 | 2.5 |
| 17/07/2017 | 2.4 |
| 17/07/2017 | 2.4 |
| 17/07/2017 | 2.5 |
| 17/07/2017 | 2.7 |
| 17/07/2017 | 3.2 |
| 17/07/2017 | 3.8 |
| 17/07/2017 | 4.1 |
| 17/07/2017 | 4.3 |
| 17/07/2017 | 4.4 |
| 17/07/2017 | 4.5 |
| 17/07/2017 | 4.5 |
| 17/07/2017 | 4.5 |
| 17/07/2017 | 4.5 |
| 17/07/2017 | 4.4 |
| 17/07/2017 | 4.3 |
| 17/07/2017 | 4.3 |
| 17/07/2017 | 4.3 |
| 17/07/2017 | 4.2 |
| 17/07/2017 | 3.9 |
| 17/07/2017 | 3.7 |
| 17/07/2017 | 3.4 |
| 17/07/2017 | 3 |
| 17/07/2017 | 2.8 |
| 18/07/2017 | 2.6 |
| 18/07/2017 | 2.5 |
| 18/07/2017 | 2.5 |
| 18/07/2017 | 2.6 |
| 18/07/2017 | 2.8 |
| 18/07/2017 | 3.3 |
| 18/07/2017 | 3.8 |
| 18/07/2017 | 4.2 |
| 18/07/2017 | 4.3 |
| 18/07/2017 | 4.5 |
| 18/07/2017 | 4.5 |
| 18/07/2017 | 4.6 |
| 18/07/2017 | 4.5 |
| 18/07/2017 | 4.5 |
| 18/07/2017 | 4.4 |
| 18/07/2017 | 4.4 |
| 18/07/2017 | 4.4 |
| 18/07/2017 | 4.3 |
| 18/07/2017 | 4.2 |
| 18/07/2017 | 4 |
| 18/07/2017 | 3.7 |
| 18/07/2017 | 3.4 |
| 18/07/2017 | 3.1 |
| 18/07/2017 | 2.8 |
| 19/07/2017 | 2.6 |
| 19/07/2017 | 2.5 |
| 19/07/2017 | 2.5 |
| 19/07/2017 | 2.6 |
| 19/07/2017 | 2.8 |
| 19/07/2017 | 3.3 |
| 19/07/2017 | 3.8 |
| 19/07/2017 | 4.2 |
| 19/07/2017 | 4.4 |
| 19/07/2017 | 4.5 |
| 19/07/2017 | 4.6 |
| 19/07/2017 | 4.6 |
| 19/07/2017 | 4.6 |
| 19/07/2017 | 4.5 |
| 19/07/2017 | 4.5 |
| 19/07/2017 | 4.4 |
| 19/07/2017 | 4.4 |
| 19/07/2017 | 4.3 |
| 19/07/2017 | 4.2 |
| 19/07/2017 | 4 |
| 19/07/2017 | 3.7 |
| 19/07/2017 | 3.4 |
| 19/07/2017 | 3.1 |
| 19/07/2017 | 2.8 |
| 20/07/2017 | 2.6 |
| 20/07/2017 | 2.5 |
| 20/07/2017 | 2.5 |
| 20/07/2017 | 2.6 |
| 20/07/2017 | 2.7 |
| 20/07/2017 | 3.1 |
| 20/07/2017 | 3.6 |
| 20/07/2017 | 4 |
| 20/07/2017 | 4.2 |
| 20/07/2017 | 4.4 |
| 20/07/2017 | 4.5 |
| 20/07/2017 | 4.5 |
| 20/07/2017 | 4.4 |
| 20/07/2017 | 4.4 |
| 20/07/2017 | 4.3 |
| 20/07/2017 | 4.2 |
| 20/07/2017 | 4.2 |
| 20/07/2017 | 4.2 |
| 20/07/2017 | 4.1 |
| 20/07/2017 | 3.8 |
| 20/07/2017 | 3.6 |
| 20/07/2017 | 3.4 |
| 20/07/2017 | 3 |
| 20/07/2017 | 2.8 |
| 21/07/2017 | 2.6 |
| 21/07/2017 | 2.5 |
| 21/07/2017 | 2.5 |
| 21/07/2017 | 2.5 |
| 21/07/2017 | 2.7 |
| 21/07/2017 | 3.1 |
| 21/07/2017 | 3.6 |
| 21/07/2017 | 4 |
| 21/07/2017 | 4.2 |
| 21/07/2017 | 4.4 |
| 21/07/2017 | 4.5 |
| 21/07/2017 | 4.5 |
| 21/07/2017 | 4.4 |
| 21/07/2017 | 4.3 |
| 21/07/2017 | 4.2 |
| 21/07/2017 | 4.1 |
| 21/07/2017 | 4.1 |
| 21/07/2017 | 4 |
| 21/07/2017 | 3.9 |
| 21/07/2017 | 3.7 |
| 21/07/2017 | 3.5 |
| 21/07/2017 | 3.3 |
| 21/07/2017 | 3 |
| 21/07/2017 | 2.7 |
| 22/07/2017 | 2.6 |
| 22/07/2017 | 2.5 |
| 22/07/2017 | 2.4 |
| 22/07/2017 | 2.4 |
| 22/07/2017 | 2.4 |
| 22/07/2017 | 2.4 |
| 22/07/2017 | 2.6 |
| 22/07/2017 | 3 |
| 22/07/2017 | 3.3 |
| 22/07/2017 | 3.6 |
| 22/07/2017 | 3.7 |
| 22/07/2017 | 3.7 |
| 22/07/2017 | 3.6 |
| 22/07/2017 | 3.5 |
| 22/07/2017 | 3.4 |
| 22/07/2017 | 3.4 |
| 22/07/2017 | 3.4 |
| 22/07/2017 | 3.4 |
| 22/07/2017 | 3.4 |
| 22/07/2017 | 3.3 |
| 22/07/2017 | 3.2 |
| 22/07/2017 | 3.1 |
| 22/07/2017 | 2.8 |
| 22/07/2017 | 2.6 |
| 23/07/2017 | 2.5 |
| 23/07/2017 | 2.4 |
| 23/07/2017 | 2.3 |
| 23/07/2017 | 2.3 |
| 23/07/2017 | 2.3 |
| 23/07/2017 | 2.3 |
| 23/07/2017 | 2.4 |
| 23/07/2017 | 2.6 |
| 23/07/2017 | 2.9 |
| 23/07/2017 | 3.1 |
| 23/07/2017 | 3.3 |
| 23/07/2017 | 3.3 |
| 23/07/2017 | 3.3 |
| 23/07/2017 | 3.2 |
| 23/07/2017 | 3.1 |
| 23/07/2017 | 3.1 |
| 23/07/2017 | 3.2 |
| 23/07/2017 | 3.2 |
| 23/07/2017 | 3.2 |
| 23/07/2017 | 3.2 |
| 23/07/2017 | 3.2 |
| 23/07/2017 | 3.1 |
| 23/07/2017 | 2.8 |
| 23/07/2017 | 2.6 |
| 24/07/2017 | 2.5 |
| 24/07/2017 | 2.4 |
| 24/07/2017 | 2.4 |
| 24/07/2017 | 2.5 |
| 24/07/2017 | 2.7 |
| 24/07/2017 | 3.1 |
| 24/07/2017 | 3.6 |
| 24/07/2017 | 3.9 |
| 24/07/2017 | 4.2 |
| 24/07/2017 | 4.3 |
| 24/07/2017 | 4.4 |
| 24/07/2017 | 4.4 |
| 24/07/2017 | 4.4 |
| 24/07/2017 | 4.3 |
| 24/07/2017 | 4.3 |
| 24/07/2017 | 4.2 |
| 24/07/2017 | 4.2 |
| 24/07/2017 | 4.2 |
| 24/07/2017 | 4.1 |
| 24/07/2017 | 3.8 |
| 24/07/2017 | 3.6 |
| 24/07/2017 | 3.3 |
| 24/07/2017 | 3 |
| 24/07/2017 | 2.7 |
| 25/07/2017 | 2.6 |
| 25/07/2017 | 2.5 |
| 25/07/2017 | 2.5 |
| 25/07/2017 | 2.5 |
| 25/07/2017 | 2.7 |
| 25/07/2017 | 3.1 |
| 25/07/2017 | 3.6 |
| 25/07/2017 | 4 |
| 25/07/2017 | 4.2 |
| 25/07/2017 | 4.4 |
| 25/07/2017 | 4.4 |
| 25/07/2017 | 4.5 |
| 25/07/2017 | 4.4 |
| 25/07/2017 | 4.3 |
| 25/07/2017 | 4.3 |
| 25/07/2017 | 4.2 |
| 25/07/2017 | 4.2 |
| 25/07/2017 | 4.2 |
| 25/07/2017 | 4.1 |
| 25/07/2017 | 3.9 |
| 25/07/2017 | 3.7 |
| 25/07/2017 | 3.4 |
| 25/07/2017 | 3 |
| 25/07/2017 | 2.8 |
| 26/07/2017 | 2.6 |
| 26/07/2017 | 2.5 |
| 26/07/2017 | 2.5 |
| 26/07/2017 | 2.6 |
| 26/07/2017 | 2.7 |
| 26/07/2017 | 3.2 |
| 26/07/2017 | 3.6 |
| 26/07/2017 | 4 |
| 26/07/2017 | 4.3 |
| 26/07/2017 | 4.4 |
| 26/07/2017 | 4.5 |
| 26/07/2017 | 4.5 |
| 26/07/2017 | 4.5 |
| 26/07/2017 | 4.4 |
| 26/07/2017 | 4.3 |
| 26/07/2017 | 4.2 |
| 26/07/2017 | 4.2 |
| 26/07/2017 | 4.2 |
| 26/07/2017 | 4.1 |
| 26/07/2017 | 3.9 |
| 26/07/2017 | 3.7 |
| 26/07/2017 | 3.4 |
| 26/07/2017 | 3 |
| 26/07/2017 | 2.8 |
| 27/07/2017 | 2.6 |
| 27/07/2017 | 2.5 |
| 27/07/2017 | 2.5 |
| 27/07/2017 | 2.6 |
| 27/07/2017 | 2.7 |
| 27/07/2017 | 3.1 |
| 27/07/2017 | 3.6 |
| 27/07/2017 | 4 |
| 27/07/2017 | 4.2 |
| 27/07/2017 | 4.4 |
| 27/07/2017 | 4.5 |
| 27/07/2017 | 4.5 |
| 27/07/2017 | 4.4 |
| 27/07/2017 | 4.3 |
| 27/07/2017 | 4.3 |
| 27/07/2017 | 4.2 |
| 27/07/2017 | 4.2 |
| 27/07/2017 | 4.2 |
| 27/07/2017 | 4.1 |
| 27/07/2017 | 3.8 |
| 27/07/2017 | 3.7 |
| 27/07/2017 | 3.4 |
| 27/07/2017 | 3 |
| 27/07/2017 | 2.8 |
| 28/07/2017 | 2.6 |
| 28/07/2017 | 2.5 |
| 28/07/2017 | 2.5 |
| 28/07/2017 | 2.6 |
| 28/07/2017 | 2.7 |
| 28/07/2017 | 3.1 |
| 28/07/2017 | 3.6 |
| 28/07/2017 | 4 |
| 28/07/2017 | 4.2 |
| 28/07/2017 | 4.4 |
| 28/07/2017 | 4.4 |
| 28/07/2017 | 4.4 |
| 28/07/2017 | 4.4 |
| 28/07/2017 | 4.2 |
| 28/07/2017 | 4.2 |
| 28/07/2017 | 4.1 |
| 28/07/2017 | 4.1 |
| 28/07/2017 | 4 |
| 28/07/2017 | 3.9 |
| 28/07/2017 | 3.7 |
| 28/07/2017 | 3.5 |
| 28/07/2017 | 3.3 |
| 28/07/2017 | 3 |
| 28/07/2017 | 2.7 |
| 29/07/2017 | 2.6 |
| 29/07/2017 | 2.5 |
| 29/07/2017 | 2.4 |
| 29/07/2017 | 2.4 |
| 29/07/2017 | 2.4 |
| 29/07/2017 | 2.4 |
| 29/07/2017 | 2.6 |
| 29/07/2017 | 3 |
| 29/07/2017 | 3.3 |
| 29/07/2017 | 3.6 |
| 29/07/2017 | 3.7 |
| 29/07/2017 | 3.7 |
| 29/07/2017 | 3.6 |
| 29/07/2017 | 3.5 |
| 29/07/2017 | 3.4 |
| 29/07/2017 | 3.4 |
| 29/07/2017 | 3.4 |
| 29/07/2017 | 3.4 |
| 29/07/2017 | 3.4 |
| 29/07/2017 | 3.3 |
| 29/07/2017 | 3.2 |
| 29/07/2017 | 3 |
| 29/07/2017 | 2.8 |
| 29/07/2017 | 2.6 |
| 30/07/2017 | 2.5 |
| 30/07/2017 | 2.4 |
| 30/07/2017 | 2.3 |
| 30/07/2017 | 2.3 |
| 30/07/2017 | 2.3 |
| 30/07/2017 | 2.3 |
| 30/07/2017 | 2.4 |
| 30/07/2017 | 2.6 |
| 30/07/2017 | 2.9 |
| 30/07/2017 | 3.1 |
| 30/07/2017 | 3.3 |
| 30/07/2017 | 3.3 |
| 30/07/2017 | 3.3 |
| 30/07/2017 | 3.2 |
| 30/07/2017 | 3.1 |
| 30/07/2017 | 3.1 |
| 30/07/2017 | 3.1 |
| 30/07/2017 | 3.2 |
| 30/07/2017 | 3.2 |
| 30/07/2017 | 3.2 |
| 30/07/2017 | 3.2 |
| 30/07/2017 | 3.1 |
| 30/07/2017 | 2.8 |
| 30/07/2017 | 2.6 |
| 31/07/2017 | 2.5 |
| 31/07/2017 | 2.4 |
| 31/07/2017 | 2.4 |
| 31/07/2017 | 2.5 |
| 31/07/2017 | 2.7 |
| 31/07/2017 | 3.1 |
| 31/07/2017 | 3.6 |
| 31/07/2017 | 3.9 |
| 31/07/2017 | 4.2 |
| 31/07/2017 | 4.3 |
| 31/07/2017 | 4.4 |
| 31/07/2017 | 4.4 |
| 31/07/2017 | 4.4 |
| 31/07/2017 | 4.3 |
| 31/07/2017 | 4.2 |
| 31/07/2017 | 4.2 |
| 31/07/2017 | 4.2 |
| 31/07/2017 | 4.1 |
| 31/07/2017 | 4 |
| 31/07/2017 | 3.8 |
| 31/07/2017 | 3.7 |
| 31/07/2017 | 3.3 |
| 31/07/2017 | 3 |
| 31/07/2017 | 2.7 |
| 01/08/2017 | 2.5 |
| 01/08/2017 | 2.5 |
| 01/08/2017 | 2.5 |
| 01/08/2017 | 2.6 |
| 01/08/2017 | 2.7 |
| 01/08/2017 | 3.1 |
| 01/08/2017 | 3.6 |
| 01/08/2017 | 4 |
| 01/08/2017 | 4.2 |
| 01/08/2017 | 4.4 |
| 01/08/2017 | 4.4 |
| 01/08/2017 | 4.4 |
| 01/08/2017 | 4.4 |
| 01/08/2017 | 4.3 |
| 01/08/2017 | 4.3 |
| 01/08/2017 | 4.2 |
| 01/08/2017 | 4.2 |
| 01/08/2017 | 4.2 |
| 01/08/2017 | 4.1 |
| 01/08/2017 | 3.9 |
| 01/08/2017 | 3.7 |
| 01/08/2017 | 3.3 |
| 01/08/2017 | 3 |
| 01/08/2017 | 2.7 |
| 02/08/2017 | 2.6 |
| 02/08/2017 | 2.5 |
| 02/08/2017 | 2.5 |
| 02/08/2017 | 2.6 |
| 02/08/2017 | 2.8 |
| 02/08/2017 | 3.2 |
| 02/08/2017 | 3.6 |
| 02/08/2017 | 4 |
| 02/08/2017 | 4.2 |
| 02/08/2017 | 4.4 |
| 02/08/2017 | 4.5 |
| 02/08/2017 | 4.5 |
| 02/08/2017 | 4.4 |
| 02/08/2017 | 4.4 |
| 02/08/2017 | 4.3 |
| 02/08/2017 | 4.2 |
| 02/08/2017 | 4.2 |
| 02/08/2017 | 4.2 |
| 02/08/2017 | 4.1 |
| 02/08/2017 | 3.9 |
| 02/08/2017 | 3.7 |
| 02/08/2017 | 3.3 |
| 02/08/2017 | 3 |
| 02/08/2017 | 2.7 |
| 03/08/2017 | 2.6 |
| 03/08/2017 | 2.5 |
| 03/08/2017 | 2.5 |
| 03/08/2017 | 2.6 |
| 03/08/2017 | 2.8 |
| 03/08/2017 | 3.1 |
| 03/08/2017 | 3.6 |
| 03/08/2017 | 4 |
| 03/08/2017 | 4.2 |
| 03/08/2017 | 4.4 |
| 03/08/2017 | 4.4 |
| 03/08/2017 | 4.4 |
| 03/08/2017 | 4.4 |
| 03/08/2017 | 4.3 |
| 03/08/2017 | 4.2 |
| 03/08/2017 | 4.2 |
| 03/08/2017 | 4.1 |
| 03/08/2017 | 4.1 |
| 03/08/2017 | 4 |
| 03/08/2017 | 3.8 |
| 03/08/2017 | 3.7 |
| 03/08/2017 | 3.3 |
| 03/08/2017 | 3 |
| 03/08/2017 | 2.7 |
| 04/08/2017 | 2.6 |
| 04/08/2017 | 2.5 |
| 04/08/2017 | 2.5 |
| 04/08/2017 | 2.6 |
| 04/08/2017 | 2.7 |
| 04/08/2017 | 3.1 |
| 04/08/2017 | 3.6 |
| 04/08/2017 | 4 |
| 04/08/2017 | 4.2 |
| 04/08/2017 | 4.4 |
| 04/08/2017 | 4.4 |
| 04/08/2017 | 4.4 |
| 04/08/2017 | 4.3 |
| 04/08/2017 | 4.2 |
| 04/08/2017 | 4.1 |
| 04/08/2017 | 4.1 |
| 04/08/2017 | 4 |
| 04/08/2017 | 4 |
| 04/08/2017 | 3.9 |
| 04/08/2017 | 3.7 |
| 04/08/2017 | 3.5 |
| 04/08/2017 | 3.2 |
| 04/08/2017 | 2.9 |
| 04/08/2017 | 2.7 |
| 05/08/2017 | 2.5 |
| 05/08/2017 | 2.5 |
| 05/08/2017 | 2.4 |
| 05/08/2017 | 2.4 |
| 05/08/2017 | 2.4 |
| 05/08/2017 | 2.4 |
| 05/08/2017 | 2.6 |
| 05/08/2017 | 3 |
| 05/08/2017 | 3.3 |
| 05/08/2017 | 3.6 |
| 05/08/2017 | 3.7 |
| 05/08/2017 | 3.7 |
| 05/08/2017 | 3.6 |
| 05/08/2017 | 3.5 |
| 05/08/2017 | 3.4 |
| 05/08/2017 | 3.4 |
| 05/08/2017 | 3.4 |
| 05/08/2017 | 3.4 |
| 05/08/2017 | 3.4 |
| 05/08/2017 | 3.3 |
| 05/08/2017 | 3.2 |
| 05/08/2017 | 3 |
| 05/08/2017 | 2.8 |
| 05/08/2017 | 2.6 |
| 06/08/2017 | 2.5 |
| 06/08/2017 | 2.4 |
| 06/08/2017 | 2.3 |
| 06/08/2017 | 2.3 |
| 06/08/2017 | 2.3 |
| 06/08/2017 | 2.3 |
| 06/08/2017 | 2.4 |
| 06/08/2017 | 2.6 |
| 06/08/2017 | 2.9 |
| 06/08/2017 | 3.1 |
| 06/08/2017 | 3.2 |
| 06/08/2017 | 3.3 |
| 06/08/2017 | 3.2 |
| 06/08/2017 | 3.1 |
| 06/08/2017 | 3.1 |
| 06/08/2017 | 3.1 |
| 06/08/2017 | 3.1 |
| 06/08/2017 | 3.2 |
| 06/08/2017 | 3.2 |
| 06/08/2017 | 3.2 |
| 06/08/2017 | 3.2 |
| 06/08/2017 | 3 |
| 06/08/2017 | 2.8 |
| 06/08/2017 | 2.6 |
| 07/08/2017 | 2.4 |
| 07/08/2017 | 2.4 |
| 07/08/2017 | 2.4 |
| 07/08/2017 | 2.5 |
| 07/08/2017 | 2.7 |
| 07/08/2017 | 3.1 |
| 07/08/2017 | 3.6 |
| 07/08/2017 | 3.9 |
| 07/08/2017 | 4.1 |
| 07/08/2017 | 4.3 |
| 07/08/2017 | 4.4 |
| 07/08/2017 | 4.4 |
| 07/08/2017 | 4.3 |
| 07/08/2017 | 4.3 |
| 07/08/2017 | 4.2 |
| 07/08/2017 | 4.1 |
| 07/08/2017 | 4.1 |
| 07/08/2017 | 4.1 |
| 07/08/2017 | 4 |
| 07/08/2017 | 3.8 |
| 07/08/2017 | 3.7 |
| 07/08/2017 | 3.3 |
| 07/08/2017 | 2.9 |
| 07/08/2017 | 2.7 |
| 08/08/2017 | 2.5 |
| 08/08/2017 | 2.5 |
| 08/08/2017 | 2.4 |
| 08/08/2017 | 2.6 |
| 08/08/2017 | 2.8 |
| 08/08/2017 | 3.1 |
| 08/08/2017 | 3.6 |
| 08/08/2017 | 4 |
| 08/08/2017 | 4.2 |
| 08/08/2017 | 4.3 |
| 08/08/2017 | 4.4 |
| 08/08/2017 | 4.4 |
| 08/08/2017 | 4.4 |
| 08/08/2017 | 4.3 |
| 08/08/2017 | 4.2 |
| 08/08/2017 | 4.2 |
| 08/08/2017 | 4.2 |
| 08/08/2017 | 4.1 |
| 08/08/2017 | 4 |
| 08/08/2017 | 3.9 |
| 08/08/2017 | 3.7 |
| 08/08/2017 | 3.3 |
| 08/08/2017 | 3 |
| 08/08/2017 | 2.7 |
| 09/08/2017 | 2.6 |
| 09/08/2017 | 2.5 |
| 09/08/2017 | 2.5 |
| 09/08/2017 | 2.6 |
| 09/08/2017 | 2.8 |
| 09/08/2017 | 3.2 |
| 09/08/2017 | 3.6 |
| 09/08/2017 | 4 |
| 09/08/2017 | 4.2 |
| 09/08/2017 | 4.4 |
| 09/08/2017 | 4.4 |
| 09/08/2017 | 4.5 |
| 09/08/2017 | 4.4 |
| 09/08/2017 | 4.3 |
| 09/08/2017 | 4.3 |
| 09/08/2017 | 4.2 |
| 09/08/2017 | 4.2 |
| 09/08/2017 | 4.1 |
| 09/08/2017 | 4 |
| 09/08/2017 | 3.9 |
| 09/08/2017 | 3.7 |
| 09/08/2017 | 3.3 |
| 09/08/2017 | 3 |
| 09/08/2017 | 2.7 |
| 10/08/2017 | 2.6 |
| 10/08/2017 | 2.5 |
| 10/08/2017 | 2.5 |
| 10/08/2017 | 2.6 |
| 10/08/2017 | 2.8 |
| 10/08/2017 | 3.1 |
| 10/08/2017 | 3.6 |
| 10/08/2017 | 4 |
| 10/08/2017 | 4.2 |
| 10/08/2017 | 4.3 |
| 10/08/2017 | 4.4 |
| 10/08/2017 | 4.4 |
| 10/08/2017 | 4.4 |
| 10/08/2017 | 4.3 |
| 10/08/2017 | 4.2 |
| 10/08/2017 | 4.2 |
| 10/08/2017 | 4.1 |
| 10/08/2017 | 4.1 |
| 10/08/2017 | 4 |
| 10/08/2017 | 3.8 |
| 10/08/2017 | 3.7 |
| 10/08/2017 | 3.3 |
| 10/08/2017 | 3 |
| 10/08/2017 | 2.7 |
| 11/08/2017 | 2.5 |
| 11/08/2017 | 2.5 |
| 11/08/2017 | 2.5 |
| 11/08/2017 | 2.6 |
| 11/08/2017 | 2.7 |
| 11/08/2017 | 3.1 |
| 11/08/2017 | 3.6 |
| 11/08/2017 | 4 |
| 11/08/2017 | 4.2 |
| 11/08/2017 | 4.4 |
| 11/08/2017 | 4.4 |
| 11/08/2017 | 4.4 |
| 11/08/2017 | 4.3 |
| 11/08/2017 | 4.2 |
| 11/08/2017 | 4.1 |
| 11/08/2017 | 4.1 |
| 11/08/2017 | 4 |
| 11/08/2017 | 4 |
| 11/08/2017 | 3.9 |
| 11/08/2017 | 3.7 |
| 11/08/2017 | 3.5 |
| 11/08/2017 | 3.2 |
| 11/08/2017 | 2.9 |
| 11/08/2017 | 2.7 |
| 12/08/2017 | 2.5 |
| 12/08/2017 | 2.4 |
| 12/08/2017 | 2.4 |
| 12/08/2017 | 2.4 |
| 12/08/2017 | 2.4 |
| 12/08/2017 | 2.4 |
| 12/08/2017 | 2.6 |
| 12/08/2017 | 3 |
| 12/08/2017 | 3.3 |
| 12/08/2017 | 3.5 |
| 12/08/2017 | 3.6 |
| 12/08/2017 | 3.6 |
| 12/08/2017 | 3.5 |
| 12/08/2017 | 3.4 |
| 12/08/2017 | 3.4 |
| 12/08/2017 | 3.3 |
| 12/08/2017 | 3.3 |
| 12/08/2017 | 3.4 |
| 12/08/2017 | 3.4 |
| 12/08/2017 | 3.3 |
| 12/08/2017 | 3.2 |
| 12/08/2017 | 3 |
| 12/08/2017 | 2.8 |
| 12/08/2017 | 2.6 |
| 13/08/2017 | 2.4 |
| 13/08/2017 | 2.4 |
| 13/08/2017 | 2.3 |
| 13/08/2017 | 2.3 |
| 13/08/2017 | 2.3 |
| 13/08/2017 | 2.3 |
| 13/08/2017 | 2.4 |
| 13/08/2017 | 2.6 |
| 13/08/2017 | 2.9 |
| 13/08/2017 | 3.1 |
| 13/08/2017 | 3.2 |
| 13/08/2017 | 3.3 |
| 13/08/2017 | 3.2 |
| 13/08/2017 | 3.1 |
| 13/08/2017 | 3.1 |
| 13/08/2017 | 3.1 |
| 13/08/2017 | 3.1 |
| 13/08/2017 | 3.2 |
| 13/08/2017 | 3.2 |
| 13/08/2017 | 3.2 |
| 13/08/2017 | 3.2 |
| 13/08/2017 | 3 |
| 13/08/2017 | 2.8 |
| 13/08/2017 | 2.6 |
| 14/08/2017 | 2.4 |
| 14/08/2017 | 2.4 |
| 14/08/2017 | 2.4 |
| 14/08/2017 | 2.5 |
| 14/08/2017 | 2.7 |
| 14/08/2017 | 3.1 |
| 14/08/2017 | 3.6 |
| 14/08/2017 | 3.9 |
| 14/08/2017 | 4.1 |
| 14/08/2017 | 4.3 |
| 14/08/2017 | 4.3 |
| 14/08/2017 | 4.4 |
| 14/08/2017 | 4.3 |
| 14/08/2017 | 4.3 |
| 14/08/2017 | 4.2 |
| 14/08/2017 | 4.1 |
| 14/08/2017 | 4.1 |
| 14/08/2017 | 4.1 |
| 14/08/2017 | 4.1 |
| 14/08/2017 | 3.9 |
| 14/08/2017 | 3.7 |
| 14/08/2017 | 3.3 |
| 14/08/2017 | 2.9 |
| 14/08/2017 | 2.7 |
| 15/08/2017 | 2.5 |
| 15/08/2017 | 2.4 |
| 15/08/2017 | 2.4 |
| 15/08/2017 | 2.5 |
| 15/08/2017 | 2.7 |
| 15/08/2017 | 3.1 |
| 15/08/2017 | 3.6 |
| 15/08/2017 | 4 |
| 15/08/2017 | 4.2 |
| 15/08/2017 | 4.3 |
| 15/08/2017 | 4.4 |
| 15/08/2017 | 4.4 |
| 15/08/2017 | 4.4 |
| 15/08/2017 | 4.3 |
| 15/08/2017 | 4.2 |
| 15/08/2017 | 4.2 |
| 15/08/2017 | 4.2 |
| 15/08/2017 | 4.2 |
| 15/08/2017 | 4.1 |
| 15/08/2017 | 3.9 |
| 15/08/2017 | 3.7 |
| 15/08/2017 | 3.3 |
| 15/08/2017 | 2.9 |
| 15/08/2017 | 2.7 |
| 16/08/2017 | 2.5 |
| 16/08/2017 | 2.5 |
| 16/08/2017 | 2.4 |
| 16/08/2017 | 2.6 |
| 16/08/2017 | 2.8 |
| 16/08/2017 | 3.2 |
| 16/08/2017 | 3.6 |
| 16/08/2017 | 4 |
| 16/08/2017 | 4.2 |
| 16/08/2017 | 4.4 |
| 16/08/2017 | 4.4 |
| 16/08/2017 | 4.5 |
| 16/08/2017 | 4.4 |
| 16/08/2017 | 4.3 |
| 16/08/2017 | 4.3 |
| 16/08/2017 | 4.2 |
| 16/08/2017 | 4.2 |
| 16/08/2017 | 4.1 |
| 16/08/2017 | 4.1 |
| 16/08/2017 | 3.9 |
| 16/08/2017 | 3.7 |
| 16/08/2017 | 3.3 |
| 16/08/2017 | 3 |
| 16/08/2017 | 2.7 |
| 17/08/2017 | 2.5 |
| 17/08/2017 | 2.5 |
| 17/08/2017 | 2.4 |
| 17/08/2017 | 2.5 |
| 17/08/2017 | 2.8 |
| 17/08/2017 | 3.2 |
| 17/08/2017 | 3.6 |
| 17/08/2017 | 4 |
| 17/08/2017 | 4.2 |
| 17/08/2017 | 4.3 |
| 17/08/2017 | 4.4 |
| 17/08/2017 | 4.4 |
| 17/08/2017 | 4.4 |
| 17/08/2017 | 4.3 |
| 17/08/2017 | 4.2 |
| 17/08/2017 | 4.1 |
| 17/08/2017 | 4.1 |
| 17/08/2017 | 4.1 |
| 17/08/2017 | 4.1 |
| 17/08/2017 | 3.9 |
| 17/08/2017 | 3.7 |
| 17/08/2017 | 3.3 |
| 17/08/2017 | 2.9 |
| 17/08/2017 | 2.7 |
| 18/08/2017 | 2.5 |
| 18/08/2017 | 2.4 |
| 18/08/2017 | 2.4 |
| 18/08/2017 | 2.5 |
| 18/08/2017 | 2.7 |
| 18/08/2017 | 3.1 |
| 18/08/2017 | 3.6 |
| 18/08/2017 | 4 |
| 18/08/2017 | 4.2 |
| 18/08/2017 | 4.4 |
| 18/08/2017 | 4.4 |
| 18/08/2017 | 4.4 |
| 18/08/2017 | 4.3 |
| 18/08/2017 | 4.2 |
| 18/08/2017 | 4.1 |
| 18/08/2017 | 4 |
| 18/08/2017 | 4 |
| 18/08/2017 | 4 |
| 18/08/2017 | 3.9 |
| 18/08/2017 | 3.8 |
| 18/08/2017 | 3.5 |
| 18/08/2017 | 3.2 |
| 18/08/2017 | 2.9 |
| 18/08/2017 | 2.7 |
| 19/08/2017 | 2.5 |
| 19/08/2017 | 2.4 |
| 19/08/2017 | 2.4 |
| 19/08/2017 | 2.4 |
| 19/08/2017 | 2.4 |
| 19/08/2017 | 2.4 |
| 19/08/2017 | 2.6 |
| 19/08/2017 | 2.9 |
| 19/08/2017 | 3.3 |
| 19/08/2017 | 3.6 |
| 19/08/2017 | 3.6 |
| 19/08/2017 | 3.6 |
| 19/08/2017 | 3.5 |
| 19/08/2017 | 3.4 |
| 19/08/2017 | 3.4 |
| 19/08/2017 | 3.3 |
| 19/08/2017 | 3.3 |
| 19/08/2017 | 3.4 |
| 19/08/2017 | 3.4 |
| 19/08/2017 | 3.4 |
| 19/08/2017 | 3.2 |
| 19/08/2017 | 3 |
| 19/08/2017 | 2.8 |
| 19/08/2017 | 2.6 |
| 20/08/2017 | 2.4 |
| 20/08/2017 | 2.4 |
| 20/08/2017 | 2.3 |
| 20/08/2017 | 2.3 |
| 20/08/2017 | 2.3 |
| 20/08/2017 | 2.3 |
| 20/08/2017 | 2.3 |
| 20/08/2017 | 2.6 |
| 20/08/2017 | 2.9 |
| 20/08/2017 | 3.1 |
| 20/08/2017 | 3.2 |
| 20/08/2017 | 3.3 |
| 20/08/2017 | 3.2 |
| 20/08/2017 | 3.1 |
| 20/08/2017 | 3.1 |
| 20/08/2017 | 3.1 |
| 20/08/2017 | 3.1 |
| 20/08/2017 | 3.2 |
| 20/08/2017 | 3.2 |
| 20/08/2017 | 3.3 |
| 20/08/2017 | 3.2 |
| 20/08/2017 | 3 |
| 20/08/2017 | 2.8 |
| 20/08/2017 | 2.6 |
| 21/08/2017 | 2.4 |
| 21/08/2017 | 2.4 |
| 21/08/2017 | 2.3 |
| 21/08/2017 | 2.5 |
| 21/08/2017 | 2.7 |
| 21/08/2017 | 3.1 |
| 21/08/2017 | 3.5 |
| 21/08/2017 | 3.9 |
| 21/08/2017 | 4.1 |
| 21/08/2017 | 4.3 |
| 21/08/2017 | 4.4 |
| 21/08/2017 | 4.4 |
| 21/08/2017 | 4.3 |
| 21/08/2017 | 4.3 |
| 21/08/2017 | 4.2 |
| 21/08/2017 | 4.1 |
| 21/08/2017 | 4.1 |
| 21/08/2017 | 4.1 |
| 21/08/2017 | 4.1 |
| 21/08/2017 | 3.9 |
| 21/08/2017 | 3.7 |
| 21/08/2017 | 3.3 |
| 21/08/2017 | 2.9 |
| 21/08/2017 | 2.7 |
| 22/08/2017 | 2.5 |
| 22/08/2017 | 2.4 |
| 22/08/2017 | 2.4 |
| 22/08/2017 | 2.5 |
| 22/08/2017 | 2.7 |
| 22/08/2017 | 3.2 |
| 22/08/2017 | 3.6 |
| 22/08/2017 | 4 |
| 22/08/2017 | 4.2 |
| 22/08/2017 | 4.3 |
| 22/08/2017 | 4.4 |
| 22/08/2017 | 4.4 |
| 22/08/2017 | 4.4 |
| 22/08/2017 | 4.3 |
| 22/08/2017 | 4.2 |
| 22/08/2017 | 4.2 |
| 22/08/2017 | 4.2 |
| 22/08/2017 | 4.2 |
| 22/08/2017 | 4.2 |
| 22/08/2017 | 4 |
| 22/08/2017 | 3.7 |
| 22/08/2017 | 3.3 |
| 22/08/2017 | 2.9 |
| 22/08/2017 | 2.7 |
| 23/08/2017 | 2.5 |
| 23/08/2017 | 2.4 |
| 23/08/2017 | 2.4 |
| 23/08/2017 | 2.5 |
| 23/08/2017 | 2.8 |
| 23/08/2017 | 3.2 |
| 23/08/2017 | 3.6 |
| 23/08/2017 | 4 |
| 23/08/2017 | 4.2 |
| 23/08/2017 | 4.4 |
| 23/08/2017 | 4.4 |
| 23/08/2017 | 4.5 |
| 23/08/2017 | 4.4 |
| 23/08/2017 | 4.3 |
| 23/08/2017 | 4.2 |
| 23/08/2017 | 4.2 |
| 23/08/2017 | 4.2 |
| 23/08/2017 | 4.2 |
| 23/08/2017 | 4.2 |
| 23/08/2017 | 4 |
| 23/08/2017 | 3.7 |
| 23/08/2017 | 3.3 |
| 23/08/2017 | 2.9 |
| 23/08/2017 | 2.7 |
| 24/08/2017 | 2.5 |
| 24/08/2017 | 2.4 |
| 24/08/2017 | 2.4 |
| 24/08/2017 | 2.5 |
| 24/08/2017 | 2.8 |
| 24/08/2017 | 3.2 |
| 24/08/2017 | 3.6 |
| 24/08/2017 | 4 |
| 24/08/2017 | 4.2 |
| 24/08/2017 | 4.4 |
| 24/08/2017 | 4.4 |
| 24/08/2017 | 4.4 |
| 24/08/2017 | 4.4 |
| 24/08/2017 | 4.3 |
| 24/08/2017 | 4.2 |
| 24/08/2017 | 4.1 |
| 24/08/2017 | 4.1 |
| 24/08/2017 | 4.1 |
| 24/08/2017 | 4.2 |
| 24/08/2017 | 4 |
| 24/08/2017 | 3.7 |
| 24/08/2017 | 3.3 |
| 24/08/2017 | 2.9 |
| 24/08/2017 | 2.7 |
| 25/08/2017 | 2.5 |
| 25/08/2017 | 2.4 |
| 25/08/2017 | 2.4 |
| 25/08/2017 | 2.5 |
| 25/08/2017 | 2.7 |
| 25/08/2017 | 3.1 |
| 25/08/2017 | 3.6 |
| 25/08/2017 | 4 |
| 25/08/2017 | 4.2 |
| 25/08/2017 | 4.4 |
| 25/08/2017 | 4.4 |
| 25/08/2017 | 4.4 |
| 25/08/2017 | 4.3 |
| 25/08/2017 | 4.2 |
| 25/08/2017 | 4.1 |
| 25/08/2017 | 4 |
| 25/08/2017 | 4 |
| 25/08/2017 | 4 |
| 25/08/2017 | 4 |
| 25/08/2017 | 3.8 |
| 25/08/2017 | 3.5 |
| 25/08/2017 | 3.2 |
| 25/08/2017 | 2.9 |
| 25/08/2017 | 2.7 |
| 26/08/2017 | 2.5 |
| 26/08/2017 | 2.4 |
| 26/08/2017 | 2.4 |
| 26/08/2017 | 2.4 |
| 26/08/2017 | 2.4 |
| 26/08/2017 | 2.4 |
| 26/08/2017 | 2.6 |
| 26/08/2017 | 2.9 |
| 26/08/2017 | 3.3 |
| 26/08/2017 | 3.6 |
| 26/08/2017 | 3.6 |
| 26/08/2017 | 3.6 |
| 26/08/2017 | 3.5 |
| 26/08/2017 | 3.4 |
| 26/08/2017 | 3.4 |
| 26/08/2017 | 3.3 |
| 26/08/2017 | 3.3 |
| 26/08/2017 | 3.4 |
| 26/08/2017 | 3.5 |
| 26/08/2017 | 3.4 |
| 26/08/2017 | 3.2 |
| 26/08/2017 | 3 |
| 26/08/2017 | 2.7 |
| 26/08/2017 | 2.6 |
| 27/08/2017 | 2.4 |
| 27/08/2017 | 2.3 |
| 27/08/2017 | 2.3 |
| 27/08/2017 | 2.3 |
| 27/08/2017 | 2.3 |
| 27/08/2017 | 2.3 |
| 27/08/2017 | 2.3 |
| 27/08/2017 | 2.6 |
| 27/08/2017 | 2.9 |
| 27/08/2017 | 3.1 |
| 27/08/2017 | 3.2 |
| 27/08/2017 | 3.3 |
| 27/08/2017 | 3.2 |
| 27/08/2017 | 3.1 |
| 27/08/2017 | 3.1 |
| 27/08/2017 | 3 |
| 27/08/2017 | 3.1 |
| 27/08/2017 | 3.2 |
| 27/08/2017 | 3.3 |
| 27/08/2017 | 3.3 |
| 27/08/2017 | 3.2 |
| 27/08/2017 | 3 |
| 27/08/2017 | 2.8 |
| 27/08/2017 | 2.6 |
| 28/08/2017 | 2.4 |
| 28/08/2017 | 2.3 |
| 28/08/2017 | 2.3 |
| 28/08/2017 | 2.4 |
| 28/08/2017 | 2.7 |
| 28/08/2017 | 3.1 |
| 28/08/2017 | 3.5 |
| 28/08/2017 | 3.9 |
| 28/08/2017 | 4.1 |
| 28/08/2017 | 4.3 |
| 28/08/2017 | 4.4 |
| 28/08/2017 | 4.4 |
| 28/08/2017 | 4.3 |
| 28/08/2017 | 4.3 |
| 28/08/2017 | 4.2 |
| 28/08/2017 | 4.1 |
| 28/08/2017 | 4.1 |
| 28/08/2017 | 4.1 |
| 28/08/2017 | 4.2 |
| 28/08/2017 | 4 |
| 28/08/2017 | 3.7 |
| 28/08/2017 | 3.3 |
| 28/08/2017 | 2.9 |
| 28/08/2017 | 2.7 |
| 29/08/2017 | 2.5 |
| 29/08/2017 | 2.4 |
| 29/08/2017 | 2.4 |
| 29/08/2017 | 2.5 |
| 29/08/2017 | 2.7 |
| 29/08/2017 | 3.2 |
| 29/08/2017 | 3.6 |
| 29/08/2017 | 4 |
| 29/08/2017 | 4.2 |
| 29/08/2017 | 4.3 |
| 29/08/2017 | 4.4 |
| 29/08/2017 | 4.4 |
| 29/08/2017 | 4.3 |
| 29/08/2017 | 4.3 |
| 29/08/2017 | 4.2 |
| 29/08/2017 | 4.2 |
| 29/08/2017 | 4.2 |
| 29/08/2017 | 4.2 |
| 29/08/2017 | 4.2 |
| 29/08/2017 | 4.1 |
| 29/08/2017 | 3.7 |
| 29/08/2017 | 3.3 |
| 29/08/2017 | 2.9 |
| 29/08/2017 | 2.7 |
| 30/08/2017 | 2.5 |
| 30/08/2017 | 2.4 |
| 30/08/2017 | 2.4 |
| 30/08/2017 | 2.5 |
| 30/08/2017 | 2.8 |
| 30/08/2017 | 3.2 |
| 30/08/2017 | 3.6 |
| 30/08/2017 | 4 |
| 30/08/2017 | 4.2 |
| 30/08/2017 | 4.4 |
| 30/08/2017 | 4.4 |
| 30/08/2017 | 4.5 |
| 30/08/2017 | 4.4 |
| 30/08/2017 | 4.3 |
| 30/08/2017 | 4.2 |
| 30/08/2017 | 4.2 |
| 30/08/2017 | 4.2 |
| 30/08/2017 | 4.2 |
| 30/08/2017 | 4.2 |
| 30/08/2017 | 4.1 |
| 30/08/2017 | 3.7 |
| 30/08/2017 | 3.3 |
| 30/08/2017 | 2.9 |
| 30/08/2017 | 2.7 |
| 31/08/2017 | 2.5 |
| 31/08/2017 | 2.4 |
| 31/08/2017 | 2.4 |
| 31/08/2017 | 2.5 |
| 31/08/2017 | 2.7 |
| 31/08/2017 | 3.2 |
| 31/08/2017 | 3.6 |
| 31/08/2017 | 4 |
| 31/08/2017 | 4.2 |
| 31/08/2017 | 4.4 |
| 31/08/2017 | 4.4 |
| 31/08/2017 | 4.4 |
| 31/08/2017 | 4.3 |
| 31/08/2017 | 4.3 |
| 31/08/2017 | 4.2 |
| 31/08/2017 | 4.1 |
| 31/08/2017 | 4.1 |
| 31/08/2017 | 4.1 |
| 31/08/2017 | 4.2 |
| 31/08/2017 | 4 |
| 31/08/2017 | 3.7 |
| 31/08/2017 | 3.3 |
| 31/08/2017 | 2.9 |
| 31/08/2017 | 2.7 |
| 01/09/2017 | 2.5 |
| 01/09/2017 | 2.4 |
| 01/09/2017 | 2.4 |
| 01/09/2017 | 2.5 |
| 01/09/2017 | 2.7 |
| 01/09/2017 | 3.1 |
| 01/09/2017 | 3.6 |
| 01/09/2017 | 3.9 |
| 01/09/2017 | 4.2 |
| 01/09/2017 | 4.4 |
| 01/09/2017 | 4.4 |
| 01/09/2017 | 4.4 |
| 01/09/2017 | 4.3 |
| 01/09/2017 | 4.2 |
| 01/09/2017 | 4.1 |
| 01/09/2017 | 4 |
| 01/09/2017 | 4 |
| 01/09/2017 | 4 |
| 01/09/2017 | 4.1 |
| 01/09/2017 | 3.9 |
| 01/09/2017 | 3.5 |
| 01/09/2017 | 3.2 |
| 01/09/2017 | 2.9 |
| 01/09/2017 | 2.6 |
| 02/09/2017 | 2.5 |
| 02/09/2017 | 2.4 |
| 02/09/2017 | 2.4 |
| 02/09/2017 | 2.4 |
| 02/09/2017 | 2.4 |
| 02/09/2017 | 2.5 |
| 02/09/2017 | 2.7 |
| 02/09/2017 | 3.1 |
| 02/09/2017 | 3.4 |
| 02/09/2017 | 3.6 |
| 02/09/2017 | 3.7 |
| 02/09/2017 | 3.7 |
| 02/09/2017 | 3.6 |
| 02/09/2017 | 3.5 |
| 02/09/2017 | 3.5 |
| 02/09/2017 | 3.4 |
| 02/09/2017 | 3.4 |
| 02/09/2017 | 3.5 |
| 02/09/2017 | 3.6 |
| 02/09/2017 | 3.6 |
| 02/09/2017 | 3.3 |
| 02/09/2017 | 3 |
| 02/09/2017 | 2.8 |
| 02/09/2017 | 2.5 |
| 03/09/2017 | 2.4 |
| 03/09/2017 | 2.3 |
| 03/09/2017 | 2.3 |
| 03/09/2017 | 2.3 |
| 03/09/2017 | 2.3 |
| 03/09/2017 | 2.4 |
| 03/09/2017 | 2.5 |
| 03/09/2017 | 2.7 |
| 03/09/2017 | 2.9 |
| 03/09/2017 | 3.1 |
| 03/09/2017 | 3.3 |
| 03/09/2017 | 3.3 |
| 03/09/2017 | 3.3 |
| 03/09/2017 | 3.2 |
| 03/09/2017 | 3.2 |
| 03/09/2017 | 3.1 |
| 03/09/2017 | 3.2 |
| 03/09/2017 | 3.3 |
| 03/09/2017 | 3.4 |
| 03/09/2017 | 3.5 |
| 03/09/2017 | 3.3 |
| 03/09/2017 | 3 |
| 03/09/2017 | 2.8 |
| 03/09/2017 | 2.5 |
| 04/09/2017 | 2.4 |
| 04/09/2017 | 2.3 |
| 04/09/2017 | 2.3 |
| 04/09/2017 | 2.4 |
| 04/09/2017 | 2.7 |
| 04/09/2017 | 3.2 |
| 04/09/2017 | 3.7 |
| 04/09/2017 | 4 |
| 04/09/2017 | 4.2 |
| 04/09/2017 | 4.4 |
| 04/09/2017 | 4.4 |
| 04/09/2017 | 4.5 |
| 04/09/2017 | 4.4 |
| 04/09/2017 | 4.4 |
| 04/09/2017 | 4.3 |
| 04/09/2017 | 4.2 |
| 04/09/2017 | 4.2 |
| 04/09/2017 | 4.2 |
| 04/09/2017 | 4.4 |
| 04/09/2017 | 4.2 |
| 04/09/2017 | 3.8 |
| 04/09/2017 | 3.3 |
| 04/09/2017 | 2.9 |
| 04/09/2017 | 2.7 |
| 05/09/2017 | 2.5 |
| 05/09/2017 | 2.4 |
| 05/09/2017 | 2.4 |
| 05/09/2017 | 2.5 |
| 05/09/2017 | 2.8 |
| 05/09/2017 | 3.3 |
| 05/09/2017 | 3.8 |
| 05/09/2017 | 4.1 |
| 05/09/2017 | 4.3 |
| 05/09/2017 | 4.4 |
| 05/09/2017 | 4.5 |
| 05/09/2017 | 4.5 |
| 05/09/2017 | 4.4 |
| 05/09/2017 | 4.4 |
| 05/09/2017 | 4.3 |
| 05/09/2017 | 4.3 |
| 05/09/2017 | 4.3 |
| 05/09/2017 | 4.3 |
| 05/09/2017 | 4.4 |
| 05/09/2017 | 4.2 |
| 05/09/2017 | 3.8 |
| 05/09/2017 | 3.3 |
| 05/09/2017 | 2.9 |
| 05/09/2017 | 2.7 |
| 06/09/2017 | 2.5 |
| 06/09/2017 | 2.4 |
| 06/09/2017 | 2.4 |
| 06/09/2017 | 2.5 |
| 06/09/2017 | 2.8 |
| 06/09/2017 | 3.3 |
| 06/09/2017 | 3.8 |
| 06/09/2017 | 4.1 |
| 06/09/2017 | 4.3 |
| 06/09/2017 | 4.5 |
| 06/09/2017 | 4.5 |
| 06/09/2017 | 4.5 |
| 06/09/2017 | 4.5 |
| 06/09/2017 | 4.4 |
| 06/09/2017 | 4.3 |
| 06/09/2017 | 4.3 |
| 06/09/2017 | 4.3 |
| 06/09/2017 | 4.3 |
| 06/09/2017 | 4.4 |
| 06/09/2017 | 4.3 |
| 06/09/2017 | 3.8 |
| 06/09/2017 | 3.3 |
| 06/09/2017 | 2.9 |
| 06/09/2017 | 2.7 |
| 07/09/2017 | 2.5 |
| 07/09/2017 | 2.4 |
| 07/09/2017 | 2.4 |
| 07/09/2017 | 2.5 |
| 07/09/2017 | 2.8 |
| 07/09/2017 | 3.3 |
| 07/09/2017 | 3.8 |
| 07/09/2017 | 4.1 |
| 07/09/2017 | 4.3 |
| 07/09/2017 | 4.4 |
| 07/09/2017 | 4.5 |
| 07/09/2017 | 4.5 |
| 07/09/2017 | 4.4 |
| 07/09/2017 | 4.4 |
| 07/09/2017 | 4.3 |
| 07/09/2017 | 4.2 |
| 07/09/2017 | 4.2 |
| 07/09/2017 | 4.2 |
| 07/09/2017 | 4.4 |
| 07/09/2017 | 4.2 |
| 07/09/2017 | 3.8 |
| 07/09/2017 | 3.3 |
| 07/09/2017 | 2.9 |
| 07/09/2017 | 2.7 |
| 08/09/2017 | 2.5 |
| 08/09/2017 | 2.4 |
| 08/09/2017 | 2.4 |
| 08/09/2017 | 2.5 |
| 08/09/2017 | 2.8 |
| 08/09/2017 | 3.3 |
| 08/09/2017 | 3.7 |
| 08/09/2017 | 4.1 |
| 08/09/2017 | 4.3 |
| 08/09/2017 | 4.4 |
| 08/09/2017 | 4.5 |
| 08/09/2017 | 4.5 |
| 08/09/2017 | 4.4 |
| 08/09/2017 | 4.3 |
| 08/09/2017 | 4.2 |
| 08/09/2017 | 4.1 |
| 08/09/2017 | 4.1 |
| 08/09/2017 | 4.1 |
| 08/09/2017 | 4.2 |
| 08/09/2017 | 4.1 |
| 08/09/2017 | 3.6 |
| 08/09/2017 | 3.2 |
| 08/09/2017 | 2.9 |
| 08/09/2017 | 2.6 |
| 09/09/2017 | 2.5 |
| 09/09/2017 | 2.4 |
| 09/09/2017 | 2.4 |
| 09/09/2017 | 2.4 |
| 09/09/2017 | 2.4 |
| 09/09/2017 | 2.6 |
| 09/09/2017 | 2.7 |
| 09/09/2017 | 3.1 |
| 09/09/2017 | 3.4 |
| 09/09/2017 | 3.6 |
| 09/09/2017 | 3.7 |
| 09/09/2017 | 3.7 |
| 09/09/2017 | 3.6 |
| 09/09/2017 | 3.5 |
| 09/09/2017 | 3.5 |
| 09/09/2017 | 3.4 |
| 09/09/2017 | 3.4 |
| 09/09/2017 | 3.5 |
| 09/09/2017 | 3.7 |
| 09/09/2017 | 3.7 |
| 09/09/2017 | 3.3 |
| 09/09/2017 | 3 |
| 09/09/2017 | 2.7 |
| 09/09/2017 | 2.5 |
| 10/09/2017 | 2.4 |
| 10/09/2017 | 2.3 |
| 10/09/2017 | 2.3 |
| 10/09/2017 | 2.3 |
| 10/09/2017 | 2.3 |
| 10/09/2017 | 2.4 |
| 10/09/2017 | 2.4 |
| 10/09/2017 | 2.7 |
| 10/09/2017 | 2.9 |
| 10/09/2017 | 3.1 |
| 10/09/2017 | 3.3 |
| 10/09/2017 | 3.3 |
| 10/09/2017 | 3.3 |
| 10/09/2017 | 3.2 |
| 10/09/2017 | 3.1 |
| 10/09/2017 | 3.1 |
| 10/09/2017 | 3.2 |
| 10/09/2017 | 3.3 |
| 10/09/2017 | 3.5 |
| 10/09/2017 | 3.5 |
| 10/09/2017 | 3.3 |
| 10/09/2017 | 3 |
| 10/09/2017 | 2.7 |
| 10/09/2017 | 2.5 |
| 11/09/2017 | 2.4 |
| 11/09/2017 | 2.3 |
| 11/09/2017 | 2.3 |
| 11/09/2017 | 2.4 |
| 11/09/2017 | 2.7 |
| 11/09/2017 | 3.3 |
| 11/09/2017 | 3.7 |
| 11/09/2017 | 4 |
| 11/09/2017 | 4.2 |
| 11/09/2017 | 4.4 |
| 11/09/2017 | 4.4 |
| 11/09/2017 | 4.5 |
| 11/09/2017 | 4.4 |
| 11/09/2017 | 4.4 |
| 11/09/2017 | 4.3 |
| 11/09/2017 | 4.2 |
| 11/09/2017 | 4.2 |
| 11/09/2017 | 4.2 |
| 11/09/2017 | 4.4 |
| 11/09/2017 | 4.3 |
| 11/09/2017 | 3.8 |
| 11/09/2017 | 3.3 |
| 11/09/2017 | 2.9 |
| 11/09/2017 | 2.6 |
| 12/09/2017 | 2.5 |
| 12/09/2017 | 2.4 |
| 12/09/2017 | 2.4 |
| 12/09/2017 | 2.5 |
| 12/09/2017 | 2.8 |
| 12/09/2017 | 3.3 |
| 12/09/2017 | 3.8 |
| 12/09/2017 | 4.1 |
| 12/09/2017 | 4.3 |
| 12/09/2017 | 4.4 |
| 12/09/2017 | 4.5 |
| 12/09/2017 | 4.5 |
| 12/09/2017 | 4.4 |
| 12/09/2017 | 4.4 |
| 12/09/2017 | 4.3 |
| 12/09/2017 | 4.3 |
| 12/09/2017 | 4.3 |
| 12/09/2017 | 4.3 |
| 12/09/2017 | 4.5 |
| 12/09/2017 | 4.3 |
| 12/09/2017 | 3.8 |
| 12/09/2017 | 3.3 |
| 12/09/2017 | 2.9 |
| 12/09/2017 | 2.7 |
| 13/09/2017 | 2.5 |
| 13/09/2017 | 2.4 |
| 13/09/2017 | 2.4 |
| 13/09/2017 | 2.5 |
| 13/09/2017 | 2.8 |
| 13/09/2017 | 3.3 |
| 13/09/2017 | 3.8 |
| 13/09/2017 | 4.1 |
| 13/09/2017 | 4.3 |
| 13/09/2017 | 4.5 |
| 13/09/2017 | 4.5 |
| 13/09/2017 | 4.5 |
| 13/09/2017 | 4.5 |
| 13/09/2017 | 4.4 |
| 13/09/2017 | 4.3 |
| 13/09/2017 | 4.3 |
| 13/09/2017 | 4.2 |
| 13/09/2017 | 4.3 |
| 13/09/2017 | 4.5 |
| 13/09/2017 | 4.3 |
| 13/09/2017 | 3.8 |
| 13/09/2017 | 3.3 |
| 13/09/2017 | 2.9 |
| 13/09/2017 | 2.7 |
| 14/09/2017 | 2.5 |
| 14/09/2017 | 2.4 |
| 14/09/2017 | 2.4 |
| 14/09/2017 | 2.5 |
| 14/09/2017 | 2.8 |
| 14/09/2017 | 3.3 |
| 14/09/2017 | 3.8 |
| 14/09/2017 | 4.1 |
| 14/09/2017 | 4.3 |
| 14/09/2017 | 4.4 |
| 14/09/2017 | 4.5 |
| 14/09/2017 | 4.5 |
| 14/09/2017 | 4.4 |
| 14/09/2017 | 4.4 |
| 14/09/2017 | 4.3 |
| 14/09/2017 | 4.2 |
| 14/09/2017 | 4.2 |
| 14/09/2017 | 4.3 |
| 14/09/2017 | 4.5 |
| 14/09/2017 | 4.3 |
| 14/09/2017 | 3.8 |
| 14/09/2017 | 3.3 |
| 14/09/2017 | 2.9 |
| 14/09/2017 | 2.7 |
| 15/09/2017 | 2.5 |
| 15/09/2017 | 2.4 |
| 15/09/2017 | 2.4 |
| 15/09/2017 | 2.5 |
| 15/09/2017 | 2.8 |
| 15/09/2017 | 3.3 |
| 15/09/2017 | 3.7 |
| 15/09/2017 | 4.1 |
| 15/09/2017 | 4.3 |
| 15/09/2017 | 4.4 |
| 15/09/2017 | 4.5 |
| 15/09/2017 | 4.5 |
| 15/09/2017 | 4.4 |
| 15/09/2017 | 4.3 |
| 15/09/2017 | 4.2 |
| 15/09/2017 | 4.1 |
| 15/09/2017 | 4.1 |
| 15/09/2017 | 4.1 |
| 15/09/2017 | 4.3 |
| 15/09/2017 | 4.1 |
| 15/09/2017 | 3.6 |
| 15/09/2017 | 3.2 |
| 15/09/2017 | 2.9 |
| 15/09/2017 | 2.6 |
| 16/09/2017 | 2.5 |
| 16/09/2017 | 2.4 |
| 16/09/2017 | 2.4 |
| 16/09/2017 | 2.4 |
| 16/09/2017 | 2.4 |
| 16/09/2017 | 2.6 |
| 16/09/2017 | 2.7 |
| 16/09/2017 | 3.1 |
| 16/09/2017 | 3.4 |
| 16/09/2017 | 3.6 |
| 16/09/2017 | 3.7 |
| 16/09/2017 | 3.7 |
| 16/09/2017 | 3.6 |
| 16/09/2017 | 3.5 |
| 16/09/2017 | 3.4 |
| 16/09/2017 | 3.4 |
| 16/09/2017 | 3.4 |
| 16/09/2017 | 3.5 |
| 16/09/2017 | 3.8 |
| 16/09/2017 | 3.7 |
| 16/09/2017 | 3.3 |
| 16/09/2017 | 3 |
| 16/09/2017 | 2.7 |
| 16/09/2017 | 2.5 |
| 17/09/2017 | 2.4 |
| 17/09/2017 | 2.3 |
| 17/09/2017 | 2.3 |
| 17/09/2017 | 2.3 |
| 17/09/2017 | 2.3 |
| 17/09/2017 | 2.4 |
| 17/09/2017 | 2.5 |
| 17/09/2017 | 2.7 |
| 17/09/2017 | 3 |
| 17/09/2017 | 3.1 |
| 17/09/2017 | 3.3 |
| 17/09/2017 | 3.4 |
| 17/09/2017 | 3.3 |
| 17/09/2017 | 3.2 |
| 17/09/2017 | 3.1 |
| 17/09/2017 | 3.1 |
| 17/09/2017 | 3.2 |
| 17/09/2017 | 3.3 |
| 17/09/2017 | 3.6 |
| 17/09/2017 | 3.6 |
| 17/09/2017 | 3.3 |
| 17/09/2017 | 3 |
| 17/09/2017 | 2.7 |
| 17/09/2017 | 2.5 |
| 18/09/2017 | 2.4 |
| 18/09/2017 | 2.3 |
| 18/09/2017 | 2.3 |
| 18/09/2017 | 2.4 |
| 18/09/2017 | 2.7 |
| 18/09/2017 | 3.3 |
| 18/09/2017 | 3.7 |
| 18/09/2017 | 4.1 |
| 18/09/2017 | 4.3 |
| 18/09/2017 | 4.4 |
| 18/09/2017 | 4.4 |
| 18/09/2017 | 4.5 |
| 18/09/2017 | 4.4 |
| 18/09/2017 | 4.4 |
| 18/09/2017 | 4.3 |
| 18/09/2017 | 4.2 |
| 18/09/2017 | 4.2 |
| 18/09/2017 | 4.3 |
| 18/09/2017 | 4.5 |
| 18/09/2017 | 4.3 |
| 18/09/2017 | 3.8 |
| 18/09/2017 | 3.3 |
| 18/09/2017 | 2.9 |
| 18/09/2017 | 2.6 |
| 19/09/2017 | 2.5 |
| 19/09/2017 | 2.4 |
| 19/09/2017 | 2.4 |
| 19/09/2017 | 2.5 |
| 19/09/2017 | 2.8 |
| 19/09/2017 | 3.3 |
| 19/09/2017 | 3.8 |
| 19/09/2017 | 4.1 |
| 19/09/2017 | 4.3 |
| 19/09/2017 | 4.4 |
| 19/09/2017 | 4.5 |
| 19/09/2017 | 4.5 |
| 19/09/2017 | 4.4 |
| 19/09/2017 | 4.4 |
| 19/09/2017 | 4.3 |
| 19/09/2017 | 4.3 |
| 19/09/2017 | 4.3 |
| 19/09/2017 | 4.4 |
| 19/09/2017 | 4.6 |
| 19/09/2017 | 4.3 |
| 19/09/2017 | 3.8 |
| 19/09/2017 | 3.3 |
| 19/09/2017 | 2.9 |
| 19/09/2017 | 2.7 |
| 20/09/2017 | 2.5 |
| 20/09/2017 | 2.4 |
| 20/09/2017 | 2.4 |
| 20/09/2017 | 2.5 |
| 20/09/2017 | 2.8 |
| 20/09/2017 | 3.4 |
| 20/09/2017 | 3.8 |
| 20/09/2017 | 4.2 |
| 20/09/2017 | 4.4 |
| 20/09/2017 | 4.5 |
| 20/09/2017 | 4.5 |
| 20/09/2017 | 4.5 |
| 20/09/2017 | 4.5 |
| 20/09/2017 | 4.4 |
| 20/09/2017 | 4.3 |
| 20/09/2017 | 4.3 |
| 20/09/2017 | 4.3 |
| 20/09/2017 | 4.4 |
| 20/09/2017 | 4.6 |
| 20/09/2017 | 4.3 |
| 20/09/2017 | 3.8 |
| 20/09/2017 | 3.3 |
| 20/09/2017 | 2.9 |
| 20/09/2017 | 2.7 |
| 21/09/2017 | 2.5 |
| 21/09/2017 | 2.4 |
| 21/09/2017 | 2.4 |
| 21/09/2017 | 2.5 |
| 21/09/2017 | 2.8 |
| 21/09/2017 | 3.3 |
| 21/09/2017 | 3.8 |
| 21/09/2017 | 4.2 |
| 21/09/2017 | 4.3 |
| 21/09/2017 | 4.5 |
| 21/09/2017 | 4.5 |
| 21/09/2017 | 4.5 |
| 21/09/2017 | 4.5 |
| 21/09/2017 | 4.4 |
| 21/09/2017 | 4.3 |
| 21/09/2017 | 4.2 |
| 21/09/2017 | 4.3 |
| 21/09/2017 | 4.4 |
| 21/09/2017 | 4.6 |
| 21/09/2017 | 4.3 |
| 21/09/2017 | 3.8 |
| 21/09/2017 | 3.3 |
| 21/09/2017 | 2.9 |
| 21/09/2017 | 2.7 |
| 22/09/2017 | 2.5 |
| 22/09/2017 | 2.4 |
| 22/09/2017 | 2.4 |
| 22/09/2017 | 2.5 |
| 22/09/2017 | 2.8 |
| 22/09/2017 | 3.3 |
| 22/09/2017 | 3.8 |
| 22/09/2017 | 4.1 |
| 22/09/2017 | 4.3 |
| 22/09/2017 | 4.5 |
| 22/09/2017 | 4.5 |
| 22/09/2017 | 4.5 |
| 22/09/2017 | 4.4 |
| 22/09/2017 | 4.3 |
| 22/09/2017 | 4.2 |
| 22/09/2017 | 4.1 |
| 22/09/2017 | 4.2 |
| 22/09/2017 | 4.3 |
| 22/09/2017 | 4.4 |
| 22/09/2017 | 4.1 |
| 22/09/2017 | 3.6 |
| 22/09/2017 | 3.2 |
| 22/09/2017 | 2.9 |
| 22/09/2017 | 2.6 |
| 23/09/2017 | 2.5 |
| 23/09/2017 | 2.4 |
| 23/09/2017 | 2.4 |
| 23/09/2017 | 2.4 |
| 23/09/2017 | 2.4 |
| 23/09/2017 | 2.6 |
| 23/09/2017 | 2.8 |
| 23/09/2017 | 3.1 |
| 23/09/2017 | 3.4 |
| 23/09/2017 | 3.7 |
| 23/09/2017 | 3.7 |
| 23/09/2017 | 3.7 |
| 23/09/2017 | 3.6 |
| 23/09/2017 | 3.5 |
| 23/09/2017 | 3.5 |
| 23/09/2017 | 3.4 |
| 23/09/2017 | 3.5 |
| 23/09/2017 | 3.6 |
| 23/09/2017 | 3.8 |
| 23/09/2017 | 3.7 |
| 23/09/2017 | 3.3 |
| 23/09/2017 | 3 |
| 23/09/2017 | 2.8 |
| 23/09/2017 | 2.5 |
| 24/09/2017 | 2.4 |
| 24/09/2017 | 2.3 |
| 24/09/2017 | 2.3 |
| 24/09/2017 | 2.3 |
| 24/09/2017 | 2.3 |
| 24/09/2017 | 2.4 |
| 24/09/2017 | 2.5 |
| 24/09/2017 | 2.7 |
| 24/09/2017 | 3 |
| 24/09/2017 | 3.2 |
| 24/09/2017 | 3.3 |
| 24/09/2017 | 3.4 |
| 24/09/2017 | 3.3 |
| 24/09/2017 | 3.2 |
| 24/09/2017 | 3.2 |
| 24/09/2017 | 3.1 |
| 24/09/2017 | 3.2 |
| 24/09/2017 | 3.4 |
| 24/09/2017 | 3.6 |
| 24/09/2017 | 3.6 |
| 24/09/2017 | 3.3 |
| 24/09/2017 | 3 |
| 24/09/2017 | 2.8 |
| 24/09/2017 | 2.5 |
| 25/09/2017 | 2.4 |
| 25/09/2017 | 2.3 |
| 25/09/2017 | 2.3 |
| 25/09/2017 | 2.4 |
| 25/09/2017 | 2.7 |
| 25/09/2017 | 3.3 |
| 25/09/2017 | 3.8 |
| 25/09/2017 | 4.1 |
| 25/09/2017 | 4.3 |
| 25/09/2017 | 4.4 |
| 25/09/2017 | 4.5 |
| 25/09/2017 | 4.5 |
| 25/09/2017 | 4.4 |
| 25/09/2017 | 4.4 |
| 25/09/2017 | 4.3 |
| 25/09/2017 | 4.2 |
| 25/09/2017 | 4.3 |
| 25/09/2017 | 4.4 |
| 25/09/2017 | 4.6 |
| 25/09/2017 | 4.3 |
| 25/09/2017 | 3.8 |
| 25/09/2017 | 3.3 |
| 25/09/2017 | 2.9 |
| 25/09/2017 | 2.7 |
| 26/09/2017 | 2.5 |
| 26/09/2017 | 2.4 |
| 26/09/2017 | 2.4 |
| 26/09/2017 | 2.5 |
| 26/09/2017 | 2.8 |
| 26/09/2017 | 3.4 |
| 26/09/2017 | 3.8 |
| 26/09/2017 | 4.2 |
| 26/09/2017 | 4.4 |
| 26/09/2017 | 4.5 |
| 26/09/2017 | 4.5 |
| 26/09/2017 | 4.5 |
| 26/09/2017 | 4.5 |
| 26/09/2017 | 4.4 |
| 26/09/2017 | 4.3 |
| 26/09/2017 | 4.3 |
| 26/09/2017 | 4.4 |
| 26/09/2017 | 4.5 |
| 26/09/2017 | 4.7 |
| 26/09/2017 | 4.3 |
| 26/09/2017 | 3.8 |
| 26/09/2017 | 3.3 |
| 26/09/2017 | 2.9 |
| 26/09/2017 | 2.7 |
| 27/09/2017 | 2.5 |
| 27/09/2017 | 2.4 |
| 27/09/2017 | 2.4 |
| 27/09/2017 | 2.5 |
| 27/09/2017 | 2.8 |
| 27/09/2017 | 3.4 |
| 27/09/2017 | 3.9 |
| 27/09/2017 | 4.2 |
| 27/09/2017 | 4.4 |
| 27/09/2017 | 4.5 |
| 27/09/2017 | 4.6 |
| 27/09/2017 | 4.6 |
| 27/09/2017 | 4.5 |
| 27/09/2017 | 4.4 |
| 27/09/2017 | 4.4 |
| 27/09/2017 | 4.3 |
| 27/09/2017 | 4.4 |
| 27/09/2017 | 4.5 |
| 27/09/2017 | 4.7 |
| 27/09/2017 | 4.3 |
| 27/09/2017 | 3.8 |
| 27/09/2017 | 3.3 |
| 27/09/2017 | 2.9 |
| 27/09/2017 | 2.7 |
| 28/09/2017 | 2.5 |
| 28/09/2017 | 2.4 |
| 28/09/2017 | 2.4 |
| 28/09/2017 | 2.5 |
| 28/09/2017 | 2.8 |
| 28/09/2017 | 3.4 |
| 28/09/2017 | 3.9 |
| 28/09/2017 | 4.2 |
| 28/09/2017 | 4.4 |
| 28/09/2017 | 4.5 |
| 28/09/2017 | 4.5 |
| 28/09/2017 | 4.5 |
| 28/09/2017 | 4.5 |
| 28/09/2017 | 4.4 |
| 28/09/2017 | 4.3 |
| 28/09/2017 | 4.3 |
| 28/09/2017 | 4.3 |
| 28/09/2017 | 4.5 |
| 28/09/2017 | 4.6 |
| 28/09/2017 | 4.3 |
| 28/09/2017 | 3.8 |
| 28/09/2017 | 3.3 |
| 28/09/2017 | 2.9 |
| 28/09/2017 | 2.7 |
| 29/09/2017 | 2.5 |
| 29/09/2017 | 2.4 |
| 29/09/2017 | 2.4 |
| 29/09/2017 | 2.5 |
| 29/09/2017 | 2.8 |
| 29/09/2017 | 3.3 |
| 29/09/2017 | 3.8 |
| 29/09/2017 | 4.2 |
| 29/09/2017 | 4.4 |
| 29/09/2017 | 4.5 |
| 29/09/2017 | 4.5 |
| 29/09/2017 | 4.5 |
| 29/09/2017 | 4.4 |
| 29/09/2017 | 4.3 |
| 29/09/2017 | 4.2 |
| 29/09/2017 | 4.2 |
| 29/09/2017 | 4.2 |
| 29/09/2017 | 4.4 |
| 29/09/2017 | 4.5 |
| 29/09/2017 | 4.1 |
| 29/09/2017 | 3.6 |
| 29/09/2017 | 3.2 |
| 29/09/2017 | 2.9 |
| 29/09/2017 | 2.6 |
| 30/09/2017 | 2.5 |
| 30/09/2017 | 2.4 |
| 30/09/2017 | 2.4 |
| 30/09/2017 | 2.4 |
| 30/09/2017 | 2.5 |
| 30/09/2017 | 2.6 |
| 30/09/2017 | 2.8 |
| 30/09/2017 | 3.1 |
| 30/09/2017 | 3.4 |
| 30/09/2017 | 3.7 |
| 30/09/2017 | 3.7 |
| 30/09/2017 | 3.7 |
| 30/09/2017 | 3.6 |
| 30/09/2017 | 3.5 |
| 30/09/2017 | 3.5 |
| 30/09/2017 | 3.4 |
| 30/09/2017 | 3.5 |
| 30/09/2017 | 3.7 |
| 30/09/2017 | 3.9 |
| 30/09/2017 | 3.7 |
| 30/09/2017 | 3.3 |
| 30/09/2017 | 3 |
| 30/09/2017 | 2.8 |
| 30/09/2017 | 2.5 |
| 01/10/2017 | 2.4 |
| 01/10/2017 | 2.3 |
| 01/10/2017 | 2.3 |
| 01/10/2017 | 2.3 |
| 01/10/2017 | 2.3 |
| 01/10/2017 | 2.4 |
| 01/10/2017 | 2.5 |
| 01/10/2017 | 2.7 |
| 01/10/2017 | 3 |
| 01/10/2017 | 3.2 |
| 01/10/2017 | 3.3 |
| 01/10/2017 | 3.4 |
| 01/10/2017 | 3.3 |
| 01/10/2017 | 3.2 |
| 01/10/2017 | 3.2 |
| 01/10/2017 | 3.2 |
| 01/10/2017 | 3.3 |
| 01/10/2017 | 3.5 |
| 01/10/2017 | 3.7 |
| 01/10/2017 | 3.6 |
| 01/10/2017 | 3.3 |
| 01/10/2017 | 3 |
| 01/10/2017 | 2.8 |
| 01/10/2017 | 2.5 |
| 02/10/2017 | 2.4 |
| 02/10/2017 | 2.3 |
| 02/10/2017 | 2.3 |
| 02/10/2017 | 2.3 |
| 02/10/2017 | 2.5 |
| 02/10/2017 | 2.8 |
| 02/10/2017 | 3.1 |
| 02/10/2017 | 3.4 |
| 02/10/2017 | 3.7 |
| 02/10/2017 | 3.8 |
| 02/10/2017 | 3.9 |
| 02/10/2017 | 3.9 |
| 02/10/2017 | 3.8 |
| 02/10/2017 | 3.7 |
| 02/10/2017 | 3.6 |
| 02/10/2017 | 3.7 |
| 02/10/2017 | 3.8 |
| 02/10/2017 | 4 |
| 02/10/2017 | 4.1 |
| 02/10/2017 | 3.9 |
| 02/10/2017 | 3.4 |
| 02/10/2017 | 3.1 |
| 02/10/2017 | 2.9 |
| 02/10/2017 | 2.6 |
| 03/10/2017 | 2.5 |
| 03/10/2017 | 2.4 |
| 03/10/2017 | 2.3 |
| 03/10/2017 | 2.3 |
| 03/10/2017 | 2.4 |
| 03/10/2017 | 2.5 |
| 03/10/2017 | 2.6 |
| 03/10/2017 | 2.9 |
| 03/10/2017 | 3.1 |
| 03/10/2017 | 3.3 |
| 03/10/2017 | 3.4 |
| 03/10/2017 | 3.4 |
| 03/10/2017 | 3.3 |
| 03/10/2017 | 3.2 |
| 03/10/2017 | 3.2 |
| 03/10/2017 | 3.2 |
| 03/10/2017 | 3.2 |
| 03/10/2017 | 3.5 |
| 03/10/2017 | 3.6 |
| 03/10/2017 | 3.5 |
| 03/10/2017 | 3.2 |
| 03/10/2017 | 2.9 |
| 03/10/2017 | 2.7 |
| 03/10/2017 | 2.7 |
| 04/10/2017 | 2.5 |
| 04/10/2017 | 2.4 |
| 04/10/2017 | 2.4 |
| 04/10/2017 | 2.5 |
| 04/10/2017 | 2.8 |
| 04/10/2017 | 3.4 |
| 04/10/2017 | 3.9 |
| 04/10/2017 | 4.3 |
| 04/10/2017 | 4.4 |
| 04/10/2017 | 4.5 |
| 04/10/2017 | 4.6 |
| 04/10/2017 | 4.6 |
| 04/10/2017 | 4.5 |
| 04/10/2017 | 4.4 |
| 04/10/2017 | 4.4 |
| 04/10/2017 | 4.3 |
| 04/10/2017 | 4.4 |
| 04/10/2017 | 4.6 |
| 04/10/2017 | 4.8 |
| 04/10/2017 | 4.4 |
| 04/10/2017 | 3.8 |
| 04/10/2017 | 3.3 |
| 04/10/2017 | 3 |
| 04/10/2017 | 2.7 |
| 05/10/2017 | 2.5 |
| 05/10/2017 | 2.4 |
| 05/10/2017 | 2.4 |
| 05/10/2017 | 2.5 |
| 05/10/2017 | 2.8 |
| 05/10/2017 | 3.4 |
| 05/10/2017 | 3.9 |
| 05/10/2017 | 4.2 |
| 05/10/2017 | 4.4 |
| 05/10/2017 | 4.5 |
| 05/10/2017 | 4.5 |
| 05/10/2017 | 4.5 |
| 05/10/2017 | 4.5 |
| 05/10/2017 | 4.4 |
| 05/10/2017 | 4.3 |
| 05/10/2017 | 4.3 |
| 05/10/2017 | 4.4 |
| 05/10/2017 | 4.6 |
| 05/10/2017 | 4.7 |
| 05/10/2017 | 4.3 |
| 05/10/2017 | 3.8 |
| 05/10/2017 | 3.3 |
| 05/10/2017 | 3 |
| 05/10/2017 | 2.7 |
| 06/10/2017 | 2.5 |
| 06/10/2017 | 2.4 |
| 06/10/2017 | 2.4 |
| 06/10/2017 | 2.5 |
| 06/10/2017 | 2.8 |
| 06/10/2017 | 3.4 |
| 06/10/2017 | 3.9 |
| 06/10/2017 | 4.2 |
| 06/10/2017 | 4.4 |
| 06/10/2017 | 4.5 |
| 06/10/2017 | 4.5 |
| 06/10/2017 | 4.5 |
| 06/10/2017 | 4.4 |
| 06/10/2017 | 4.3 |
| 06/10/2017 | 4.2 |
| 06/10/2017 | 4.2 |
| 06/10/2017 | 4.3 |
| 06/10/2017 | 4.5 |
| 06/10/2017 | 4.6 |
| 06/10/2017 | 4.2 |
| 06/10/2017 | 3.6 |
| 06/10/2017 | 3.2 |
| 06/10/2017 | 2.9 |
| 06/10/2017 | 2.7 |
| 07/10/2017 | 2.5 |
| 07/10/2017 | 2.4 |
| 07/10/2017 | 2.4 |
| 07/10/2017 | 2.4 |
| 07/10/2017 | 2.5 |
| 07/10/2017 | 2.6 |
| 07/10/2017 | 2.8 |
| 07/10/2017 | 3.2 |
| 07/10/2017 | 3.5 |
| 07/10/2017 | 3.7 |
| 07/10/2017 | 3.8 |
| 07/10/2017 | 3.8 |
| 07/10/2017 | 3.6 |
| 07/10/2017 | 3.5 |
| 07/10/2017 | 3.5 |
| 07/10/2017 | 3.5 |
| 07/10/2017 | 3.6 |
| 07/10/2017 | 3.8 |
| 07/10/2017 | 4 |
| 07/10/2017 | 3.7 |
| 07/10/2017 | 3.3 |
| 07/10/2017 | 3 |
| 07/10/2017 | 2.8 |
| 07/10/2017 | 2.6 |
| 08/10/2017 | 2.4 |
| 08/10/2017 | 2.3 |
| 08/10/2017 | 2.3 |
| 08/10/2017 | 2.3 |
| 08/10/2017 | 2.3 |
| 08/10/2017 | 2.4 |
| 08/10/2017 | 2.6 |
| 08/10/2017 | 2.8 |
| 08/10/2017 | 3 |
| 08/10/2017 | 3.2 |
| 08/10/2017 | 3.3 |
| 08/10/2017 | 3.4 |
| 08/10/2017 | 3.3 |
| 08/10/2017 | 3.2 |
| 08/10/2017 | 3.2 |
| 08/10/2017 | 3.2 |
| 08/10/2017 | 3.3 |
| 08/10/2017 | 3.6 |
| 08/10/2017 | 3.8 |
| 08/10/2017 | 3.6 |
| 08/10/2017 | 3.3 |
| 08/10/2017 | 3 |
| 08/10/2017 | 2.8 |
| 08/10/2017 | 2.6 |
| 09/10/2017 | 2.4 |
| 09/10/2017 | 2.3 |
| 09/10/2017 | 2.3 |
| 09/10/2017 | 2.5 |
| 09/10/2017 | 2.7 |
| 09/10/2017 | 3.4 |
| 09/10/2017 | 3.9 |
| 09/10/2017 | 4.2 |
| 09/10/2017 | 4.4 |
| 09/10/2017 | 4.5 |
| 09/10/2017 | 4.5 |
| 09/10/2017 | 4.5 |
| 09/10/2017 | 4.5 |
| 09/10/2017 | 4.4 |
| 09/10/2017 | 4.3 |
| 09/10/2017 | 4.3 |
| 09/10/2017 | 4.4 |
| 09/10/2017 | 4.7 |
| 09/10/2017 | 4.8 |
| 09/10/2017 | 4.3 |
| 09/10/2017 | 3.8 |
| 09/10/2017 | 3.3 |
| 09/10/2017 | 2.9 |
| 09/10/2017 | 2.7 |
| 10/10/2017 | 2.5 |
| 10/10/2017 | 2.4 |
| 10/10/2017 | 2.4 |
| 10/10/2017 | 2.5 |
| 10/10/2017 | 2.8 |
| 10/10/2017 | 3.4 |
| 10/10/2017 | 3.9 |
| 10/10/2017 | 4.3 |
| 10/10/2017 | 4.4 |
| 10/10/2017 | 4.5 |
| 10/10/2017 | 4.5 |
| 10/10/2017 | 4.6 |
| 10/10/2017 | 4.5 |
| 10/10/2017 | 4.4 |
| 10/10/2017 | 4.3 |
| 10/10/2017 | 4.4 |
| 10/10/2017 | 4.5 |
| 10/10/2017 | 4.8 |
| 10/10/2017 | 4.8 |
| 10/10/2017 | 4.4 |
| 10/10/2017 | 3.8 |
| 10/10/2017 | 3.3 |
| 10/10/2017 | 3 |
| 10/10/2017 | 2.7 |
| 11/10/2017 | 2.5 |
| 11/10/2017 | 2.4 |
| 11/10/2017 | 2.4 |
| 11/10/2017 | 2.5 |
| 11/10/2017 | 2.8 |
| 11/10/2017 | 3.4 |
| 11/10/2017 | 4 |
| 11/10/2017 | 4.3 |
| 11/10/2017 | 4.5 |
| 11/10/2017 | 4.6 |
| 11/10/2017 | 4.6 |
| 11/10/2017 | 4.6 |
| 11/10/2017 | 4.5 |
| 11/10/2017 | 4.4 |
| 11/10/2017 | 4.4 |
| 11/10/2017 | 4.4 |
| 11/10/2017 | 4.5 |
| 11/10/2017 | 4.8 |
| 11/10/2017 | 4.8 |
| 11/10/2017 | 4.4 |
| 11/10/2017 | 3.8 |
| 11/10/2017 | 3.3 |
| 11/10/2017 | 3 |
| 11/10/2017 | 2.7 |
| 12/10/2017 | 2.5 |
| 12/10/2017 | 2.4 |
| 12/10/2017 | 2.4 |
| 12/10/2017 | 2.5 |
| 12/10/2017 | 2.8 |
| 12/10/2017 | 3.4 |
| 12/10/2017 | 4 |
| 12/10/2017 | 4.3 |
| 12/10/2017 | 4.4 |
| 12/10/2017 | 4.5 |
| 12/10/2017 | 4.6 |
| 12/10/2017 | 4.6 |
| 12/10/2017 | 4.5 |
| 12/10/2017 | 4.4 |
| 12/10/2017 | 4.3 |
| 12/10/2017 | 4.3 |
| 12/10/2017 | 4.5 |
| 12/10/2017 | 4.7 |
| 12/10/2017 | 4.8 |
| 12/10/2017 | 4.3 |
| 12/10/2017 | 3.8 |
| 12/10/2017 | 3.3 |
| 12/10/2017 | 3 |
| 12/10/2017 | 2.7 |
| 13/10/2017 | 2.5 |
| 13/10/2017 | 2.4 |
| 13/10/2017 | 2.4 |
| 13/10/2017 | 2.5 |
| 13/10/2017 | 2.8 |
| 13/10/2017 | 3.4 |
| 13/10/2017 | 3.9 |
| 13/10/2017 | 4.3 |
| 13/10/2017 | 4.4 |
| 13/10/2017 | 4.6 |
| 13/10/2017 | 4.6 |
| 13/10/2017 | 4.6 |
| 13/10/2017 | 4.4 |
| 13/10/2017 | 4.3 |
| 13/10/2017 | 4.2 |
| 13/10/2017 | 4.2 |
| 13/10/2017 | 4.4 |
| 13/10/2017 | 4.6 |
| 13/10/2017 | 4.6 |
| 13/10/2017 | 4.2 |
| 13/10/2017 | 3.6 |
| 13/10/2017 | 3.2 |
| 13/10/2017 | 2.9 |
| 13/10/2017 | 2.7 |
| 14/10/2017 | 2.5 |
| 14/10/2017 | 2.4 |
| 14/10/2017 | 2.4 |
| 14/10/2017 | 2.4 |
| 14/10/2017 | 2.5 |
| 14/10/2017 | 2.7 |
| 14/10/2017 | 2.9 |
| 14/10/2017 | 3.2 |
| 14/10/2017 | 3.5 |
| 14/10/2017 | 3.7 |
| 14/10/2017 | 3.8 |
| 14/10/2017 | 3.8 |
| 14/10/2017 | 3.7 |
| 14/10/2017 | 3.5 |
| 14/10/2017 | 3.5 |
| 14/10/2017 | 3.5 |
| 14/10/2017 | 3.6 |
| 14/10/2017 | 4 |
| 14/10/2017 | 4.1 |
| 14/10/2017 | 3.7 |
| 14/10/2017 | 3.3 |
| 14/10/2017 | 3 |
| 14/10/2017 | 2.8 |
| 14/10/2017 | 2.6 |
| 15/10/2017 | 2.4 |
| 15/10/2017 | 2.4 |
| 15/10/2017 | 2.3 |
| 15/10/2017 | 2.3 |
| 15/10/2017 | 2.3 |
| 15/10/2017 | 2.4 |
| 15/10/2017 | 2.6 |
| 15/10/2017 | 2.8 |
| 15/10/2017 | 3 |
| 15/10/2017 | 3.2 |
| 15/10/2017 | 3.4 |
| 15/10/2017 | 3.4 |
| 15/10/2017 | 3.3 |
| 15/10/2017 | 3.2 |
| 15/10/2017 | 3.2 |
| 15/10/2017 | 3.2 |
| 15/10/2017 | 3.4 |
| 15/10/2017 | 3.7 |
| 15/10/2017 | 3.8 |
| 15/10/2017 | 3.6 |
| 15/10/2017 | 3.3 |
| 15/10/2017 | 3.1 |
| 15/10/2017 | 2.8 |
| 15/10/2017 | 2.6 |
| 16/10/2017 | 2.4 |
| 16/10/2017 | 2.3 |
| 16/10/2017 | 2.3 |
| 16/10/2017 | 2.4 |
| 16/10/2017 | 2.7 |
| 16/10/2017 | 3.2 |
| 16/10/2017 | 3.7 |
| 16/10/2017 | 4.1 |
| 16/10/2017 | 4.3 |
| 16/10/2017 | 4.4 |
| 16/10/2017 | 4.5 |
| 16/10/2017 | 4.5 |
| 16/10/2017 | 4.4 |
| 16/10/2017 | 4.3 |
| 16/10/2017 | 4.2 |
| 16/10/2017 | 4.2 |
| 16/10/2017 | 4.4 |
| 16/10/2017 | 4.7 |
| 16/10/2017 | 4.7 |
| 16/10/2017 | 4.2 |
| 16/10/2017 | 3.7 |
| 16/10/2017 | 3.3 |
| 16/10/2017 | 2.9 |
| 16/10/2017 | 2.7 |
| 17/10/2017 | 2.5 |
| 17/10/2017 | 2.4 |
| 17/10/2017 | 2.4 |
| 17/10/2017 | 2.5 |
| 17/10/2017 | 2.8 |
| 17/10/2017 | 3.3 |
| 17/10/2017 | 3.8 |
| 17/10/2017 | 4.1 |
| 17/10/2017 | 4.3 |
| 17/10/2017 | 4.5 |
| 17/10/2017 | 4.5 |
| 17/10/2017 | 4.5 |
| 17/10/2017 | 4.4 |
| 17/10/2017 | 4.3 |
| 17/10/2017 | 4.2 |
| 17/10/2017 | 4.3 |
| 17/10/2017 | 4.5 |
| 17/10/2017 | 4.8 |
| 17/10/2017 | 4.8 |
| 17/10/2017 | 4.3 |
| 17/10/2017 | 3.7 |
| 17/10/2017 | 3.3 |
| 17/10/2017 | 3 |
| 17/10/2017 | 2.7 |
| 18/10/2017 | 2.5 |
| 18/10/2017 | 2.4 |
| 18/10/2017 | 2.4 |
| 18/10/2017 | 2.5 |
| 18/10/2017 | 2.8 |
| 18/10/2017 | 3.3 |
| 18/10/2017 | 3.8 |
| 18/10/2017 | 4.2 |
| 18/10/2017 | 4.4 |
| 18/10/2017 | 4.5 |
| 18/10/2017 | 4.5 |
| 18/10/2017 | 4.5 |
| 18/10/2017 | 4.4 |
| 18/10/2017 | 4.3 |
| 18/10/2017 | 4.3 |
| 18/10/2017 | 4.3 |
| 18/10/2017 | 4.5 |
| 18/10/2017 | 4.8 |
| 18/10/2017 | 4.8 |
| 18/10/2017 | 4.3 |
| 18/10/2017 | 3.7 |
| 18/10/2017 | 3.3 |
| 18/10/2017 | 3 |
| 18/10/2017 | 2.7 |
| 19/10/2017 | 2.5 |
| 19/10/2017 | 2.4 |
| 19/10/2017 | 2.4 |
| 19/10/2017 | 2.5 |
| 19/10/2017 | 2.8 |
| 19/10/2017 | 3.3 |
| 19/10/2017 | 3.8 |
| 19/10/2017 | 4.2 |
| 19/10/2017 | 4.4 |
| 19/10/2017 | 4.5 |
| 19/10/2017 | 4.5 |
| 19/10/2017 | 4.5 |
| 19/10/2017 | 4.4 |
| 19/10/2017 | 4.3 |
| 19/10/2017 | 4.2 |
| 19/10/2017 | 4.2 |
| 19/10/2017 | 4.4 |
| 19/10/2017 | 4.8 |
| 19/10/2017 | 4.8 |
| 19/10/2017 | 4.2 |
| 19/10/2017 | 3.7 |
| 19/10/2017 | 3.3 |
| 19/10/2017 | 3 |
| 19/10/2017 | 2.7 |
| 20/10/2017 | 2.5 |
| 20/10/2017 | 2.4 |
| 20/10/2017 | 2.4 |
| 20/10/2017 | 2.5 |
| 20/10/2017 | 2.8 |
| 20/10/2017 | 3.3 |
| 20/10/2017 | 3.8 |
| 20/10/2017 | 4.2 |
| 20/10/2017 | 4.4 |
| 20/10/2017 | 4.5 |
| 20/10/2017 | 4.5 |
| 20/10/2017 | 4.5 |
| 20/10/2017 | 4.4 |
| 20/10/2017 | 4.2 |
| 20/10/2017 | 4.1 |
| 20/10/2017 | 4.1 |
| 20/10/2017 | 4.3 |
| 20/10/2017 | 4.6 |
| 20/10/2017 | 4.6 |
| 20/10/2017 | 4.1 |
| 20/10/2017 | 3.6 |
| 20/10/2017 | 3.2 |
| 20/10/2017 | 2.9 |
| 20/10/2017 | 2.7 |
| 21/10/2017 | 2.5 |
| 21/10/2017 | 2.4 |
| 21/10/2017 | 2.4 |
| 21/10/2017 | 2.4 |
| 21/10/2017 | 2.4 |
| 21/10/2017 | 2.6 |
| 21/10/2017 | 2.8 |
| 21/10/2017 | 3.1 |
| 21/10/2017 | 3.4 |
| 21/10/2017 | 3.7 |
| 21/10/2017 | 3.8 |
| 21/10/2017 | 3.7 |
| 21/10/2017 | 3.6 |
| 21/10/2017 | 3.5 |
| 21/10/2017 | 3.4 |
| 21/10/2017 | 3.4 |
| 21/10/2017 | 3.6 |
| 21/10/2017 | 4 |
| 21/10/2017 | 4 |
| 21/10/2017 | 3.6 |
| 21/10/2017 | 3.3 |
| 21/10/2017 | 3 |
| 21/10/2017 | 2.8 |
| 21/10/2017 | 2.6 |
| 22/10/2017 | 2.4 |
| 22/10/2017 | 2.4 |
| 22/10/2017 | 2.3 |
| 22/10/2017 | 2.3 |
| 22/10/2017 | 2.3 |
| 22/10/2017 | 2.4 |
| 22/10/2017 | 2.5 |
| 22/10/2017 | 2.7 |
| 22/10/2017 | 3 |
| 22/10/2017 | 3.2 |
| 22/10/2017 | 3.3 |
| 22/10/2017 | 3.4 |
| 22/10/2017 | 3.3 |
| 22/10/2017 | 3.2 |
| 22/10/2017 | 3.1 |
| 22/10/2017 | 3.2 |
| 22/10/2017 | 3.4 |
| 22/10/2017 | 3.7 |
| 22/10/2017 | 3.8 |
| 22/10/2017 | 3.5 |
| 22/10/2017 | 3.2 |
| 22/10/2017 | 3.1 |
| 22/10/2017 | 2.8 |
| 22/10/2017 | 2.6 |
| 23/10/2017 | 2.4 |
| 23/10/2017 | 2.4 |
| 23/10/2017 | 2.4 |
| 23/10/2017 | 2.5 |
| 23/10/2017 | 2.7 |
| 23/10/2017 | 3.3 |
| 23/10/2017 | 3.8 |
| 23/10/2017 | 4.1 |
| 23/10/2017 | 4.3 |
| 23/10/2017 | 4.5 |
| 23/10/2017 | 4.5 |
| 23/10/2017 | 4.5 |
| 23/10/2017 | 4.4 |
| 23/10/2017 | 4.3 |
| 23/10/2017 | 4.3 |
| 23/10/2017 | 4.3 |
| 23/10/2017 | 4.5 |
| 23/10/2017 | 4.8 |
| 23/10/2017 | 4.8 |
| 23/10/2017 | 4.3 |
| 23/10/2017 | 3.7 |
| 23/10/2017 | 3.3 |
| 23/10/2017 | 3 |
| 23/10/2017 | 2.7 |
| 24/10/2017 | 2.5 |
| 24/10/2017 | 2.5 |
| 24/10/2017 | 2.4 |
| 24/10/2017 | 2.5 |
| 24/10/2017 | 2.8 |
| 24/10/2017 | 3.3 |
| 24/10/2017 | 3.9 |
| 24/10/2017 | 4.2 |
| 24/10/2017 | 4.4 |
| 24/10/2017 | 4.6 |
| 24/10/2017 | 4.6 |
| 24/10/2017 | 4.6 |
| 24/10/2017 | 4.5 |
| 24/10/2017 | 4.4 |
| 24/10/2017 | 4.3 |
| 24/10/2017 | 4.4 |
| 24/10/2017 | 4.6 |
| 24/10/2017 | 4.9 |
| 24/10/2017 | 4.9 |
| 24/10/2017 | 4.3 |
| 24/10/2017 | 3.8 |
| 24/10/2017 | 3.4 |
| 24/10/2017 | 3 |
| 24/10/2017 | 2.7 |
| 25/10/2017 | 2.6 |
| 25/10/2017 | 2.5 |
| 25/10/2017 | 2.5 |
| 25/10/2017 | 2.6 |
| 25/10/2017 | 2.8 |
| 25/10/2017 | 3.4 |
| 25/10/2017 | 3.9 |
| 25/10/2017 | 4.3 |
| 25/10/2017 | 4.5 |
| 25/10/2017 | 4.6 |
| 25/10/2017 | 4.6 |
| 25/10/2017 | 4.6 |
| 25/10/2017 | 4.5 |
| 25/10/2017 | 4.4 |
| 25/10/2017 | 4.4 |
| 25/10/2017 | 4.4 |
| 25/10/2017 | 4.6 |
| 25/10/2017 | 4.9 |
| 25/10/2017 | 4.9 |
| 25/10/2017 | 4.3 |
| 25/10/2017 | 3.8 |
| 25/10/2017 | 3.4 |
| 25/10/2017 | 3 |
| 25/10/2017 | 2.8 |
| 26/10/2017 | 2.6 |
| 26/10/2017 | 2.5 |
| 26/10/2017 | 2.5 |
| 26/10/2017 | 2.6 |
| 26/10/2017 | 2.8 |
| 26/10/2017 | 3.4 |
| 26/10/2017 | 3.9 |
| 26/10/2017 | 4.2 |
| 26/10/2017 | 4.4 |
| 26/10/2017 | 4.6 |
| 26/10/2017 | 4.6 |
| 26/10/2017 | 4.6 |
| 26/10/2017 | 4.5 |
| 26/10/2017 | 4.4 |
| 26/10/2017 | 4.4 |
| 26/10/2017 | 4.4 |
| 26/10/2017 | 4.5 |
| 26/10/2017 | 4.8 |
| 26/10/2017 | 4.8 |
| 26/10/2017 | 4.3 |
| 26/10/2017 | 3.8 |
| 26/10/2017 | 3.4 |
| 26/10/2017 | 3 |
| 26/10/2017 | 2.8 |
| 27/10/2017 | 2.6 |
| 27/10/2017 | 2.5 |
| 27/10/2017 | 2.5 |
| 27/10/2017 | 2.6 |
| 27/10/2017 | 2.8 |
| 27/10/2017 | 3.3 |
| 27/10/2017 | 3.9 |
| 27/10/2017 | 4.2 |
| 27/10/2017 | 4.5 |
| 27/10/2017 | 4.6 |
| 27/10/2017 | 4.6 |
| 27/10/2017 | 4.6 |
| 27/10/2017 | 4.5 |
| 27/10/2017 | 4.3 |
| 27/10/2017 | 4.3 |
| 27/10/2017 | 4.3 |
| 27/10/2017 | 4.4 |
| 27/10/2017 | 4.7 |
| 27/10/2017 | 4.7 |
| 27/10/2017 | 4.2 |
| 27/10/2017 | 3.6 |
| 27/10/2017 | 3.3 |
| 27/10/2017 | 3 |
| 27/10/2017 | 2.7 |
| 28/10/2017 | 2.6 |
| 28/10/2017 | 2.5 |
| 28/10/2017 | 2.4 |
| 28/10/2017 | 2.4 |
| 28/10/2017 | 2.5 |
| 28/10/2017 | 2.7 |
| 28/10/2017 | 3 |
| 28/10/2017 | 3.3 |
| 28/10/2017 | 3.6 |
| 28/10/2017 | 3.9 |
| 28/10/2017 | 3.9 |
| 28/10/2017 | 3.9 |
| 28/10/2017 | 3.8 |
| 28/10/2017 | 3.7 |
| 28/10/2017 | 3.6 |
| 28/10/2017 | 3.7 |
| 28/10/2017 | 3.8 |
| 28/10/2017 | 4.1 |
| 28/10/2017 | 4.2 |
| 28/10/2017 | 3.8 |
| 28/10/2017 | 3.4 |
| 28/10/2017 | 3.1 |
| 28/10/2017 | 2.9 |
| 28/10/2017 | 2.6 |
| 29/10/2017 | 2.5 |
| 29/10/2017 | 2.4 |
| 29/10/2017 | 2.4 |
| 29/10/2017 | 2.3 |
| 29/10/2017 | 2.4 |
| 29/10/2017 | 2.4 |
| 29/10/2017 | 2.5 |
| 29/10/2017 | 2.6 |
| 29/10/2017 | 2.8 |
| 29/10/2017 | 3.1 |
| 29/10/2017 | 3.2 |
| 29/10/2017 | 3.4 |
| 29/10/2017 | 3.4 |
| 29/10/2017 | 3.4 |
| 29/10/2017 | 3.3 |
| 29/10/2017 | 3.3 |
| 29/10/2017 | 3.5 |
| 29/10/2017 | 3.8 |
| 29/10/2017 | 4 |
| 29/10/2017 | 3.9 |
| 29/10/2017 | 3.6 |
| 29/10/2017 | 3.3 |
| 29/10/2017 | 3.1 |
| 29/10/2017 | 2.8 |
| 30/10/2017 | 2.6 |
| 30/10/2017 | 2.5 |
| 30/10/2017 | 2.4 |
| 30/10/2017 | 2.4 |
| 30/10/2017 | 2.5 |
| 30/10/2017 | 2.8 |
| 30/10/2017 | 3.4 |
| 30/10/2017 | 4 |
| 30/10/2017 | 4.3 |
| 30/10/2017 | 4.5 |
| 30/10/2017 | 4.6 |
| 30/10/2017 | 4.6 |
| 30/10/2017 | 4.6 |
| 30/10/2017 | 4.5 |
| 30/10/2017 | 4.5 |
| 30/10/2017 | 4.5 |
| 30/10/2017 | 4.7 |
| 30/10/2017 | 5.1 |
| 30/10/2017 | 5.2 |
| 30/10/2017 | 5 |
| 30/10/2017 | 4.3 |
| 30/10/2017 | 3.8 |
| 30/10/2017 | 3.4 |
| 30/10/2017 | 3 |
| 30/10/2017 | 2.7 |
| 31/10/2017 | 2.6 |
| 31/10/2017 | 2.5 |
| 31/10/2017 | 2.5 |
| 31/10/2017 | 2.6 |
| 31/10/2017 | 2.9 |
| 31/10/2017 | 3.5 |
| 31/10/2017 | 4.1 |
| 31/10/2017 | 4.4 |
| 31/10/2017 | 4.5 |
| 31/10/2017 | 4.6 |
| 31/10/2017 | 4.6 |
| 31/10/2017 | 4.6 |
| 31/10/2017 | 4.6 |
| 31/10/2017 | 4.5 |
| 31/10/2017 | 4.5 |
| 31/10/2017 | 4.8 |
| 31/10/2017 | 5.2 |
| 31/10/2017 | 5.3 |
| 31/10/2017 | 5 |
| 31/10/2017 | 4.4 |
| 31/10/2017 | 3.9 |
| 31/10/2017 | 3.4 |
| 31/10/2017 | 3 |
| 31/10/2017 | 2.8 |
| 01/11/2017 | 2.6 |
| 01/11/2017 | 2.5 |
| 01/11/2017 | 2.5 |
| 01/11/2017 | 2.6 |
| 01/11/2017 | 2.9 |
| 01/11/2017 | 3.5 |
| 01/11/2017 | 4.1 |
| 01/11/2017 | 4.4 |
| 01/11/2017 | 4.6 |
| 01/11/2017 | 4.7 |
| 01/11/2017 | 4.7 |
| 01/11/2017 | 4.7 |
| 01/11/2017 | 4.7 |
| 01/11/2017 | 4.6 |
| 01/11/2017 | 4.6 |
| 01/11/2017 | 4.8 |
| 01/11/2017 | 5.2 |
| 01/11/2017 | 5.3 |
| 01/11/2017 | 5 |
| 01/11/2017 | 4.4 |
| 01/11/2017 | 3.9 |
| 01/11/2017 | 3.4 |
| 01/11/2017 | 3 |
| 01/11/2017 | 2.8 |
| 02/11/2017 | 2.6 |
| 02/11/2017 | 2.5 |
| 02/11/2017 | 2.5 |
| 02/11/2017 | 2.6 |
| 02/11/2017 | 2.9 |
| 02/11/2017 | 3.5 |
| 02/11/2017 | 4.1 |
| 02/11/2017 | 4.4 |
| 02/11/2017 | 4.6 |
| 02/11/2017 | 4.7 |
| 02/11/2017 | 4.7 |
| 02/11/2017 | 4.7 |
| 02/11/2017 | 4.6 |
| 02/11/2017 | 4.6 |
| 02/11/2017 | 4.6 |
| 02/11/2017 | 4.8 |
| 02/11/2017 | 5.1 |
| 02/11/2017 | 5.2 |
| 02/11/2017 | 5 |
| 02/11/2017 | 4.4 |
| 02/11/2017 | 3.9 |
| 02/11/2017 | 3.4 |
| 02/11/2017 | 3 |
| 02/11/2017 | 2.8 |
| 03/11/2017 | 2.6 |
| 03/11/2017 | 2.5 |
| 03/11/2017 | 2.5 |
| 03/11/2017 | 2.6 |
| 03/11/2017 | 2.9 |
| 03/11/2017 | 3.5 |
| 03/11/2017 | 4.1 |
| 03/11/2017 | 4.4 |
| 03/11/2017 | 4.6 |
| 03/11/2017 | 4.7 |
| 03/11/2017 | 4.7 |
| 03/11/2017 | 4.7 |
| 03/11/2017 | 4.6 |
| 03/11/2017 | 4.5 |
| 03/11/2017 | 4.5 |
| 03/11/2017 | 4.7 |
| 03/11/2017 | 5 |
| 03/11/2017 | 5.1 |
| 03/11/2017 | 4.8 |
| 03/11/2017 | 4.2 |
| 03/11/2017 | 3.7 |
| 03/11/2017 | 3.3 |
| 03/11/2017 | 3 |
| 03/11/2017 | 2.8 |
| 04/11/2017 | 2.6 |
| 04/11/2017 | 2.5 |
| 04/11/2017 | 2.5 |
| 04/11/2017 | 2.5 |
| 04/11/2017 | 2.5 |
| 04/11/2017 | 2.7 |
| 04/11/2017 | 3 |
| 04/11/2017 | 3.3 |
| 04/11/2017 | 3.6 |
| 04/11/2017 | 3.8 |
| 04/11/2017 | 3.9 |
| 04/11/2017 | 3.9 |
| 04/11/2017 | 3.8 |
| 04/11/2017 | 3.7 |
| 04/11/2017 | 3.7 |
| 04/11/2017 | 3.9 |
| 04/11/2017 | 4.2 |
| 04/11/2017 | 4.4 |
| 04/11/2017 | 4.2 |
| 04/11/2017 | 3.8 |
| 04/11/2017 | 3.4 |
| 04/11/2017 | 3.1 |
| 04/11/2017 | 2.9 |
| 04/11/2017 | 2.7 |
| 05/11/2017 | 2.5 |
| 05/11/2017 | 2.4 |
| 05/11/2017 | 2.4 |
| 05/11/2017 | 2.4 |
| 05/11/2017 | 2.4 |
| 05/11/2017 | 2.5 |
| 05/11/2017 | 2.7 |
| 05/11/2017 | 2.9 |
| 05/11/2017 | 3.2 |
| 05/11/2017 | 3.3 |
| 05/11/2017 | 3.5 |
| 05/11/2017 | 3.5 |
| 05/11/2017 | 3.5 |
| 05/11/2017 | 3.4 |
| 05/11/2017 | 3.4 |
| 05/11/2017 | 3.6 |
| 05/11/2017 | 4 |
| 05/11/2017 | 4.1 |
| 05/11/2017 | 4 |
| 05/11/2017 | 3.7 |
| 05/11/2017 | 3.4 |
| 05/11/2017 | 3.2 |
| 05/11/2017 | 2.9 |
| 05/11/2017 | 2.7 |
| 06/11/2017 | 2.5 |
| 06/11/2017 | 2.4 |
| 06/11/2017 | 2.4 |
| 06/11/2017 | 2.5 |
| 06/11/2017 | 2.8 |
| 06/11/2017 | 3.5 |
| 06/11/2017 | 4.1 |
| 06/11/2017 | 4.4 |
| 06/11/2017 | 4.6 |
| 06/11/2017 | 4.7 |
| 06/11/2017 | 4.7 |
| 06/11/2017 | 4.7 |
| 06/11/2017 | 4.7 |
| 06/11/2017 | 4.6 |
| 06/11/2017 | 4.7 |
| 06/11/2017 | 4.9 |
| 06/11/2017 | 5.2 |
| 06/11/2017 | 5.3 |
| 06/11/2017 | 5.1 |
| 06/11/2017 | 4.4 |
| 06/11/2017 | 3.9 |
| 06/11/2017 | 3.5 |
| 06/11/2017 | 3.1 |
| 06/11/2017 | 2.8 |
| 07/11/2017 | 2.6 |
| 07/11/2017 | 2.5 |
| 07/11/2017 | 2.5 |
| 07/11/2017 | 2.6 |
| 07/11/2017 | 2.9 |
| 07/11/2017 | 3.5 |
| 07/11/2017 | 4.1 |
| 07/11/2017 | 4.5 |
| 07/11/2017 | 4.6 |
| 07/11/2017 | 4.7 |
| 07/11/2017 | 4.8 |
| 07/11/2017 | 4.8 |
| 07/11/2017 | 4.7 |
| 07/11/2017 | 4.7 |
| 07/11/2017 | 4.7 |
| 07/11/2017 | 5 |
| 07/11/2017 | 5.3 |
| 07/11/2017 | 5.3 |
| 07/11/2017 | 5.1 |
| 07/11/2017 | 4.5 |
| 07/11/2017 | 3.9 |
| 07/11/2017 | 3.5 |
| 07/11/2017 | 3.1 |
| 07/11/2017 | 2.8 |
| 08/11/2017 | 2.6 |
| 08/11/2017 | 2.5 |
| 08/11/2017 | 2.5 |
| 08/11/2017 | 2.6 |
| 08/11/2017 | 2.9 |
| 08/11/2017 | 3.6 |
| 08/11/2017 | 4.2 |
| 08/11/2017 | 4.5 |
| 08/11/2017 | 4.7 |
| 08/11/2017 | 4.8 |
| 08/11/2017 | 4.8 |
| 08/11/2017 | 4.8 |
| 08/11/2017 | 4.8 |
| 08/11/2017 | 4.7 |
| 08/11/2017 | 4.8 |
| 08/11/2017 | 5 |
| 08/11/2017 | 5.3 |
| 08/11/2017 | 5.4 |
| 08/11/2017 | 5.1 |
| 08/11/2017 | 4.5 |
| 08/11/2017 | 4 |
| 08/11/2017 | 3.5 |
| 08/11/2017 | 3.1 |
| 08/11/2017 | 2.8 |
| 09/11/2017 | 2.6 |
| 09/11/2017 | 2.5 |
| 09/11/2017 | 2.5 |
| 09/11/2017 | 2.6 |
| 09/11/2017 | 2.9 |
| 09/11/2017 | 3.6 |
| 09/11/2017 | 4.2 |
| 09/11/2017 | 4.5 |
| 09/11/2017 | 4.7 |
| 09/11/2017 | 4.8 |
| 09/11/2017 | 4.8 |
| 09/11/2017 | 4.8 |
| 09/11/2017 | 4.8 |
| 09/11/2017 | 4.7 |
| 09/11/2017 | 4.7 |
| 09/11/2017 | 5 |
| 09/11/2017 | 5.3 |
| 09/11/2017 | 5.3 |
| 09/11/2017 | 5.1 |
| 09/11/2017 | 4.5 |
| 09/11/2017 | 4 |
| 09/11/2017 | 3.5 |
| 09/11/2017 | 3.1 |
| 09/11/2017 | 2.8 |
| 10/11/2017 | 2.6 |
| 10/11/2017 | 2.5 |
| 10/11/2017 | 2.5 |
| 10/11/2017 | 2.6 |
| 10/11/2017 | 2.9 |
| 10/11/2017 | 3.5 |
| 10/11/2017 | 4.1 |
| 10/11/2017 | 4.5 |
| 10/11/2017 | 4.7 |
| 10/11/2017 | 4.8 |
| 10/11/2017 | 4.8 |
| 10/11/2017 | 4.8 |
| 10/11/2017 | 4.7 |
| 10/11/2017 | 4.6 |
| 10/11/2017 | 4.7 |
| 10/11/2017 | 4.9 |
| 10/11/2017 | 5.2 |
| 10/11/2017 | 5.2 |
| 10/11/2017 | 4.9 |
| 10/11/2017 | 4.3 |
| 10/11/2017 | 3.8 |
| 10/11/2017 | 3.4 |
| 10/11/2017 | 3.1 |
| 10/11/2017 | 2.8 |
| 11/11/2017 | 2.6 |
| 11/11/2017 | 2.5 |
| 11/11/2017 | 2.5 |
| 11/11/2017 | 2.5 |
| 11/11/2017 | 2.6 |
| 11/11/2017 | 2.8 |
| 11/11/2017 | 3 |
| 11/11/2017 | 3.4 |
| 11/11/2017 | 3.7 |
| 11/11/2017 | 3.9 |
| 11/11/2017 | 4 |
| 11/11/2017 | 4 |
| 11/11/2017 | 3.9 |
| 11/11/2017 | 3.8 |
| 11/11/2017 | 3.9 |
| 11/11/2017 | 4.1 |
| 11/11/2017 | 4.4 |
| 11/11/2017 | 4.4 |
| 11/11/2017 | 4.3 |
| 11/11/2017 | 3.9 |
| 11/11/2017 | 3.5 |
| 11/11/2017 | 3.2 |
| 11/11/2017 | 2.9 |
| 11/11/2017 | 2.7 |
| 12/11/2017 | 2.6 |
| 12/11/2017 | 2.5 |
| 12/11/2017 | 2.4 |
| 12/11/2017 | 2.4 |
| 12/11/2017 | 2.4 |
| 12/11/2017 | 2.5 |
| 12/11/2017 | 2.7 |
| 12/11/2017 | 3 |
| 12/11/2017 | 3.2 |
| 12/11/2017 | 3.4 |
| 12/11/2017 | 3.6 |
| 12/11/2017 | 3.6 |
| 12/11/2017 | 3.6 |
| 12/11/2017 | 3.5 |
| 12/11/2017 | 3.5 |
| 12/11/2017 | 3.8 |
| 12/11/2017 | 4.1 |
| 12/11/2017 | 4.2 |
| 12/11/2017 | 4.1 |
| 12/11/2017 | 3.8 |
| 12/11/2017 | 3.5 |
| 12/11/2017 | 3.3 |
| 12/11/2017 | 3 |
| 12/11/2017 | 2.7 |
| 13/11/2017 | 2.6 |
| 13/11/2017 | 2.5 |
| 13/11/2017 | 2.5 |
| 13/11/2017 | 2.6 |
| 13/11/2017 | 2.9 |
| 13/11/2017 | 3.5 |
| 13/11/2017 | 4.1 |
| 13/11/2017 | 4.5 |
| 13/11/2017 | 4.7 |
| 13/11/2017 | 4.8 |
| 13/11/2017 | 4.8 |
| 13/11/2017 | 4.8 |
| 13/11/2017 | 4.8 |
| 13/11/2017 | 4.8 |
| 13/11/2017 | 4.8 |
| 13/11/2017 | 5.1 |
| 13/11/2017 | 5.4 |
| 13/11/2017 | 5.4 |
| 13/11/2017 | 5.1 |
| 13/11/2017 | 4.5 |
| 13/11/2017 | 4 |
| 13/11/2017 | 3.5 |
| 13/11/2017 | 3.1 |
| 13/11/2017 | 2.9 |
| 14/11/2017 | 2.7 |
| 14/11/2017 | 2.6 |
| 14/11/2017 | 2.5 |
| 14/11/2017 | 2.7 |
| 14/11/2017 | 2.9 |
| 14/11/2017 | 3.6 |
| 14/11/2017 | 4.2 |
| 14/11/2017 | 4.6 |
| 14/11/2017 | 4.7 |
| 14/11/2017 | 4.8 |
| 14/11/2017 | 4.9 |
| 14/11/2017 | 4.9 |
| 14/11/2017 | 4.8 |
| 14/11/2017 | 4.8 |
| 14/11/2017 | 4.9 |
| 14/11/2017 | 5.2 |
| 14/11/2017 | 5.5 |
| 14/11/2017 | 5.4 |
| 14/11/2017 | 5.2 |
| 14/11/2017 | 4.6 |
| 14/11/2017 | 4 |
| 14/11/2017 | 3.6 |
| 14/11/2017 | 3.2 |
| 14/11/2017 | 2.9 |
| 15/11/2017 | 2.7 |
| 15/11/2017 | 2.6 |
| 15/11/2017 | 2.6 |
| 15/11/2017 | 2.7 |
| 15/11/2017 | 3 |
| 15/11/2017 | 3.6 |
| 15/11/2017 | 4.3 |
| 15/11/2017 | 4.6 |
| 15/11/2017 | 4.8 |
| 15/11/2017 | 4.9 |
| 15/11/2017 | 5 |
| 15/11/2017 | 5 |
| 15/11/2017 | 4.9 |
| 15/11/2017 | 4.9 |
| 15/11/2017 | 4.9 |
| 15/11/2017 | 5.2 |
| 15/11/2017 | 5.5 |
| 15/11/2017 | 5.4 |
| 15/11/2017 | 5.2 |
| 15/11/2017 | 4.6 |
| 15/11/2017 | 4 |
| 15/11/2017 | 3.6 |
| 15/11/2017 | 3.2 |
| 15/11/2017 | 2.9 |
| 16/11/2017 | 2.7 |
| 16/11/2017 | 2.6 |
| 16/11/2017 | 2.6 |
| 16/11/2017 | 2.7 |
| 16/11/2017 | 3 |
| 16/11/2017 | 3.6 |
| 16/11/2017 | 4.3 |
| 16/11/2017 | 4.6 |
| 16/11/2017 | 4.8 |
| 16/11/2017 | 4.9 |
| 16/11/2017 | 4.9 |
| 16/11/2017 | 4.9 |
| 16/11/2017 | 4.9 |
| 16/11/2017 | 4.8 |
| 16/11/2017 | 4.9 |
| 16/11/2017 | 5.2 |
| 16/11/2017 | 5.5 |
| 16/11/2017 | 5.4 |
| 16/11/2017 | 5.2 |
| 16/11/2017 | 4.6 |
| 16/11/2017 | 4 |
| 16/11/2017 | 3.6 |
| 16/11/2017 | 3.2 |
| 16/11/2017 | 2.9 |
| 17/11/2017 | 2.7 |
| 17/11/2017 | 2.6 |
| 17/11/2017 | 2.6 |
| 17/11/2017 | 2.7 |
| 17/11/2017 | 3 |
| 17/11/2017 | 3.6 |
| 17/11/2017 | 4.2 |
| 17/11/2017 | 4.6 |
| 17/11/2017 | 4.8 |
| 17/11/2017 | 4.9 |
| 17/11/2017 | 5 |
| 17/11/2017 | 4.9 |
| 17/11/2017 | 4.8 |
| 17/11/2017 | 4.8 |
| 17/11/2017 | 4.8 |
| 17/11/2017 | 5.1 |
| 17/11/2017 | 5.3 |
| 17/11/2017 | 5.3 |
| 17/11/2017 | 5 |
| 17/11/2017 | 4.4 |
| 17/11/2017 | 3.9 |
| 17/11/2017 | 3.5 |
| 17/11/2017 | 3.2 |
| 17/11/2017 | 2.9 |
| 18/11/2017 | 2.7 |
| 18/11/2017 | 2.6 |
| 18/11/2017 | 2.5 |
| 18/11/2017 | 2.5 |
| 18/11/2017 | 2.6 |
| 18/11/2017 | 2.8 |
| 18/11/2017 | 3.1 |
| 18/11/2017 | 3.5 |
| 18/11/2017 | 3.8 |
| 18/11/2017 | 4 |
| 18/11/2017 | 4.1 |
| 18/11/2017 | 4.1 |
| 18/11/2017 | 4 |
| 18/11/2017 | 3.9 |
| 18/11/2017 | 4 |
| 18/11/2017 | 4.3 |
| 18/11/2017 | 4.5 |
| 18/11/2017 | 4.5 |
| 18/11/2017 | 4.4 |
| 18/11/2017 | 4 |
| 18/11/2017 | 3.6 |
| 18/11/2017 | 3.3 |
| 18/11/2017 | 3 |
| 18/11/2017 | 2.8 |
| 19/11/2017 | 2.6 |
| 19/11/2017 | 2.5 |
| 19/11/2017 | 2.5 |
| 19/11/2017 | 2.4 |
| 19/11/2017 | 2.5 |
| 19/11/2017 | 2.6 |
| 19/11/2017 | 2.8 |
| 19/11/2017 | 3 |
| 19/11/2017 | 3.3 |
| 19/11/2017 | 3.5 |
| 19/11/2017 | 3.7 |
| 19/11/2017 | 3.7 |
| 19/11/2017 | 3.7 |
| 19/11/2017 | 3.6 |
| 19/11/2017 | 3.7 |
| 19/11/2017 | 4 |
| 19/11/2017 | 4.2 |
| 19/11/2017 | 4.3 |
| 19/11/2017 | 4.1 |
| 19/11/2017 | 3.8 |
| 19/11/2017 | 3.5 |
| 19/11/2017 | 3.3 |
| 19/11/2017 | 3 |
| 19/11/2017 | 2.8 |
| 20/11/2017 | 2.6 |
| 20/11/2017 | 2.5 |
| 20/11/2017 | 2.5 |
| 20/11/2017 | 2.6 |
| 20/11/2017 | 2.9 |
| 20/11/2017 | 3.6 |
| 20/11/2017 | 4.2 |
| 20/11/2017 | 4.6 |
| 20/11/2017 | 4.8 |
| 20/11/2017 | 4.9 |
| 20/11/2017 | 5 |
| 20/11/2017 | 5 |
| 20/11/2017 | 4.9 |
| 20/11/2017 | 4.9 |
| 20/11/2017 | 5 |
| 20/11/2017 | 5.3 |
| 20/11/2017 | 5.5 |
| 20/11/2017 | 5.5 |
| 20/11/2017 | 5.2 |
| 20/11/2017 | 4.6 |
| 20/11/2017 | 4.1 |
| 20/11/2017 | 3.6 |
| 20/11/2017 | 3.2 |
| 20/11/2017 | 2.9 |
| 21/11/2017 | 2.7 |
| 21/11/2017 | 2.6 |
| 21/11/2017 | 2.6 |
| 21/11/2017 | 2.7 |
| 21/11/2017 | 3 |
| 21/11/2017 | 3.6 |
| 21/11/2017 | 4.3 |
| 21/11/2017 | 4.7 |
| 21/11/2017 | 4.8 |
| 21/11/2017 | 5 |
| 21/11/2017 | 5 |
| 21/11/2017 | 5 |
| 21/11/2017 | 5 |
| 21/11/2017 | 4.9 |
| 21/11/2017 | 5 |
| 21/11/2017 | 5.4 |
| 21/11/2017 | 5.6 |
| 21/11/2017 | 5.5 |
| 21/11/2017 | 5.3 |
| 21/11/2017 | 4.7 |
| 21/11/2017 | 4.1 |
| 21/11/2017 | 3.7 |
| 21/11/2017 | 3.3 |
| 21/11/2017 | 3 |
| 22/11/2017 | 2.7 |
| 22/11/2017 | 2.6 |
| 22/11/2017 | 2.6 |
| 22/11/2017 | 2.7 |
| 22/11/2017 | 3 |
| 22/11/2017 | 3.7 |
| 22/11/2017 | 4.3 |
| 22/11/2017 | 4.7 |
| 22/11/2017 | 4.9 |
| 22/11/2017 | 5 |
| 22/11/2017 | 5.1 |
| 22/11/2017 | 5.1 |
| 22/11/2017 | 5 |
| 22/11/2017 | 5 |
| 22/11/2017 | 5.1 |
| 22/11/2017 | 5.4 |
| 22/11/2017 | 5.6 |
| 22/11/2017 | 5.5 |
| 22/11/2017 | 5.3 |
| 22/11/2017 | 4.7 |
| 22/11/2017 | 4.1 |
| 22/11/2017 | 3.7 |
| 22/11/2017 | 3.3 |
| 22/11/2017 | 3 |
| 23/11/2017 | 2.7 |
| 23/11/2017 | 2.6 |
| 23/11/2017 | 2.6 |
| 23/11/2017 | 2.7 |
| 23/11/2017 | 3 |
| 23/11/2017 | 3.7 |
| 23/11/2017 | 4.3 |
| 23/11/2017 | 4.7 |
| 23/11/2017 | 4.9 |
| 23/11/2017 | 5 |
| 23/11/2017 | 5.1 |
| 23/11/2017 | 5.1 |
| 23/11/2017 | 5 |
| 23/11/2017 | 5 |
| 23/11/2017 | 5.1 |
| 23/11/2017 | 5.4 |
| 23/11/2017 | 5.6 |
| 23/11/2017 | 5.5 |
| 23/11/2017 | 5.2 |
| 23/11/2017 | 4.7 |
| 23/11/2017 | 4.1 |
| 23/11/2017 | 3.7 |
| 23/11/2017 | 3.3 |
| 23/11/2017 | 3 |
| 24/11/2017 | 2.7 |
| 24/11/2017 | 2.6 |
| 24/11/2017 | 2.6 |
| 24/11/2017 | 2.7 |
| 24/11/2017 | 3 |
| 24/11/2017 | 3.6 |
| 24/11/2017 | 4.3 |
| 24/11/2017 | 4.7 |
| 24/11/2017 | 4.9 |
| 24/11/2017 | 5 |
| 24/11/2017 | 5.1 |
| 24/11/2017 | 5.1 |
| 24/11/2017 | 5 |
| 24/11/2017 | 4.9 |
| 24/11/2017 | 5 |
| 24/11/2017 | 5.3 |
| 24/11/2017 | 5.5 |
| 24/11/2017 | 5.4 |
| 24/11/2017 | 5.1 |
| 24/11/2017 | 4.5 |
| 24/11/2017 | 4 |
| 24/11/2017 | 3.6 |
| 24/11/2017 | 3.3 |
| 24/11/2017 | 2.9 |
| 25/11/2017 | 2.7 |
| 25/11/2017 | 2.6 |
| 25/11/2017 | 2.6 |
| 25/11/2017 | 2.6 |
| 25/11/2017 | 2.6 |
| 25/11/2017 | 2.8 |
| 25/11/2017 | 3.2 |
| 25/11/2017 | 3.5 |
| 25/11/2017 | 3.9 |
| 25/11/2017 | 4.1 |
| 25/11/2017 | 4.2 |
| 25/11/2017 | 4.2 |
| 25/11/2017 | 4.1 |
| 25/11/2017 | 4.1 |
| 25/11/2017 | 4.1 |
| 25/11/2017 | 4.5 |
| 25/11/2017 | 4.7 |
| 25/11/2017 | 4.6 |
| 25/11/2017 | 4.4 |
| 25/11/2017 | 4.1 |
| 25/11/2017 | 3.7 |
| 25/11/2017 | 3.4 |
| 25/11/2017 | 3.1 |
| 25/11/2017 | 2.8 |
| 26/11/2017 | 2.6 |
| 26/11/2017 | 2.5 |
| 26/11/2017 | 2.5 |
| 26/11/2017 | 2.5 |
| 26/11/2017 | 2.5 |
| 26/11/2017 | 2.6 |
| 26/11/2017 | 2.8 |
| 26/11/2017 | 3.1 |
| 26/11/2017 | 3.4 |
| 26/11/2017 | 3.6 |
| 26/11/2017 | 3.8 |
| 26/11/2017 | 3.8 |
| 26/11/2017 | 3.8 |
| 26/11/2017 | 3.7 |
| 26/11/2017 | 3.8 |
| 26/11/2017 | 4.1 |
| 26/11/2017 | 4.3 |
| 26/11/2017 | 4.4 |
| 26/11/2017 | 4.2 |
| 26/11/2017 | 3.9 |
| 26/11/2017 | 3.6 |
| 26/11/2017 | 3.4 |
| 26/11/2017 | 3.1 |
| 26/11/2017 | 2.8 |
| 27/11/2017 | 2.6 |
| 27/11/2017 | 2.5 |
| 27/11/2017 | 2.5 |
| 27/11/2017 | 2.6 |
| 27/11/2017 | 2.9 |
| 27/11/2017 | 3.6 |
| 27/11/2017 | 4.3 |
| 27/11/2017 | 4.6 |
| 27/11/2017 | 4.8 |
| 27/11/2017 | 5 |
| 27/11/2017 | 5.1 |
| 27/11/2017 | 5.1 |
| 27/11/2017 | 5 |
| 27/11/2017 | 5 |
| 27/11/2017 | 5.1 |
| 27/11/2017 | 5.5 |
| 27/11/2017 | 5.6 |
| 27/11/2017 | 5.5 |
| 27/11/2017 | 5.3 |
| 27/11/2017 | 4.7 |
| 27/11/2017 | 4.2 |
| 27/11/2017 | 3.7 |
| 27/11/2017 | 3.3 |
| 27/11/2017 | 3 |
| 28/11/2017 | 2.7 |
| 28/11/2017 | 2.6 |
| 28/11/2017 | 2.6 |
| 28/11/2017 | 2.7 |
| 28/11/2017 | 3 |
| 28/11/2017 | 3.7 |
| 28/11/2017 | 4.3 |
| 28/11/2017 | 4.7 |
| 28/11/2017 | 4.9 |
| 28/11/2017 | 5 |
| 28/11/2017 | 5.1 |
| 28/11/2017 | 5.1 |
| 28/11/2017 | 5 |
| 28/11/2017 | 5 |
| 28/11/2017 | 5.1 |
| 28/11/2017 | 5.5 |
| 28/11/2017 | 5.7 |
| 28/11/2017 | 5.6 |
| 28/11/2017 | 5.3 |
| 28/11/2017 | 4.8 |
| 28/11/2017 | 4.2 |
| 28/11/2017 | 3.7 |
| 28/11/2017 | 3.3 |
| 28/11/2017 | 3 |
| 29/11/2017 | 2.8 |
| 29/11/2017 | 2.7 |
| 29/11/2017 | 2.6 |
| 29/11/2017 | 2.7 |
| 29/11/2017 | 3 |
| 29/11/2017 | 3.7 |
| 29/11/2017 | 4.4 |
| 29/11/2017 | 4.7 |
| 29/11/2017 | 4.9 |
| 29/11/2017 | 5.1 |
| 29/11/2017 | 5.1 |
| 29/11/2017 | 5.1 |
| 29/11/2017 | 5.1 |
| 29/11/2017 | 5.1 |
| 29/11/2017 | 5.2 |
| 29/11/2017 | 5.5 |
| 29/11/2017 | 5.7 |
| 29/11/2017 | 5.6 |
| 29/11/2017 | 5.3 |
| 29/11/2017 | 4.8 |
| 29/11/2017 | 4.2 |
| 29/11/2017 | 3.7 |
| 29/11/2017 | 3.3 |
| 29/11/2017 | 3 |
| 30/11/2017 | 2.8 |
| 30/11/2017 | 2.7 |
| 30/11/2017 | 2.6 |
| 30/11/2017 | 2.7 |
| 30/11/2017 | 3 |
| 30/11/2017 | 3.7 |
| 30/11/2017 | 4.3 |
| 30/11/2017 | 4.7 |
| 30/11/2017 | 4.9 |
| 30/11/2017 | 5 |
| 30/11/2017 | 5.1 |
| 30/11/2017 | 5.1 |
| 30/11/2017 | 5 |
| 30/11/2017 | 5 |
| 30/11/2017 | 5.1 |
| 30/11/2017 | 5.5 |
| 30/11/2017 | 5.6 |
| 30/11/2017 | 5.5 |
| 30/11/2017 | 5.3 |
| 30/11/2017 | 4.7 |
| 30/11/2017 | 4.2 |
| 30/11/2017 | 3.7 |
| 30/11/2017 | 3.3 |
| 30/11/2017 | 3 |
| 01/12/2017 | 2.8 |
| 01/12/2017 | 2.7 |
| 01/12/2017 | 2.6 |
| 01/12/2017 | 2.7 |
| 01/12/2017 | 3 |
| 01/12/2017 | 3.6 |
| 01/12/2017 | 4.3 |
| 01/12/2017 | 4.7 |
| 01/12/2017 | 4.9 |
| 01/12/2017 | 5 |
| 01/12/2017 | 5.1 |
| 01/12/2017 | 5.1 |
| 01/12/2017 | 5 |
| 01/12/2017 | 4.9 |
| 01/12/2017 | 5 |
| 01/12/2017 | 5.4 |
| 01/12/2017 | 5.5 |
| 01/12/2017 | 5.4 |
| 01/12/2017 | 5.1 |
| 01/12/2017 | 4.5 |
| 01/12/2017 | 4 |
| 01/12/2017 | 3.6 |
| 01/12/2017 | 3.3 |
| 01/12/2017 | 2.9 |
| 02/12/2017 | 2.7 |
| 02/12/2017 | 2.6 |
| 02/12/2017 | 2.6 |
| 02/12/2017 | 2.6 |
| 02/12/2017 | 2.6 |
| 02/12/2017 | 2.8 |
| 02/12/2017 | 3.1 |
| 02/12/2017 | 3.5 |
| 02/12/2017 | 3.9 |
| 02/12/2017 | 4.1 |
| 02/12/2017 | 4.2 |
| 02/12/2017 | 4.2 |
| 02/12/2017 | 4.1 |
| 02/12/2017 | 4.1 |
| 02/12/2017 | 4.1 |
| 02/12/2017 | 4.4 |
| 02/12/2017 | 4.6 |
| 02/12/2017 | 4.6 |
| 02/12/2017 | 4.4 |
| 02/12/2017 | 4.1 |
| 02/12/2017 | 3.7 |
| 02/12/2017 | 3.4 |
| 02/12/2017 | 3.1 |
| 02/12/2017 | 2.8 |
| 03/12/2017 | 2.6 |
| 03/12/2017 | 2.5 |
| 03/12/2017 | 2.5 |
| 03/12/2017 | 2.5 |
| 03/12/2017 | 2.5 |
| 03/12/2017 | 2.6 |
| 03/12/2017 | 2.8 |
| 03/12/2017 | 3.1 |
| 03/12/2017 | 3.3 |
| 03/12/2017 | 3.6 |
| 03/12/2017 | 3.7 |
| 03/12/2017 | 3.8 |
| 03/12/2017 | 3.7 |
| 03/12/2017 | 3.7 |
| 03/12/2017 | 3.8 |
| 03/12/2017 | 4.1 |
| 03/12/2017 | 4.3 |
| 03/12/2017 | 4.3 |
| 03/12/2017 | 4.2 |
| 03/12/2017 | 3.9 |
| 03/12/2017 | 3.6 |
| 03/12/2017 | 3.4 |
| 03/12/2017 | 3.1 |
| 03/12/2017 | 2.8 |
| 04/12/2017 | 2.6 |
| 04/12/2017 | 2.6 |
| 04/12/2017 | 2.5 |
| 04/12/2017 | 2.6 |
| 04/12/2017 | 2.9 |
| 04/12/2017 | 3.6 |
| 04/12/2017 | 4.2 |
| 04/12/2017 | 4.6 |
| 04/12/2017 | 4.8 |
| 04/12/2017 | 4.9 |
| 04/12/2017 | 5 |
| 04/12/2017 | 5 |
| 04/12/2017 | 5 |
| 04/12/2017 | 5 |
| 04/12/2017 | 5.1 |
| 04/12/2017 | 5.4 |
| 04/12/2017 | 5.6 |
| 04/12/2017 | 5.5 |
| 04/12/2017 | 5.2 |
| 04/12/2017 | 4.7 |
| 04/12/2017 | 4.1 |
| 04/12/2017 | 3.7 |
| 04/12/2017 | 3.3 |
| 04/12/2017 | 3 |
| 05/12/2017 | 2.7 |
| 05/12/2017 | 2.6 |
| 05/12/2017 | 2.6 |
| 05/12/2017 | 2.7 |
| 05/12/2017 | 3 |
| 05/12/2017 | 3.6 |
| 05/12/2017 | 4.3 |
| 05/12/2017 | 4.7 |
| 05/12/2017 | 4.8 |
| 05/12/2017 | 5 |
| 05/12/2017 | 5 |
| 05/12/2017 | 5.1 |
| 05/12/2017 | 5 |
| 05/12/2017 | 5 |
| 05/12/2017 | 5.1 |
| 05/12/2017 | 5.5 |
| 05/12/2017 | 5.7 |
| 05/12/2017 | 5.5 |
| 05/12/2017 | 5.3 |
| 05/12/2017 | 4.7 |
| 05/12/2017 | 4.2 |
| 05/12/2017 | 3.7 |
| 05/12/2017 | 3.3 |
| 05/12/2017 | 3 |
| 06/12/2017 | 2.8 |
| 06/12/2017 | 2.7 |
| 06/12/2017 | 2.6 |
| 06/12/2017 | 2.7 |
| 06/12/2017 | 3 |
| 06/12/2017 | 3.7 |
| 06/12/2017 | 4.3 |
| 06/12/2017 | 4.7 |
| 06/12/2017 | 4.9 |
| 06/12/2017 | 5 |
| 06/12/2017 | 5.1 |
| 06/12/2017 | 5.1 |
| 06/12/2017 | 5.1 |
| 06/12/2017 | 5 |
| 06/12/2017 | 5.1 |
| 06/12/2017 | 5.5 |
| 06/12/2017 | 5.6 |
| 06/12/2017 | 5.5 |
| 06/12/2017 | 5.3 |
| 06/12/2017 | 4.7 |
| 06/12/2017 | 4.2 |
| 06/12/2017 | 3.7 |
| 06/12/2017 | 3.3 |
| 06/12/2017 | 3 |
| 07/12/2017 | 2.8 |
| 07/12/2017 | 2.7 |
| 07/12/2017 | 2.6 |
| 07/12/2017 | 2.7 |
| 07/12/2017 | 3 |
| 07/12/2017 | 3.6 |
| 07/12/2017 | 4.3 |
| 07/12/2017 | 4.7 |
| 07/12/2017 | 4.8 |
| 07/12/2017 | 5 |
| 07/12/2017 | 5 |
| 07/12/2017 | 5.1 |
| 07/12/2017 | 5 |
| 07/12/2017 | 5 |
| 07/12/2017 | 5.1 |
| 07/12/2017 | 5.4 |
| 07/12/2017 | 5.6 |
| 07/12/2017 | 5.5 |
| 07/12/2017 | 5.2 |
| 07/12/2017 | 4.7 |
| 07/12/2017 | 4.1 |
| 07/12/2017 | 3.7 |
| 07/12/2017 | 3.3 |
| 07/12/2017 | 3 |
| 08/12/2017 | 2.8 |
| 08/12/2017 | 2.7 |
| 08/12/2017 | 2.6 |
| 08/12/2017 | 2.7 |
| 08/12/2017 | 3 |
| 08/12/2017 | 3.6 |
| 08/12/2017 | 4.3 |
| 08/12/2017 | 4.6 |
| 08/12/2017 | 4.8 |
| 08/12/2017 | 5 |
| 08/12/2017 | 5 |
| 08/12/2017 | 5 |
| 08/12/2017 | 4.9 |
| 08/12/2017 | 4.9 |
| 08/12/2017 | 5 |
| 08/12/2017 | 5.3 |
| 08/12/2017 | 5.4 |
| 08/12/2017 | 5.3 |
| 08/12/2017 | 5 |
| 08/12/2017 | 4.5 |
| 08/12/2017 | 4 |
| 08/12/2017 | 3.6 |
| 08/12/2017 | 3.3 |
| 08/12/2017 | 3 |
| 09/12/2017 | 2.8 |
| 09/12/2017 | 2.6 |
| 09/12/2017 | 2.6 |
| 09/12/2017 | 2.6 |
| 09/12/2017 | 2.6 |
| 09/12/2017 | 2.8 |
| 09/12/2017 | 3.1 |
| 09/12/2017 | 3.5 |
| 09/12/2017 | 3.8 |
| 09/12/2017 | 4.1 |
| 09/12/2017 | 4.2 |
| 09/12/2017 | 4.2 |
| 09/12/2017 | 4.1 |
| 09/12/2017 | 4 |
| 09/12/2017 | 4.1 |
| 09/12/2017 | 4.4 |
| 09/12/2017 | 4.6 |
| 09/12/2017 | 4.6 |
| 09/12/2017 | 4.4 |
| 09/12/2017 | 4 |
| 09/12/2017 | 3.6 |
| 09/12/2017 | 3.4 |
| 09/12/2017 | 3.1 |
| 09/12/2017 | 2.8 |
| 10/12/2017 | 2.7 |
| 10/12/2017 | 2.6 |
| 10/12/2017 | 2.5 |
| 10/12/2017 | 2.5 |
| 10/12/2017 | 2.5 |
| 10/12/2017 | 2.6 |
| 10/12/2017 | 2.8 |
| 10/12/2017 | 3 |
| 10/12/2017 | 3.3 |
| 10/12/2017 | 3.5 |
| 10/12/2017 | 3.7 |
| 10/12/2017 | 3.8 |
| 10/12/2017 | 3.7 |
| 10/12/2017 | 3.7 |
| 10/12/2017 | 3.7 |
| 10/12/2017 | 4.1 |
| 10/12/2017 | 4.2 |
| 10/12/2017 | 4.3 |
| 10/12/2017 | 4.1 |
| 10/12/2017 | 3.9 |
| 10/12/2017 | 3.6 |
| 10/12/2017 | 3.4 |
| 10/12/2017 | 3.1 |
| 10/12/2017 | 2.9 |
| 11/12/2017 | 2.6 |
| 11/12/2017 | 2.6 |
| 11/12/2017 | 2.5 |
| 11/12/2017 | 2.6 |
| 11/12/2017 | 2.9 |
| 11/12/2017 | 3.6 |
| 11/12/2017 | 4.2 |
| 11/12/2017 | 4.6 |
| 11/12/2017 | 4.7 |
| 11/12/2017 | 4.9 |
| 11/12/2017 | 5 |
| 11/12/2017 | 5 |
| 11/12/2017 | 5 |
| 11/12/2017 | 5 |
| 11/12/2017 | 5.1 |
| 11/12/2017 | 5.4 |
| 11/12/2017 | 5.5 |
| 11/12/2017 | 5.5 |
| 11/12/2017 | 5.2 |
| 11/12/2017 | 4.7 |
| 11/12/2017 | 4.1 |
| 11/12/2017 | 3.7 |
| 11/12/2017 | 3.3 |
| 11/12/2017 | 3 |
| 12/12/2017 | 2.7 |
| 12/12/2017 | 2.6 |
| 12/12/2017 | 2.6 |
| 12/12/2017 | 2.7 |
| 12/12/2017 | 3 |
| 12/12/2017 | 3.6 |
| 12/12/2017 | 4.3 |
| 12/12/2017 | 4.6 |
| 12/12/2017 | 4.8 |
| 12/12/2017 | 4.9 |
| 12/12/2017 | 5 |
| 12/12/2017 | 5 |
| 12/12/2017 | 5 |
| 12/12/2017 | 5 |
| 12/12/2017 | 5.1 |
| 12/12/2017 | 5.5 |
| 12/12/2017 | 5.6 |
| 12/12/2017 | 5.5 |
| 12/12/2017 | 5.3 |
| 12/12/2017 | 4.7 |
| 12/12/2017 | 4.2 |
| 12/12/2017 | 3.7 |
| 12/12/2017 | 3.3 |
| 12/12/2017 | 3 |
| 13/12/2017 | 2.8 |
| 13/12/2017 | 2.7 |
| 13/12/2017 | 2.6 |
| 13/12/2017 | 2.7 |
| 13/12/2017 | 3 |
| 13/12/2017 | 3.6 |
| 13/12/2017 | 4.3 |
| 13/12/2017 | 4.6 |
| 13/12/2017 | 4.8 |
| 13/12/2017 | 5 |
| 13/12/2017 | 5 |
| 13/12/2017 | 5.1 |
| 13/12/2017 | 5 |
| 13/12/2017 | 5 |
| 13/12/2017 | 5.1 |
| 13/12/2017 | 5.5 |
| 13/12/2017 | 5.6 |
| 13/12/2017 | 5.5 |
| 13/12/2017 | 5.3 |
| 13/12/2017 | 4.7 |
| 13/12/2017 | 4.2 |
| 13/12/2017 | 3.7 |
| 13/12/2017 | 3.3 |
| 13/12/2017 | 3 |
| 14/12/2017 | 2.8 |
| 14/12/2017 | 2.7 |
| 14/12/2017 | 2.6 |
| 14/12/2017 | 2.7 |
| 14/12/2017 | 3 |
| 14/12/2017 | 3.6 |
| 14/12/2017 | 4.3 |
| 14/12/2017 | 4.6 |
| 14/12/2017 | 4.8 |
| 14/12/2017 | 4.9 |
| 14/12/2017 | 5 |
| 14/12/2017 | 5 |
| 14/12/2017 | 5 |
| 14/12/2017 | 5 |
| 14/12/2017 | 5.1 |
| 14/12/2017 | 5.4 |
| 14/12/2017 | 5.5 |
| 14/12/2017 | 5.4 |
| 14/12/2017 | 5.2 |
| 14/12/2017 | 4.7 |
| 14/12/2017 | 4.1 |
| 14/12/2017 | 3.7 |
| 14/12/2017 | 3.3 |
| 14/12/2017 | 3 |
| 15/12/2017 | 2.8 |
| 15/12/2017 | 2.7 |
| 15/12/2017 | 2.6 |
| 15/12/2017 | 2.7 |
| 15/12/2017 | 3 |
| 15/12/2017 | 3.6 |
| 15/12/2017 | 4.2 |
| 15/12/2017 | 4.6 |
| 15/12/2017 | 4.8 |
| 15/12/2017 | 4.9 |
| 15/12/2017 | 5 |
| 15/12/2017 | 5 |
| 15/12/2017 | 4.9 |
| 15/12/2017 | 4.9 |
| 15/12/2017 | 5 |
| 15/12/2017 | 5.3 |
| 15/12/2017 | 5.4 |
| 15/12/2017 | 5.3 |
| 15/12/2017 | 5 |
| 15/12/2017 | 4.5 |
| 15/12/2017 | 4 |
| 15/12/2017 | 3.6 |
| 15/12/2017 | 3.3 |
| 15/12/2017 | 3 |
| 16/12/2017 | 2.8 |
| 16/12/2017 | 2.6 |
| 16/12/2017 | 2.6 |
| 16/12/2017 | 2.6 |
| 16/12/2017 | 2.6 |
| 16/12/2017 | 2.8 |
| 16/12/2017 | 3.1 |
| 16/12/2017 | 3.4 |
| 16/12/2017 | 3.8 |
| 16/12/2017 | 4 |
| 16/12/2017 | 4.1 |
| 16/12/2017 | 4.2 |
| 16/12/2017 | 4.1 |
| 16/12/2017 | 4 |
| 16/12/2017 | 4.1 |
| 16/12/2017 | 4.4 |
| 16/12/2017 | 4.5 |
| 16/12/2017 | 4.5 |
| 16/12/2017 | 4.4 |
| 16/12/2017 | 4 |
| 16/12/2017 | 3.6 |
| 16/12/2017 | 3.4 |
| 16/12/2017 | 3.1 |
| 16/12/2017 | 2.8 |
| 17/12/2017 | 2.7 |
| 17/12/2017 | 2.6 |
| 17/12/2017 | 2.5 |
| 17/12/2017 | 2.5 |
| 17/12/2017 | 2.5 |
| 17/12/2017 | 2.6 |
| 17/12/2017 | 2.7 |
| 17/12/2017 | 3 |
| 17/12/2017 | 3.3 |
| 17/12/2017 | 3.5 |
| 17/12/2017 | 3.7 |
| 17/12/2017 | 3.8 |
| 17/12/2017 | 3.7 |
| 17/12/2017 | 3.7 |
| 17/12/2017 | 3.7 |
| 17/12/2017 | 4 |
| 17/12/2017 | 4.2 |
| 17/12/2017 | 4.3 |
| 17/12/2017 | 4.1 |
| 17/12/2017 | 3.9 |
| 17/12/2017 | 3.6 |
| 17/12/2017 | 3.4 |
| 17/12/2017 | 3.1 |
| 17/12/2017 | 2.9 |
| 18/12/2017 | 2.7 |
| 18/12/2017 | 2.6 |
| 18/12/2017 | 2.5 |
| 18/12/2017 | 2.6 |
| 18/12/2017 | 2.9 |
| 18/12/2017 | 3.5 |
| 18/12/2017 | 4.2 |
| 18/12/2017 | 4.5 |
| 18/12/2017 | 4.7 |
| 18/12/2017 | 4.8 |
| 18/12/2017 | 4.9 |
| 18/12/2017 | 5 |
| 18/12/2017 | 4.9 |
| 18/12/2017 | 4.9 |
| 18/12/2017 | 5 |
| 18/12/2017 | 5.4 |
| 18/12/2017 | 5.5 |
| 18/12/2017 | 5.4 |
| 18/12/2017 | 5.2 |
| 18/12/2017 | 4.6 |
| 18/12/2017 | 4.1 |
| 18/12/2017 | 3.7 |
| 18/12/2017 | 3.3 |
| 18/12/2017 | 3 |
| 19/12/2017 | 2.8 |
| 19/12/2017 | 2.6 |
| 19/12/2017 | 2.6 |
| 19/12/2017 | 2.7 |
| 19/12/2017 | 3 |
| 19/12/2017 | 3.6 |
| 19/12/2017 | 4.2 |
| 19/12/2017 | 4.6 |
| 19/12/2017 | 4.7 |
| 19/12/2017 | 4.9 |
| 19/12/2017 | 5 |
| 19/12/2017 | 5 |
| 19/12/2017 | 5 |
| 19/12/2017 | 5 |
| 19/12/2017 | 5.1 |
| 19/12/2017 | 5.4 |
| 19/12/2017 | 5.5 |
| 19/12/2017 | 5.5 |
| 19/12/2017 | 5.2 |
| 19/12/2017 | 4.7 |
| 19/12/2017 | 4.2 |
| 19/12/2017 | 3.7 |
| 19/12/2017 | 3.3 |
| 19/12/2017 | 3 |
| 20/12/2017 | 2.8 |
| 20/12/2017 | 2.7 |
| 20/12/2017 | 2.6 |
| 20/12/2017 | 2.7 |
| 20/12/2017 | 3 |
| 20/12/2017 | 3.6 |
| 20/12/2017 | 4.2 |
| 20/12/2017 | 4.6 |
| 20/12/2017 | 4.8 |
| 20/12/2017 | 4.9 |
| 20/12/2017 | 5 |
| 20/12/2017 | 5 |
| 20/12/2017 | 5 |
| 20/12/2017 | 5 |
| 20/12/2017 | 5.1 |
| 20/12/2017 | 5.4 |
| 20/12/2017 | 5.5 |
| 20/12/2017 | 5.5 |
| 20/12/2017 | 5.2 |
| 20/12/2017 | 4.7 |
| 20/12/2017 | 4.1 |
| 20/12/2017 | 3.7 |
| 20/12/2017 | 3.3 |
| 20/12/2017 | 3 |
| 21/12/2017 | 2.8 |
| 21/12/2017 | 2.7 |
| 21/12/2017 | 2.6 |
| 21/12/2017 | 2.7 |
| 21/12/2017 | 3 |
| 21/12/2017 | 3.6 |
| 21/12/2017 | 4.2 |
| 21/12/2017 | 4.6 |
| 21/12/2017 | 4.7 |
| 21/12/2017 | 4.9 |
| 21/12/2017 | 5 |
| 21/12/2017 | 5 |
| 21/12/2017 | 4.9 |
| 21/12/2017 | 5 |
| 21/12/2017 | 5.1 |
| 21/12/2017 | 5.4 |
| 21/12/2017 | 5.4 |
| 21/12/2017 | 5.4 |
| 21/12/2017 | 5.2 |
| 21/12/2017 | 4.6 |
| 21/12/2017 | 4.1 |
| 21/12/2017 | 3.7 |
| 21/12/2017 | 3.3 |
| 21/12/2017 | 3 |
| 22/12/2017 | 2.8 |
| 22/12/2017 | 2.7 |
| 22/12/2017 | 2.6 |
| 22/12/2017 | 2.7 |
| 22/12/2017 | 2.9 |
| 22/12/2017 | 3.4 |
| 22/12/2017 | 4 |
| 22/12/2017 | 4.4 |
| 22/12/2017 | 4.6 |
| 22/12/2017 | 4.8 |
| 22/12/2017 | 4.9 |
| 22/12/2017 | 4.9 |
| 22/12/2017 | 4.8 |
| 22/12/2017 | 4.7 |
| 22/12/2017 | 4.8 |
| 22/12/2017 | 5.1 |
| 22/12/2017 | 5.2 |
| 22/12/2017 | 5.1 |
| 22/12/2017 | 4.9 |
| 22/12/2017 | 4.3 |
| 22/12/2017 | 3.9 |
| 22/12/2017 | 3.6 |
| 22/12/2017 | 3.2 |
| 22/12/2017 | 3 |
| 23/12/2017 | 2.8 |
| 23/12/2017 | 2.6 |
| 23/12/2017 | 2.6 |
| 23/12/2017 | 2.5 |
| 23/12/2017 | 2.6 |
| 23/12/2017 | 2.6 |
| 23/12/2017 | 2.9 |
| 23/12/2017 | 3.3 |
| 23/12/2017 | 3.6 |
| 23/12/2017 | 3.9 |
| 23/12/2017 | 4 |
| 23/12/2017 | 4.1 |
| 23/12/2017 | 3.9 |
| 23/12/2017 | 3.9 |
| 23/12/2017 | 4 |
| 23/12/2017 | 4.2 |
| 23/12/2017 | 4.3 |
| 23/12/2017 | 4.4 |
| 23/12/2017 | 4.2 |
| 23/12/2017 | 3.9 |
| 23/12/2017 | 3.5 |
| 23/12/2017 | 3.3 |
| 23/12/2017 | 3.1 |
| 23/12/2017 | 2.9 |
| 24/12/2017 | 2.7 |
| 24/12/2017 | 2.6 |
| 24/12/2017 | 2.5 |
| 24/12/2017 | 2.4 |
| 24/12/2017 | 2.4 |
| 24/12/2017 | 2.4 |
| 24/12/2017 | 2.6 |
| 24/12/2017 | 2.9 |
| 24/12/2017 | 3.2 |
| 24/12/2017 | 3.4 |
| 24/12/2017 | 3.6 |
| 24/12/2017 | 3.7 |
| 24/12/2017 | 3.6 |
| 24/12/2017 | 3.5 |
| 24/12/2017 | 3.6 |
| 24/12/2017 | 3.9 |
| 24/12/2017 | 4 |
| 24/12/2017 | 4.1 |
| 24/12/2017 | 4 |
| 24/12/2017 | 3.7 |
| 24/12/2017 | 3.5 |
| 24/12/2017 | 3.4 |
| 24/12/2017 | 3.1 |
| 24/12/2017 | 2.7 |
| 25/12/2017 | 2.5 |
| 25/12/2017 | 2.4 |
| 25/12/2017 | 2.4 |
| 25/12/2017 | 2.4 |
| 25/12/2017 | 2.4 |
| 25/12/2017 | 2.5 |
| 25/12/2017 | 2.6 |
| 25/12/2017 | 2.8 |
| 25/12/2017 | 3.1 |
| 25/12/2017 | 3.3 |
| 25/12/2017 | 3.6 |
| 25/12/2017 | 3.6 |
| 25/12/2017 | 3.4 |
| 25/12/2017 | 3.3 |
| 25/12/2017 | 3.3 |
| 25/12/2017 | 3.5 |
| 25/12/2017 | 3.7 |
| 25/12/2017 | 3.7 |
| 25/12/2017 | 3.6 |
| 25/12/2017 | 3.4 |
| 25/12/2017 | 3.3 |
| 25/12/2017 | 3.1 |
| 25/12/2017 | 2.9 |
| 25/12/2017 | 2.7 |
| 26/12/2017 | 2.5 |
| 26/12/2017 | 2.4 |
| 26/12/2017 | 2.4 |
| 26/12/2017 | 2.4 |
| 26/12/2017 | 2.4 |
| 26/12/2017 | 2.5 |
| 26/12/2017 | 2.6 |
| 26/12/2017 | 2.8 |
| 26/12/2017 | 3.1 |
| 26/12/2017 | 3.3 |
| 26/12/2017 | 3.6 |
| 26/12/2017 | 3.6 |
| 26/12/2017 | 3.4 |
| 26/12/2017 | 3.3 |
| 26/12/2017 | 3.3 |
| 26/12/2017 | 3.5 |
| 26/12/2017 | 3.6 |
| 26/12/2017 | 3.7 |
| 26/12/2017 | 3.6 |
| 26/12/2017 | 3.4 |
| 26/12/2017 | 3.3 |
| 26/12/2017 | 3.1 |
| 26/12/2017 | 2.9 |
| 26/12/2017 | 2.9 |
| 27/12/2017 | 2.6 |
| 27/12/2017 | 2.5 |
| 27/12/2017 | 2.5 |
| 27/12/2017 | 2.5 |
| 27/12/2017 | 2.7 |
| 27/12/2017 | 3 |
| 27/12/2017 | 3.3 |
| 27/12/2017 | 3.7 |
| 27/12/2017 | 3.9 |
| 27/12/2017 | 4.1 |
| 27/12/2017 | 4.2 |
| 27/12/2017 | 4.3 |
| 27/12/2017 | 4.2 |
| 27/12/2017 | 4.2 |
| 27/12/2017 | 4.2 |
| 27/12/2017 | 4.6 |
| 27/12/2017 | 4.7 |
| 27/12/2017 | 4.7 |
| 27/12/2017 | 4.6 |
| 27/12/2017 | 4.2 |
| 27/12/2017 | 3.8 |
| 27/12/2017 | 3.5 |
| 27/12/2017 | 3.2 |
| 27/12/2017 | 2.9 |
| 28/12/2017 | 2.6 |
| 28/12/2017 | 2.5 |
| 28/12/2017 | 2.5 |
| 28/12/2017 | 2.5 |
| 28/12/2017 | 2.7 |
| 28/12/2017 | 2.9 |
| 28/12/2017 | 3.3 |
| 28/12/2017 | 3.6 |
| 28/12/2017 | 3.9 |
| 28/12/2017 | 4.1 |
| 28/12/2017 | 4.2 |
| 28/12/2017 | 4.3 |
| 28/12/2017 | 4.2 |
| 28/12/2017 | 4.2 |
| 28/12/2017 | 4.2 |
| 28/12/2017 | 4.6 |
| 28/12/2017 | 4.7 |
| 28/12/2017 | 4.7 |
| 28/12/2017 | 4.6 |
| 28/12/2017 | 4.2 |
| 28/12/2017 | 3.8 |
| 28/12/2017 | 3.5 |
| 28/12/2017 | 3.2 |
| 28/12/2017 | 2.9 |
| 29/12/2017 | 2.6 |
| 29/12/2017 | 2.5 |
| 29/12/2017 | 2.5 |
| 29/12/2017 | 2.5 |
| 29/12/2017 | 2.7 |
| 29/12/2017 | 2.9 |
| 29/12/2017 | 3.3 |
| 29/12/2017 | 3.6 |
| 29/12/2017 | 3.9 |
| 29/12/2017 | 4.1 |
| 29/12/2017 | 4.2 |
| 29/12/2017 | 4.3 |
| 29/12/2017 | 4.2 |
| 29/12/2017 | 4.2 |
| 29/12/2017 | 4.2 |
| 29/12/2017 | 4.6 |
| 29/12/2017 | 4.7 |
| 29/12/2017 | 4.7 |
| 29/12/2017 | 4.6 |
| 29/12/2017 | 4.2 |
| 29/12/2017 | 3.8 |
| 29/12/2017 | 3.5 |
| 29/12/2017 | 3.2 |
| 29/12/2017 | 2.9 |
| 30/12/2017 | 2.6 |
| 30/12/2017 | 2.5 |
| 30/12/2017 | 2.5 |
| 30/12/2017 | 2.5 |
| 30/12/2017 | 2.7 |
| 30/12/2017 | 2.9 |
| 30/12/2017 | 3.3 |
| 30/12/2017 | 3.6 |
| 30/12/2017 | 3.9 |
| 30/12/2017 | 4.1 |
| 30/12/2017 | 4.2 |
| 30/12/2017 | 4.3 |
| 30/12/2017 | 4.2 |
| 30/12/2017 | 4.2 |
| 30/12/2017 | 4.2 |
| 30/12/2017 | 4.6 |
| 30/12/2017 | 4.7 |
| 30/12/2017 | 4.7 |
| 30/12/2017 | 4.6 |
| 30/12/2017 | 4.2 |
| 30/12/2017 | 3.8 |
| 30/12/2017 | 3.5 |
| 30/12/2017 | 3.2 |
| 30/12/2017 | 3 |
| 31/12/2017 | 2.7 |
| 31/12/2017 | 2.6 |
| 31/12/2017 | 2.5 |
| 31/12/2017 | 2.5 |
| 31/12/2017 | 2.6 |
| 31/12/2017 | 2.7 |
| 31/12/2017 | 2.9 |
| 31/12/2017 | 3.3 |
| 31/12/2017 | 3.6 |
| 31/12/2017 | 3.9 |
| 31/12/2017 | 4.1 |
| 31/12/2017 | 4.1 |
| 31/12/2017 | 4.1 |
| 31/12/2017 | 4 |
| 31/12/2017 | 4.1 |
| 31/12/2017 | 4.3 |
| 31/12/2017 | 4.4 |
| 31/12/2017 | 4.2 |
| 31/12/2017 | 4 |
| 31/12/2017 | 3.6 |
| 31/12/2017 | 3.3 |
| 31/12/2017 | 3.2 |
| 31/12/2017 | 3 |